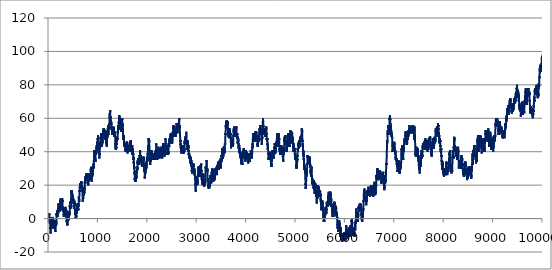
| Category | Series 0 |
|---|---|
| 0.0 | 1 |
| 1.0 | 2 |
| 2.0 | 3 |
| 3.0 | 2 |
| 4.0 | 3 |
| 5.0 | 2 |
| 6.0 | 1 |
| 7.0 | 0 |
| 8.0 | -1 |
| 9.0 | 0 |
| 10.0 | 1 |
| 11.0 | 0 |
| 12.0 | -1 |
| 13.0 | -2 |
| 14.0 | -1 |
| 15.0 | -2 |
| 16.0 | -3 |
| 17.0 | -2 |
| 18.0 | -3 |
| 19.0 | -2 |
| 20.0 | -1 |
| 21.0 | -2 |
| 22.0 | -1 |
| 23.0 | -2 |
| 24.0 | -3 |
| 25.0 | -4 |
| 26.0 | -5 |
| 27.0 | -6 |
| 28.0 | -5 |
| 29.0 | -6 |
| 30.0 | -7 |
| 31.0 | -8 |
| 32.0 | -9 |
| 33.0 | -8 |
| 34.0 | -7 |
| 35.0 | -6 |
| 36.0 | -5 |
| 37.0 | -6 |
| 38.0 | -5 |
| 39.0 | -4 |
| 40.0 | -5 |
| 41.0 | -4 |
| 42.0 | -3 |
| 43.0 | -2 |
| 44.0 | -1 |
| 45.0 | -2 |
| 46.0 | -1 |
| 47.0 | -2 |
| 48.0 | -3 |
| 49.0 | -2 |
| 50.0 | -1 |
| 51.0 | 0 |
| 52.0 | -1 |
| 53.0 | -2 |
| 54.0 | -3 |
| 55.0 | -2 |
| 56.0 | -1 |
| 57.0 | -2 |
| 58.0 | -1 |
| 59.0 | -2 |
| 60.0 | -1 |
| 61.0 | 0 |
| 62.0 | 1 |
| 63.0 | 0 |
| 64.0 | -1 |
| 65.0 | 0 |
| 66.0 | -1 |
| 67.0 | -2 |
| 68.0 | -1 |
| 69.0 | 0 |
| 70.0 | -1 |
| 71.0 | 0 |
| 72.0 | 1 |
| 73.0 | 0 |
| 74.0 | -1 |
| 75.0 | -2 |
| 76.0 | -3 |
| 77.0 | -4 |
| 78.0 | -5 |
| 79.0 | -6 |
| 80.0 | -5 |
| 81.0 | -4 |
| 82.0 | -3 |
| 83.0 | -2 |
| 84.0 | -1 |
| 85.0 | 0 |
| 86.0 | -1 |
| 87.0 | -2 |
| 88.0 | -3 |
| 89.0 | -4 |
| 90.0 | -5 |
| 91.0 | -4 |
| 92.0 | -5 |
| 93.0 | -4 |
| 94.0 | -3 |
| 95.0 | -2 |
| 96.0 | -3 |
| 97.0 | -4 |
| 98.0 | -3 |
| 99.0 | -4 |
| 100.0 | -3 |
| 101.0 | -2 |
| 102.0 | -3 |
| 103.0 | -4 |
| 104.0 | -3 |
| 105.0 | -2 |
| 106.0 | -1 |
| 107.0 | -2 |
| 108.0 | -3 |
| 109.0 | -4 |
| 110.0 | -3 |
| 111.0 | -4 |
| 112.0 | -5 |
| 113.0 | -6 |
| 114.0 | -5 |
| 115.0 | -6 |
| 116.0 | -5 |
| 117.0 | -4 |
| 118.0 | -3 |
| 119.0 | -4 |
| 120.0 | -5 |
| 121.0 | -6 |
| 122.0 | -7 |
| 123.0 | -6 |
| 124.0 | -5 |
| 125.0 | -4 |
| 126.0 | -5 |
| 127.0 | -6 |
| 128.0 | -7 |
| 129.0 | -8 |
| 130.0 | -7 |
| 131.0 | -6 |
| 132.0 | -5 |
| 133.0 | -4 |
| 134.0 | -3 |
| 135.0 | -2 |
| 136.0 | -1 |
| 137.0 | -2 |
| 138.0 | -3 |
| 139.0 | -2 |
| 140.0 | -3 |
| 141.0 | -4 |
| 142.0 | -3 |
| 143.0 | -2 |
| 144.0 | -3 |
| 145.0 | -4 |
| 146.0 | -3 |
| 147.0 | -2 |
| 148.0 | -3 |
| 149.0 | -2 |
| 150.0 | -1 |
| 151.0 | 0 |
| 152.0 | 1 |
| 153.0 | 2 |
| 154.0 | 3 |
| 155.0 | 2 |
| 156.0 | 3 |
| 157.0 | 2 |
| 158.0 | 3 |
| 159.0 | 2 |
| 160.0 | 3 |
| 161.0 | 2 |
| 162.0 | 3 |
| 163.0 | 4 |
| 164.0 | 3 |
| 165.0 | 2 |
| 166.0 | 3 |
| 167.0 | 4 |
| 168.0 | 5 |
| 169.0 | 4 |
| 170.0 | 3 |
| 171.0 | 2 |
| 172.0 | 1 |
| 173.0 | 2 |
| 174.0 | 1 |
| 175.0 | 2 |
| 176.0 | 3 |
| 177.0 | 4 |
| 178.0 | 3 |
| 179.0 | 4 |
| 180.0 | 3 |
| 181.0 | 4 |
| 182.0 | 5 |
| 183.0 | 6 |
| 184.0 | 5 |
| 185.0 | 4 |
| 186.0 | 3 |
| 187.0 | 4 |
| 188.0 | 5 |
| 189.0 | 6 |
| 190.0 | 7 |
| 191.0 | 6 |
| 192.0 | 7 |
| 193.0 | 8 |
| 194.0 | 9 |
| 195.0 | 8 |
| 196.0 | 9 |
| 197.0 | 8 |
| 198.0 | 7 |
| 199.0 | 8 |
| 200.0 | 9 |
| 201.0 | 8 |
| 202.0 | 9 |
| 203.0 | 8 |
| 204.0 | 7 |
| 205.0 | 8 |
| 206.0 | 7 |
| 207.0 | 8 |
| 208.0 | 7 |
| 209.0 | 6 |
| 210.0 | 5 |
| 211.0 | 4 |
| 212.0 | 5 |
| 213.0 | 6 |
| 214.0 | 7 |
| 215.0 | 6 |
| 216.0 | 5 |
| 217.0 | 6 |
| 218.0 | 7 |
| 219.0 | 8 |
| 220.0 | 7 |
| 221.0 | 8 |
| 222.0 | 7 |
| 223.0 | 8 |
| 224.0 | 7 |
| 225.0 | 8 |
| 226.0 | 9 |
| 227.0 | 10 |
| 228.0 | 9 |
| 229.0 | 10 |
| 230.0 | 11 |
| 231.0 | 12 |
| 232.0 | 11 |
| 233.0 | 10 |
| 234.0 | 11 |
| 235.0 | 10 |
| 236.0 | 9 |
| 237.0 | 10 |
| 238.0 | 9 |
| 239.0 | 10 |
| 240.0 | 9 |
| 241.0 | 10 |
| 242.0 | 9 |
| 243.0 | 8 |
| 244.0 | 7 |
| 245.0 | 6 |
| 246.0 | 5 |
| 247.0 | 6 |
| 248.0 | 7 |
| 249.0 | 8 |
| 250.0 | 9 |
| 251.0 | 10 |
| 252.0 | 11 |
| 253.0 | 10 |
| 254.0 | 11 |
| 255.0 | 12 |
| 256.0 | 11 |
| 257.0 | 10 |
| 258.0 | 11 |
| 259.0 | 12 |
| 260.0 | 11 |
| 261.0 | 10 |
| 262.0 | 9 |
| 263.0 | 8 |
| 264.0 | 9 |
| 265.0 | 10 |
| 266.0 | 11 |
| 267.0 | 12 |
| 268.0 | 11 |
| 269.0 | 10 |
| 270.0 | 11 |
| 271.0 | 10 |
| 272.0 | 11 |
| 273.0 | 10 |
| 274.0 | 9 |
| 275.0 | 8 |
| 276.0 | 7 |
| 277.0 | 6 |
| 278.0 | 7 |
| 279.0 | 6 |
| 280.0 | 7 |
| 281.0 | 6 |
| 282.0 | 5 |
| 283.0 | 6 |
| 284.0 | 5 |
| 285.0 | 6 |
| 286.0 | 5 |
| 287.0 | 4 |
| 288.0 | 5 |
| 289.0 | 6 |
| 290.0 | 7 |
| 291.0 | 6 |
| 292.0 | 5 |
| 293.0 | 6 |
| 294.0 | 5 |
| 295.0 | 4 |
| 296.0 | 3 |
| 297.0 | 2 |
| 298.0 | 1 |
| 299.0 | 2 |
| 300.0 | 3 |
| 301.0 | 2 |
| 302.0 | 1 |
| 303.0 | 2 |
| 304.0 | 3 |
| 305.0 | 4 |
| 306.0 | 3 |
| 307.0 | 4 |
| 308.0 | 3 |
| 309.0 | 4 |
| 310.0 | 3 |
| 311.0 | 4 |
| 312.0 | 5 |
| 313.0 | 4 |
| 314.0 | 3 |
| 315.0 | 2 |
| 316.0 | 3 |
| 317.0 | 4 |
| 318.0 | 3 |
| 319.0 | 2 |
| 320.0 | 3 |
| 321.0 | 2 |
| 322.0 | 1 |
| 323.0 | 2 |
| 324.0 | 3 |
| 325.0 | 4 |
| 326.0 | 3 |
| 327.0 | 2 |
| 328.0 | 3 |
| 329.0 | 4 |
| 330.0 | 5 |
| 331.0 | 6 |
| 332.0 | 7 |
| 333.0 | 6 |
| 334.0 | 5 |
| 335.0 | 4 |
| 336.0 | 5 |
| 337.0 | 6 |
| 338.0 | 5 |
| 339.0 | 4 |
| 340.0 | 3 |
| 341.0 | 2 |
| 342.0 | 1 |
| 343.0 | 2 |
| 344.0 | 3 |
| 345.0 | 4 |
| 346.0 | 5 |
| 347.0 | 4 |
| 348.0 | 5 |
| 349.0 | 4 |
| 350.0 | 5 |
| 351.0 | 4 |
| 352.0 | 3 |
| 353.0 | 2 |
| 354.0 | 1 |
| 355.0 | 0 |
| 356.0 | 1 |
| 357.0 | 0 |
| 358.0 | -1 |
| 359.0 | -2 |
| 360.0 | -1 |
| 361.0 | -2 |
| 362.0 | -3 |
| 363.0 | -2 |
| 364.0 | -1 |
| 365.0 | -2 |
| 366.0 | -1 |
| 367.0 | -2 |
| 368.0 | -3 |
| 369.0 | -4 |
| 370.0 | -3 |
| 371.0 | -4 |
| 372.0 | -3 |
| 373.0 | -2 |
| 374.0 | -1 |
| 375.0 | 0 |
| 376.0 | -1 |
| 377.0 | -2 |
| 378.0 | -1 |
| 379.0 | 0 |
| 380.0 | 1 |
| 381.0 | 2 |
| 382.0 | 3 |
| 383.0 | 4 |
| 384.0 | 3 |
| 385.0 | 4 |
| 386.0 | 3 |
| 387.0 | 4 |
| 388.0 | 3 |
| 389.0 | 4 |
| 390.0 | 3 |
| 391.0 | 2 |
| 392.0 | 1 |
| 393.0 | 2 |
| 394.0 | 1 |
| 395.0 | 0 |
| 396.0 | -1 |
| 397.0 | 0 |
| 398.0 | 1 |
| 399.0 | 0 |
| 400.0 | 1 |
| 401.0 | 2 |
| 402.0 | 1 |
| 403.0 | 2 |
| 404.0 | 3 |
| 405.0 | 2 |
| 406.0 | 1 |
| 407.0 | 2 |
| 408.0 | 3 |
| 409.0 | 4 |
| 410.0 | 3 |
| 411.0 | 2 |
| 412.0 | 3 |
| 413.0 | 4 |
| 414.0 | 3 |
| 415.0 | 2 |
| 416.0 | 3 |
| 417.0 | 4 |
| 418.0 | 5 |
| 419.0 | 6 |
| 420.0 | 7 |
| 421.0 | 8 |
| 422.0 | 7 |
| 423.0 | 8 |
| 424.0 | 7 |
| 425.0 | 6 |
| 426.0 | 7 |
| 427.0 | 8 |
| 428.0 | 9 |
| 429.0 | 10 |
| 430.0 | 9 |
| 431.0 | 10 |
| 432.0 | 9 |
| 433.0 | 10 |
| 434.0 | 9 |
| 435.0 | 8 |
| 436.0 | 7 |
| 437.0 | 6 |
| 438.0 | 7 |
| 439.0 | 8 |
| 440.0 | 7 |
| 441.0 | 6 |
| 442.0 | 7 |
| 443.0 | 8 |
| 444.0 | 9 |
| 445.0 | 10 |
| 446.0 | 11 |
| 447.0 | 12 |
| 448.0 | 11 |
| 449.0 | 12 |
| 450.0 | 13 |
| 451.0 | 14 |
| 452.0 | 15 |
| 453.0 | 16 |
| 454.0 | 15 |
| 455.0 | 16 |
| 456.0 | 17 |
| 457.0 | 16 |
| 458.0 | 17 |
| 459.0 | 16 |
| 460.0 | 15 |
| 461.0 | 14 |
| 462.0 | 15 |
| 463.0 | 16 |
| 464.0 | 17 |
| 465.0 | 16 |
| 466.0 | 15 |
| 467.0 | 14 |
| 468.0 | 13 |
| 469.0 | 14 |
| 470.0 | 13 |
| 471.0 | 14 |
| 472.0 | 15 |
| 473.0 | 14 |
| 474.0 | 13 |
| 475.0 | 12 |
| 476.0 | 13 |
| 477.0 | 12 |
| 478.0 | 13 |
| 479.0 | 12 |
| 480.0 | 11 |
| 481.0 | 10 |
| 482.0 | 11 |
| 483.0 | 10 |
| 484.0 | 11 |
| 485.0 | 10 |
| 486.0 | 11 |
| 487.0 | 10 |
| 488.0 | 11 |
| 489.0 | 10 |
| 490.0 | 11 |
| 491.0 | 10 |
| 492.0 | 11 |
| 493.0 | 12 |
| 494.0 | 11 |
| 495.0 | 10 |
| 496.0 | 9 |
| 497.0 | 10 |
| 498.0 | 9 |
| 499.0 | 8 |
| 500.0 | 7 |
| 501.0 | 8 |
| 502.0 | 7 |
| 503.0 | 6 |
| 504.0 | 7 |
| 505.0 | 8 |
| 506.0 | 9 |
| 507.0 | 8 |
| 508.0 | 9 |
| 509.0 | 10 |
| 510.0 | 11 |
| 511.0 | 10 |
| 512.0 | 9 |
| 513.0 | 8 |
| 514.0 | 9 |
| 515.0 | 8 |
| 516.0 | 9 |
| 517.0 | 8 |
| 518.0 | 9 |
| 519.0 | 10 |
| 520.0 | 9 |
| 521.0 | 8 |
| 522.0 | 7 |
| 523.0 | 6 |
| 524.0 | 5 |
| 525.0 | 4 |
| 526.0 | 5 |
| 527.0 | 4 |
| 528.0 | 5 |
| 529.0 | 4 |
| 530.0 | 3 |
| 531.0 | 4 |
| 532.0 | 3 |
| 533.0 | 2 |
| 534.0 | 3 |
| 535.0 | 4 |
| 536.0 | 5 |
| 537.0 | 4 |
| 538.0 | 3 |
| 539.0 | 2 |
| 540.0 | 1 |
| 541.0 | 0 |
| 542.0 | 1 |
| 543.0 | 0 |
| 544.0 | 1 |
| 545.0 | 2 |
| 546.0 | 1 |
| 547.0 | 2 |
| 548.0 | 1 |
| 549.0 | 0 |
| 550.0 | 1 |
| 551.0 | 2 |
| 552.0 | 1 |
| 553.0 | 2 |
| 554.0 | 3 |
| 555.0 | 4 |
| 556.0 | 5 |
| 557.0 | 6 |
| 558.0 | 5 |
| 559.0 | 6 |
| 560.0 | 5 |
| 561.0 | 6 |
| 562.0 | 5 |
| 563.0 | 6 |
| 564.0 | 5 |
| 565.0 | 4 |
| 566.0 | 3 |
| 567.0 | 4 |
| 568.0 | 5 |
| 569.0 | 6 |
| 570.0 | 7 |
| 571.0 | 6 |
| 572.0 | 7 |
| 573.0 | 8 |
| 574.0 | 7 |
| 575.0 | 6 |
| 576.0 | 7 |
| 577.0 | 8 |
| 578.0 | 9 |
| 579.0 | 8 |
| 580.0 | 9 |
| 581.0 | 8 |
| 582.0 | 7 |
| 583.0 | 8 |
| 584.0 | 7 |
| 585.0 | 6 |
| 586.0 | 7 |
| 587.0 | 6 |
| 588.0 | 7 |
| 589.0 | 6 |
| 590.0 | 5 |
| 591.0 | 6 |
| 592.0 | 5 |
| 593.0 | 6 |
| 594.0 | 7 |
| 595.0 | 8 |
| 596.0 | 9 |
| 597.0 | 8 |
| 598.0 | 7 |
| 599.0 | 8 |
| 600.0 | 9 |
| 601.0 | 10 |
| 602.0 | 11 |
| 603.0 | 12 |
| 604.0 | 13 |
| 605.0 | 12 |
| 606.0 | 11 |
| 607.0 | 10 |
| 608.0 | 11 |
| 609.0 | 12 |
| 610.0 | 11 |
| 611.0 | 10 |
| 612.0 | 11 |
| 613.0 | 12 |
| 614.0 | 13 |
| 615.0 | 14 |
| 616.0 | 15 |
| 617.0 | 16 |
| 618.0 | 17 |
| 619.0 | 16 |
| 620.0 | 17 |
| 621.0 | 16 |
| 622.0 | 17 |
| 623.0 | 18 |
| 624.0 | 19 |
| 625.0 | 18 |
| 626.0 | 19 |
| 627.0 | 20 |
| 628.0 | 21 |
| 629.0 | 20 |
| 630.0 | 21 |
| 631.0 | 20 |
| 632.0 | 19 |
| 633.0 | 18 |
| 634.0 | 19 |
| 635.0 | 20 |
| 636.0 | 19 |
| 637.0 | 20 |
| 638.0 | 19 |
| 639.0 | 20 |
| 640.0 | 21 |
| 641.0 | 20 |
| 642.0 | 19 |
| 643.0 | 20 |
| 644.0 | 21 |
| 645.0 | 20 |
| 646.0 | 21 |
| 647.0 | 20 |
| 648.0 | 21 |
| 649.0 | 22 |
| 650.0 | 21 |
| 651.0 | 22 |
| 652.0 | 21 |
| 653.0 | 22 |
| 654.0 | 21 |
| 655.0 | 22 |
| 656.0 | 21 |
| 657.0 | 20 |
| 658.0 | 19 |
| 659.0 | 18 |
| 660.0 | 19 |
| 661.0 | 20 |
| 662.0 | 19 |
| 663.0 | 20 |
| 664.0 | 19 |
| 665.0 | 18 |
| 666.0 | 17 |
| 667.0 | 18 |
| 668.0 | 19 |
| 669.0 | 18 |
| 670.0 | 17 |
| 671.0 | 16 |
| 672.0 | 17 |
| 673.0 | 18 |
| 674.0 | 17 |
| 675.0 | 18 |
| 676.0 | 17 |
| 677.0 | 16 |
| 678.0 | 15 |
| 679.0 | 14 |
| 680.0 | 13 |
| 681.0 | 12 |
| 682.0 | 11 |
| 683.0 | 10 |
| 684.0 | 11 |
| 685.0 | 12 |
| 686.0 | 13 |
| 687.0 | 14 |
| 688.0 | 13 |
| 689.0 | 12 |
| 690.0 | 13 |
| 691.0 | 12 |
| 692.0 | 13 |
| 693.0 | 14 |
| 694.0 | 15 |
| 695.0 | 16 |
| 696.0 | 15 |
| 697.0 | 14 |
| 698.0 | 15 |
| 699.0 | 14 |
| 700.0 | 15 |
| 701.0 | 16 |
| 702.0 | 15 |
| 703.0 | 16 |
| 704.0 | 15 |
| 705.0 | 16 |
| 706.0 | 15 |
| 707.0 | 14 |
| 708.0 | 15 |
| 709.0 | 16 |
| 710.0 | 17 |
| 711.0 | 18 |
| 712.0 | 17 |
| 713.0 | 18 |
| 714.0 | 17 |
| 715.0 | 16 |
| 716.0 | 15 |
| 717.0 | 16 |
| 718.0 | 17 |
| 719.0 | 18 |
| 720.0 | 19 |
| 721.0 | 18 |
| 722.0 | 19 |
| 723.0 | 20 |
| 724.0 | 21 |
| 725.0 | 22 |
| 726.0 | 21 |
| 727.0 | 22 |
| 728.0 | 23 |
| 729.0 | 24 |
| 730.0 | 23 |
| 731.0 | 24 |
| 732.0 | 25 |
| 733.0 | 24 |
| 734.0 | 23 |
| 735.0 | 24 |
| 736.0 | 25 |
| 737.0 | 24 |
| 738.0 | 23 |
| 739.0 | 24 |
| 740.0 | 25 |
| 741.0 | 24 |
| 742.0 | 25 |
| 743.0 | 24 |
| 744.0 | 23 |
| 745.0 | 24 |
| 746.0 | 25 |
| 747.0 | 24 |
| 748.0 | 25 |
| 749.0 | 24 |
| 750.0 | 25 |
| 751.0 | 26 |
| 752.0 | 25 |
| 753.0 | 26 |
| 754.0 | 27 |
| 755.0 | 26 |
| 756.0 | 25 |
| 757.0 | 26 |
| 758.0 | 25 |
| 759.0 | 24 |
| 760.0 | 25 |
| 761.0 | 24 |
| 762.0 | 25 |
| 763.0 | 26 |
| 764.0 | 27 |
| 765.0 | 26 |
| 766.0 | 25 |
| 767.0 | 26 |
| 768.0 | 25 |
| 769.0 | 26 |
| 770.0 | 25 |
| 771.0 | 26 |
| 772.0 | 25 |
| 773.0 | 24 |
| 774.0 | 25 |
| 775.0 | 24 |
| 776.0 | 23 |
| 777.0 | 24 |
| 778.0 | 23 |
| 779.0 | 24 |
| 780.0 | 23 |
| 781.0 | 22 |
| 782.0 | 21 |
| 783.0 | 22 |
| 784.0 | 23 |
| 785.0 | 22 |
| 786.0 | 21 |
| 787.0 | 22 |
| 788.0 | 21 |
| 789.0 | 22 |
| 790.0 | 21 |
| 791.0 | 20 |
| 792.0 | 21 |
| 793.0 | 20 |
| 794.0 | 21 |
| 795.0 | 22 |
| 796.0 | 23 |
| 797.0 | 22 |
| 798.0 | 23 |
| 799.0 | 24 |
| 800.0 | 23 |
| 801.0 | 22 |
| 802.0 | 23 |
| 803.0 | 24 |
| 804.0 | 25 |
| 805.0 | 26 |
| 806.0 | 27 |
| 807.0 | 26 |
| 808.0 | 25 |
| 809.0 | 26 |
| 810.0 | 25 |
| 811.0 | 24 |
| 812.0 | 23 |
| 813.0 | 24 |
| 814.0 | 25 |
| 815.0 | 24 |
| 816.0 | 25 |
| 817.0 | 24 |
| 818.0 | 23 |
| 819.0 | 24 |
| 820.0 | 25 |
| 821.0 | 24 |
| 822.0 | 25 |
| 823.0 | 24 |
| 824.0 | 23 |
| 825.0 | 24 |
| 826.0 | 25 |
| 827.0 | 24 |
| 828.0 | 25 |
| 829.0 | 24 |
| 830.0 | 25 |
| 831.0 | 26 |
| 832.0 | 27 |
| 833.0 | 26 |
| 834.0 | 25 |
| 835.0 | 24 |
| 836.0 | 25 |
| 837.0 | 24 |
| 838.0 | 25 |
| 839.0 | 26 |
| 840.0 | 25 |
| 841.0 | 26 |
| 842.0 | 27 |
| 843.0 | 28 |
| 844.0 | 29 |
| 845.0 | 30 |
| 846.0 | 29 |
| 847.0 | 28 |
| 848.0 | 29 |
| 849.0 | 28 |
| 850.0 | 29 |
| 851.0 | 28 |
| 852.0 | 29 |
| 853.0 | 28 |
| 854.0 | 29 |
| 855.0 | 30 |
| 856.0 | 31 |
| 857.0 | 30 |
| 858.0 | 29 |
| 859.0 | 28 |
| 860.0 | 27 |
| 861.0 | 26 |
| 862.0 | 25 |
| 863.0 | 24 |
| 864.0 | 23 |
| 865.0 | 22 |
| 866.0 | 23 |
| 867.0 | 24 |
| 868.0 | 25 |
| 869.0 | 26 |
| 870.0 | 27 |
| 871.0 | 28 |
| 872.0 | 27 |
| 873.0 | 28 |
| 874.0 | 27 |
| 875.0 | 26 |
| 876.0 | 25 |
| 877.0 | 26 |
| 878.0 | 27 |
| 879.0 | 26 |
| 880.0 | 27 |
| 881.0 | 26 |
| 882.0 | 27 |
| 883.0 | 28 |
| 884.0 | 29 |
| 885.0 | 30 |
| 886.0 | 29 |
| 887.0 | 30 |
| 888.0 | 29 |
| 889.0 | 28 |
| 890.0 | 29 |
| 891.0 | 30 |
| 892.0 | 29 |
| 893.0 | 30 |
| 894.0 | 31 |
| 895.0 | 30 |
| 896.0 | 31 |
| 897.0 | 32 |
| 898.0 | 31 |
| 899.0 | 32 |
| 900.0 | 31 |
| 901.0 | 30 |
| 902.0 | 31 |
| 903.0 | 32 |
| 904.0 | 33 |
| 905.0 | 32 |
| 906.0 | 33 |
| 907.0 | 34 |
| 908.0 | 35 |
| 909.0 | 36 |
| 910.0 | 37 |
| 911.0 | 38 |
| 912.0 | 37 |
| 913.0 | 38 |
| 914.0 | 39 |
| 915.0 | 40 |
| 916.0 | 41 |
| 917.0 | 40 |
| 918.0 | 39 |
| 919.0 | 40 |
| 920.0 | 39 |
| 921.0 | 40 |
| 922.0 | 39 |
| 923.0 | 38 |
| 924.0 | 37 |
| 925.0 | 36 |
| 926.0 | 37 |
| 927.0 | 36 |
| 928.0 | 37 |
| 929.0 | 38 |
| 930.0 | 37 |
| 931.0 | 36 |
| 932.0 | 35 |
| 933.0 | 36 |
| 934.0 | 35 |
| 935.0 | 34 |
| 936.0 | 35 |
| 937.0 | 36 |
| 938.0 | 35 |
| 939.0 | 34 |
| 940.0 | 35 |
| 941.0 | 36 |
| 942.0 | 37 |
| 943.0 | 38 |
| 944.0 | 39 |
| 945.0 | 40 |
| 946.0 | 41 |
| 947.0 | 40 |
| 948.0 | 41 |
| 949.0 | 40 |
| 950.0 | 39 |
| 951.0 | 38 |
| 952.0 | 39 |
| 953.0 | 38 |
| 954.0 | 39 |
| 955.0 | 40 |
| 956.0 | 39 |
| 957.0 | 40 |
| 958.0 | 41 |
| 959.0 | 40 |
| 960.0 | 41 |
| 961.0 | 42 |
| 962.0 | 43 |
| 963.0 | 42 |
| 964.0 | 41 |
| 965.0 | 42 |
| 966.0 | 43 |
| 967.0 | 44 |
| 968.0 | 43 |
| 969.0 | 42 |
| 970.0 | 43 |
| 971.0 | 44 |
| 972.0 | 45 |
| 973.0 | 46 |
| 974.0 | 45 |
| 975.0 | 46 |
| 976.0 | 45 |
| 977.0 | 44 |
| 978.0 | 45 |
| 979.0 | 46 |
| 980.0 | 45 |
| 981.0 | 44 |
| 982.0 | 45 |
| 983.0 | 44 |
| 984.0 | 45 |
| 985.0 | 46 |
| 986.0 | 47 |
| 987.0 | 48 |
| 988.0 | 47 |
| 989.0 | 48 |
| 990.0 | 49 |
| 991.0 | 50 |
| 992.0 | 49 |
| 993.0 | 50 |
| 994.0 | 49 |
| 995.0 | 48 |
| 996.0 | 49 |
| 997.0 | 48 |
| 998.0 | 47 |
| 999.0 | 46 |
| 1000.0 | 45 |
| 1001.0 | 44 |
| 1002.0 | 43 |
| 1003.0 | 44 |
| 1004.0 | 43 |
| 1005.0 | 44 |
| 1006.0 | 43 |
| 1007.0 | 42 |
| 1008.0 | 43 |
| 1009.0 | 42 |
| 1010.0 | 41 |
| 1011.0 | 40 |
| 1012.0 | 39 |
| 1013.0 | 38 |
| 1014.0 | 39 |
| 1015.0 | 38 |
| 1016.0 | 39 |
| 1017.0 | 38 |
| 1018.0 | 37 |
| 1019.0 | 36 |
| 1020.0 | 37 |
| 1021.0 | 38 |
| 1022.0 | 39 |
| 1023.0 | 38 |
| 1024.0 | 39 |
| 1025.0 | 40 |
| 1026.0 | 41 |
| 1027.0 | 42 |
| 1028.0 | 43 |
| 1029.0 | 42 |
| 1030.0 | 43 |
| 1031.0 | 44 |
| 1032.0 | 45 |
| 1033.0 | 44 |
| 1034.0 | 45 |
| 1035.0 | 46 |
| 1036.0 | 45 |
| 1037.0 | 44 |
| 1038.0 | 45 |
| 1039.0 | 46 |
| 1040.0 | 45 |
| 1041.0 | 44 |
| 1042.0 | 43 |
| 1043.0 | 44 |
| 1044.0 | 45 |
| 1045.0 | 46 |
| 1046.0 | 47 |
| 1047.0 | 48 |
| 1048.0 | 47 |
| 1049.0 | 48 |
| 1050.0 | 49 |
| 1051.0 | 50 |
| 1052.0 | 51 |
| 1053.0 | 50 |
| 1054.0 | 49 |
| 1055.0 | 50 |
| 1056.0 | 49 |
| 1057.0 | 48 |
| 1058.0 | 47 |
| 1059.0 | 46 |
| 1060.0 | 45 |
| 1061.0 | 46 |
| 1062.0 | 45 |
| 1063.0 | 44 |
| 1064.0 | 43 |
| 1065.0 | 44 |
| 1066.0 | 45 |
| 1067.0 | 46 |
| 1068.0 | 47 |
| 1069.0 | 48 |
| 1070.0 | 47 |
| 1071.0 | 46 |
| 1072.0 | 45 |
| 1073.0 | 44 |
| 1074.0 | 43 |
| 1075.0 | 44 |
| 1076.0 | 45 |
| 1077.0 | 46 |
| 1078.0 | 47 |
| 1079.0 | 46 |
| 1080.0 | 47 |
| 1081.0 | 46 |
| 1082.0 | 45 |
| 1083.0 | 46 |
| 1084.0 | 47 |
| 1085.0 | 48 |
| 1086.0 | 49 |
| 1087.0 | 50 |
| 1088.0 | 49 |
| 1089.0 | 50 |
| 1090.0 | 51 |
| 1091.0 | 50 |
| 1092.0 | 49 |
| 1093.0 | 50 |
| 1094.0 | 51 |
| 1095.0 | 52 |
| 1096.0 | 51 |
| 1097.0 | 52 |
| 1098.0 | 53 |
| 1099.0 | 52 |
| 1100.0 | 51 |
| 1101.0 | 52 |
| 1102.0 | 53 |
| 1103.0 | 52 |
| 1104.0 | 53 |
| 1105.0 | 54 |
| 1106.0 | 53 |
| 1107.0 | 52 |
| 1108.0 | 51 |
| 1109.0 | 50 |
| 1110.0 | 51 |
| 1111.0 | 50 |
| 1112.0 | 51 |
| 1113.0 | 52 |
| 1114.0 | 53 |
| 1115.0 | 54 |
| 1116.0 | 53 |
| 1117.0 | 52 |
| 1118.0 | 51 |
| 1119.0 | 50 |
| 1120.0 | 49 |
| 1121.0 | 48 |
| 1122.0 | 49 |
| 1123.0 | 48 |
| 1124.0 | 49 |
| 1125.0 | 50 |
| 1126.0 | 49 |
| 1127.0 | 48 |
| 1128.0 | 47 |
| 1129.0 | 48 |
| 1130.0 | 49 |
| 1131.0 | 50 |
| 1132.0 | 51 |
| 1133.0 | 52 |
| 1134.0 | 53 |
| 1135.0 | 52 |
| 1136.0 | 51 |
| 1137.0 | 52 |
| 1138.0 | 51 |
| 1139.0 | 52 |
| 1140.0 | 51 |
| 1141.0 | 52 |
| 1142.0 | 53 |
| 1143.0 | 52 |
| 1144.0 | 51 |
| 1145.0 | 52 |
| 1146.0 | 51 |
| 1147.0 | 50 |
| 1148.0 | 49 |
| 1149.0 | 50 |
| 1150.0 | 51 |
| 1151.0 | 50 |
| 1152.0 | 49 |
| 1153.0 | 50 |
| 1154.0 | 49 |
| 1155.0 | 50 |
| 1156.0 | 49 |
| 1157.0 | 48 |
| 1158.0 | 47 |
| 1159.0 | 46 |
| 1160.0 | 47 |
| 1161.0 | 46 |
| 1162.0 | 45 |
| 1163.0 | 46 |
| 1164.0 | 45 |
| 1165.0 | 46 |
| 1166.0 | 45 |
| 1167.0 | 44 |
| 1168.0 | 43 |
| 1169.0 | 44 |
| 1170.0 | 45 |
| 1171.0 | 44 |
| 1172.0 | 45 |
| 1173.0 | 46 |
| 1174.0 | 47 |
| 1175.0 | 48 |
| 1176.0 | 49 |
| 1177.0 | 50 |
| 1178.0 | 49 |
| 1179.0 | 48 |
| 1180.0 | 49 |
| 1181.0 | 50 |
| 1182.0 | 51 |
| 1183.0 | 52 |
| 1184.0 | 51 |
| 1185.0 | 50 |
| 1186.0 | 49 |
| 1187.0 | 50 |
| 1188.0 | 51 |
| 1189.0 | 52 |
| 1190.0 | 53 |
| 1191.0 | 54 |
| 1192.0 | 53 |
| 1193.0 | 52 |
| 1194.0 | 53 |
| 1195.0 | 54 |
| 1196.0 | 55 |
| 1197.0 | 56 |
| 1198.0 | 55 |
| 1199.0 | 54 |
| 1200.0 | 53 |
| 1201.0 | 54 |
| 1202.0 | 53 |
| 1203.0 | 52 |
| 1204.0 | 51 |
| 1205.0 | 50 |
| 1206.0 | 51 |
| 1207.0 | 52 |
| 1208.0 | 53 |
| 1209.0 | 54 |
| 1210.0 | 55 |
| 1211.0 | 54 |
| 1212.0 | 55 |
| 1213.0 | 54 |
| 1214.0 | 55 |
| 1215.0 | 56 |
| 1216.0 | 55 |
| 1217.0 | 56 |
| 1218.0 | 57 |
| 1219.0 | 56 |
| 1220.0 | 55 |
| 1221.0 | 56 |
| 1222.0 | 57 |
| 1223.0 | 58 |
| 1224.0 | 59 |
| 1225.0 | 60 |
| 1226.0 | 61 |
| 1227.0 | 62 |
| 1228.0 | 63 |
| 1229.0 | 62 |
| 1230.0 | 61 |
| 1231.0 | 60 |
| 1232.0 | 61 |
| 1233.0 | 62 |
| 1234.0 | 63 |
| 1235.0 | 64 |
| 1236.0 | 63 |
| 1237.0 | 64 |
| 1238.0 | 65 |
| 1239.0 | 64 |
| 1240.0 | 63 |
| 1241.0 | 62 |
| 1242.0 | 61 |
| 1243.0 | 60 |
| 1244.0 | 61 |
| 1245.0 | 60 |
| 1246.0 | 61 |
| 1247.0 | 60 |
| 1248.0 | 59 |
| 1249.0 | 58 |
| 1250.0 | 57 |
| 1251.0 | 56 |
| 1252.0 | 57 |
| 1253.0 | 58 |
| 1254.0 | 57 |
| 1255.0 | 58 |
| 1256.0 | 59 |
| 1257.0 | 58 |
| 1258.0 | 57 |
| 1259.0 | 56 |
| 1260.0 | 57 |
| 1261.0 | 58 |
| 1262.0 | 57 |
| 1263.0 | 56 |
| 1264.0 | 55 |
| 1265.0 | 54 |
| 1266.0 | 55 |
| 1267.0 | 54 |
| 1268.0 | 55 |
| 1269.0 | 54 |
| 1270.0 | 53 |
| 1271.0 | 54 |
| 1272.0 | 53 |
| 1273.0 | 54 |
| 1274.0 | 53 |
| 1275.0 | 54 |
| 1276.0 | 53 |
| 1277.0 | 52 |
| 1278.0 | 53 |
| 1279.0 | 52 |
| 1280.0 | 51 |
| 1281.0 | 50 |
| 1282.0 | 51 |
| 1283.0 | 50 |
| 1284.0 | 51 |
| 1285.0 | 50 |
| 1286.0 | 51 |
| 1287.0 | 52 |
| 1288.0 | 53 |
| 1289.0 | 52 |
| 1290.0 | 53 |
| 1291.0 | 52 |
| 1292.0 | 51 |
| 1293.0 | 52 |
| 1294.0 | 53 |
| 1295.0 | 52 |
| 1296.0 | 51 |
| 1297.0 | 52 |
| 1298.0 | 53 |
| 1299.0 | 52 |
| 1300.0 | 53 |
| 1301.0 | 52 |
| 1302.0 | 53 |
| 1303.0 | 52 |
| 1304.0 | 51 |
| 1305.0 | 52 |
| 1306.0 | 53 |
| 1307.0 | 54 |
| 1308.0 | 53 |
| 1309.0 | 54 |
| 1310.0 | 55 |
| 1311.0 | 54 |
| 1312.0 | 53 |
| 1313.0 | 52 |
| 1314.0 | 51 |
| 1315.0 | 52 |
| 1316.0 | 51 |
| 1317.0 | 50 |
| 1318.0 | 49 |
| 1319.0 | 50 |
| 1320.0 | 49 |
| 1321.0 | 50 |
| 1322.0 | 49 |
| 1323.0 | 50 |
| 1324.0 | 49 |
| 1325.0 | 50 |
| 1326.0 | 51 |
| 1327.0 | 50 |
| 1328.0 | 49 |
| 1329.0 | 50 |
| 1330.0 | 51 |
| 1331.0 | 52 |
| 1332.0 | 51 |
| 1333.0 | 50 |
| 1334.0 | 51 |
| 1335.0 | 52 |
| 1336.0 | 51 |
| 1337.0 | 50 |
| 1338.0 | 49 |
| 1339.0 | 48 |
| 1340.0 | 47 |
| 1341.0 | 46 |
| 1342.0 | 45 |
| 1343.0 | 44 |
| 1344.0 | 45 |
| 1345.0 | 44 |
| 1346.0 | 43 |
| 1347.0 | 42 |
| 1348.0 | 43 |
| 1349.0 | 44 |
| 1350.0 | 43 |
| 1351.0 | 42 |
| 1352.0 | 41 |
| 1353.0 | 42 |
| 1354.0 | 43 |
| 1355.0 | 44 |
| 1356.0 | 45 |
| 1357.0 | 44 |
| 1358.0 | 43 |
| 1359.0 | 42 |
| 1360.0 | 43 |
| 1361.0 | 42 |
| 1362.0 | 43 |
| 1363.0 | 44 |
| 1364.0 | 45 |
| 1365.0 | 44 |
| 1366.0 | 45 |
| 1367.0 | 44 |
| 1368.0 | 45 |
| 1369.0 | 44 |
| 1370.0 | 45 |
| 1371.0 | 46 |
| 1372.0 | 47 |
| 1373.0 | 46 |
| 1374.0 | 47 |
| 1375.0 | 46 |
| 1376.0 | 47 |
| 1377.0 | 48 |
| 1378.0 | 49 |
| 1379.0 | 48 |
| 1380.0 | 47 |
| 1381.0 | 48 |
| 1382.0 | 49 |
| 1383.0 | 48 |
| 1384.0 | 47 |
| 1385.0 | 48 |
| 1386.0 | 47 |
| 1387.0 | 48 |
| 1388.0 | 49 |
| 1389.0 | 50 |
| 1390.0 | 51 |
| 1391.0 | 52 |
| 1392.0 | 51 |
| 1393.0 | 52 |
| 1394.0 | 53 |
| 1395.0 | 52 |
| 1396.0 | 53 |
| 1397.0 | 54 |
| 1398.0 | 55 |
| 1399.0 | 56 |
| 1400.0 | 55 |
| 1401.0 | 54 |
| 1402.0 | 53 |
| 1403.0 | 54 |
| 1404.0 | 53 |
| 1405.0 | 54 |
| 1406.0 | 55 |
| 1407.0 | 54 |
| 1408.0 | 55 |
| 1409.0 | 54 |
| 1410.0 | 55 |
| 1411.0 | 56 |
| 1412.0 | 57 |
| 1413.0 | 58 |
| 1414.0 | 57 |
| 1415.0 | 58 |
| 1416.0 | 59 |
| 1417.0 | 60 |
| 1418.0 | 59 |
| 1419.0 | 60 |
| 1420.0 | 59 |
| 1421.0 | 60 |
| 1422.0 | 61 |
| 1423.0 | 62 |
| 1424.0 | 61 |
| 1425.0 | 60 |
| 1426.0 | 61 |
| 1427.0 | 60 |
| 1428.0 | 59 |
| 1429.0 | 58 |
| 1430.0 | 57 |
| 1431.0 | 58 |
| 1432.0 | 57 |
| 1433.0 | 56 |
| 1434.0 | 55 |
| 1435.0 | 54 |
| 1436.0 | 55 |
| 1437.0 | 56 |
| 1438.0 | 55 |
| 1439.0 | 54 |
| 1440.0 | 55 |
| 1441.0 | 54 |
| 1442.0 | 55 |
| 1443.0 | 56 |
| 1444.0 | 57 |
| 1445.0 | 58 |
| 1446.0 | 57 |
| 1447.0 | 58 |
| 1448.0 | 59 |
| 1449.0 | 60 |
| 1450.0 | 59 |
| 1451.0 | 60 |
| 1452.0 | 59 |
| 1453.0 | 58 |
| 1454.0 | 57 |
| 1455.0 | 56 |
| 1456.0 | 55 |
| 1457.0 | 56 |
| 1458.0 | 55 |
| 1459.0 | 54 |
| 1460.0 | 55 |
| 1461.0 | 54 |
| 1462.0 | 53 |
| 1463.0 | 52 |
| 1464.0 | 53 |
| 1465.0 | 54 |
| 1466.0 | 55 |
| 1467.0 | 54 |
| 1468.0 | 55 |
| 1469.0 | 54 |
| 1470.0 | 55 |
| 1471.0 | 54 |
| 1472.0 | 55 |
| 1473.0 | 54 |
| 1474.0 | 53 |
| 1475.0 | 54 |
| 1476.0 | 55 |
| 1477.0 | 56 |
| 1478.0 | 57 |
| 1479.0 | 58 |
| 1480.0 | 59 |
| 1481.0 | 60 |
| 1482.0 | 59 |
| 1483.0 | 58 |
| 1484.0 | 57 |
| 1485.0 | 56 |
| 1486.0 | 57 |
| 1487.0 | 56 |
| 1488.0 | 55 |
| 1489.0 | 56 |
| 1490.0 | 55 |
| 1491.0 | 56 |
| 1492.0 | 55 |
| 1493.0 | 54 |
| 1494.0 | 53 |
| 1495.0 | 54 |
| 1496.0 | 53 |
| 1497.0 | 52 |
| 1498.0 | 51 |
| 1499.0 | 50 |
| 1500.0 | 49 |
| 1501.0 | 48 |
| 1502.0 | 47 |
| 1503.0 | 48 |
| 1504.0 | 49 |
| 1505.0 | 50 |
| 1506.0 | 49 |
| 1507.0 | 50 |
| 1508.0 | 49 |
| 1509.0 | 50 |
| 1510.0 | 49 |
| 1511.0 | 50 |
| 1512.0 | 49 |
| 1513.0 | 50 |
| 1514.0 | 49 |
| 1515.0 | 50 |
| 1516.0 | 49 |
| 1517.0 | 48 |
| 1518.0 | 47 |
| 1519.0 | 46 |
| 1520.0 | 45 |
| 1521.0 | 46 |
| 1522.0 | 45 |
| 1523.0 | 44 |
| 1524.0 | 45 |
| 1525.0 | 46 |
| 1526.0 | 45 |
| 1527.0 | 44 |
| 1528.0 | 45 |
| 1529.0 | 44 |
| 1530.0 | 43 |
| 1531.0 | 44 |
| 1532.0 | 43 |
| 1533.0 | 44 |
| 1534.0 | 43 |
| 1535.0 | 44 |
| 1536.0 | 45 |
| 1537.0 | 44 |
| 1538.0 | 43 |
| 1539.0 | 44 |
| 1540.0 | 43 |
| 1541.0 | 44 |
| 1542.0 | 45 |
| 1543.0 | 44 |
| 1544.0 | 43 |
| 1545.0 | 42 |
| 1546.0 | 41 |
| 1547.0 | 42 |
| 1548.0 | 41 |
| 1549.0 | 40 |
| 1550.0 | 41 |
| 1551.0 | 42 |
| 1552.0 | 41 |
| 1553.0 | 42 |
| 1554.0 | 41 |
| 1555.0 | 42 |
| 1556.0 | 41 |
| 1557.0 | 42 |
| 1558.0 | 41 |
| 1559.0 | 40 |
| 1560.0 | 41 |
| 1561.0 | 40 |
| 1562.0 | 41 |
| 1563.0 | 40 |
| 1564.0 | 41 |
| 1565.0 | 42 |
| 1566.0 | 41 |
| 1567.0 | 40 |
| 1568.0 | 41 |
| 1569.0 | 40 |
| 1570.0 | 41 |
| 1571.0 | 42 |
| 1572.0 | 41 |
| 1573.0 | 42 |
| 1574.0 | 43 |
| 1575.0 | 44 |
| 1576.0 | 45 |
| 1577.0 | 44 |
| 1578.0 | 45 |
| 1579.0 | 46 |
| 1580.0 | 45 |
| 1581.0 | 46 |
| 1582.0 | 45 |
| 1583.0 | 44 |
| 1584.0 | 45 |
| 1585.0 | 44 |
| 1586.0 | 43 |
| 1587.0 | 42 |
| 1588.0 | 41 |
| 1589.0 | 40 |
| 1590.0 | 39 |
| 1591.0 | 40 |
| 1592.0 | 41 |
| 1593.0 | 42 |
| 1594.0 | 43 |
| 1595.0 | 42 |
| 1596.0 | 41 |
| 1597.0 | 42 |
| 1598.0 | 41 |
| 1599.0 | 42 |
| 1600.0 | 43 |
| 1601.0 | 44 |
| 1602.0 | 43 |
| 1603.0 | 42 |
| 1604.0 | 41 |
| 1605.0 | 42 |
| 1606.0 | 43 |
| 1607.0 | 42 |
| 1608.0 | 43 |
| 1609.0 | 42 |
| 1610.0 | 43 |
| 1611.0 | 44 |
| 1612.0 | 43 |
| 1613.0 | 42 |
| 1614.0 | 41 |
| 1615.0 | 42 |
| 1616.0 | 41 |
| 1617.0 | 40 |
| 1618.0 | 41 |
| 1619.0 | 40 |
| 1620.0 | 41 |
| 1621.0 | 42 |
| 1622.0 | 43 |
| 1623.0 | 42 |
| 1624.0 | 43 |
| 1625.0 | 44 |
| 1626.0 | 43 |
| 1627.0 | 44 |
| 1628.0 | 43 |
| 1629.0 | 42 |
| 1630.0 | 41 |
| 1631.0 | 42 |
| 1632.0 | 41 |
| 1633.0 | 40 |
| 1634.0 | 41 |
| 1635.0 | 42 |
| 1636.0 | 43 |
| 1637.0 | 42 |
| 1638.0 | 43 |
| 1639.0 | 44 |
| 1640.0 | 45 |
| 1641.0 | 46 |
| 1642.0 | 45 |
| 1643.0 | 46 |
| 1644.0 | 45 |
| 1645.0 | 46 |
| 1646.0 | 45 |
| 1647.0 | 44 |
| 1648.0 | 45 |
| 1649.0 | 44 |
| 1650.0 | 45 |
| 1651.0 | 46 |
| 1652.0 | 45 |
| 1653.0 | 46 |
| 1654.0 | 47 |
| 1655.0 | 46 |
| 1656.0 | 45 |
| 1657.0 | 46 |
| 1658.0 | 45 |
| 1659.0 | 44 |
| 1660.0 | 45 |
| 1661.0 | 44 |
| 1662.0 | 43 |
| 1663.0 | 44 |
| 1664.0 | 43 |
| 1665.0 | 44 |
| 1666.0 | 43 |
| 1667.0 | 42 |
| 1668.0 | 41 |
| 1669.0 | 42 |
| 1670.0 | 43 |
| 1671.0 | 44 |
| 1672.0 | 43 |
| 1673.0 | 42 |
| 1674.0 | 43 |
| 1675.0 | 42 |
| 1676.0 | 41 |
| 1677.0 | 40 |
| 1678.0 | 39 |
| 1679.0 | 38 |
| 1680.0 | 39 |
| 1681.0 | 40 |
| 1682.0 | 41 |
| 1683.0 | 42 |
| 1684.0 | 43 |
| 1685.0 | 44 |
| 1686.0 | 43 |
| 1687.0 | 42 |
| 1688.0 | 41 |
| 1689.0 | 40 |
| 1690.0 | 39 |
| 1691.0 | 40 |
| 1692.0 | 41 |
| 1693.0 | 40 |
| 1694.0 | 41 |
| 1695.0 | 40 |
| 1696.0 | 41 |
| 1697.0 | 40 |
| 1698.0 | 41 |
| 1699.0 | 42 |
| 1700.0 | 41 |
| 1701.0 | 40 |
| 1702.0 | 39 |
| 1703.0 | 38 |
| 1704.0 | 39 |
| 1705.0 | 38 |
| 1706.0 | 37 |
| 1707.0 | 36 |
| 1708.0 | 37 |
| 1709.0 | 36 |
| 1710.0 | 35 |
| 1711.0 | 36 |
| 1712.0 | 35 |
| 1713.0 | 36 |
| 1714.0 | 35 |
| 1715.0 | 34 |
| 1716.0 | 33 |
| 1717.0 | 34 |
| 1718.0 | 33 |
| 1719.0 | 32 |
| 1720.0 | 33 |
| 1721.0 | 32 |
| 1722.0 | 31 |
| 1723.0 | 30 |
| 1724.0 | 31 |
| 1725.0 | 30 |
| 1726.0 | 31 |
| 1727.0 | 30 |
| 1728.0 | 29 |
| 1729.0 | 28 |
| 1730.0 | 27 |
| 1731.0 | 28 |
| 1732.0 | 27 |
| 1733.0 | 26 |
| 1734.0 | 25 |
| 1735.0 | 24 |
| 1736.0 | 23 |
| 1737.0 | 24 |
| 1738.0 | 23 |
| 1739.0 | 22 |
| 1740.0 | 23 |
| 1741.0 | 24 |
| 1742.0 | 25 |
| 1743.0 | 24 |
| 1744.0 | 23 |
| 1745.0 | 24 |
| 1746.0 | 25 |
| 1747.0 | 24 |
| 1748.0 | 25 |
| 1749.0 | 26 |
| 1750.0 | 27 |
| 1751.0 | 26 |
| 1752.0 | 25 |
| 1753.0 | 26 |
| 1754.0 | 25 |
| 1755.0 | 26 |
| 1756.0 | 25 |
| 1757.0 | 24 |
| 1758.0 | 23 |
| 1759.0 | 22 |
| 1760.0 | 23 |
| 1761.0 | 22 |
| 1762.0 | 23 |
| 1763.0 | 24 |
| 1764.0 | 25 |
| 1765.0 | 26 |
| 1766.0 | 25 |
| 1767.0 | 26 |
| 1768.0 | 25 |
| 1769.0 | 24 |
| 1770.0 | 25 |
| 1771.0 | 26 |
| 1772.0 | 27 |
| 1773.0 | 28 |
| 1774.0 | 29 |
| 1775.0 | 28 |
| 1776.0 | 27 |
| 1777.0 | 28 |
| 1778.0 | 29 |
| 1779.0 | 28 |
| 1780.0 | 27 |
| 1781.0 | 28 |
| 1782.0 | 27 |
| 1783.0 | 28 |
| 1784.0 | 29 |
| 1785.0 | 30 |
| 1786.0 | 29 |
| 1787.0 | 30 |
| 1788.0 | 31 |
| 1789.0 | 30 |
| 1790.0 | 31 |
| 1791.0 | 32 |
| 1792.0 | 33 |
| 1793.0 | 34 |
| 1794.0 | 33 |
| 1795.0 | 34 |
| 1796.0 | 35 |
| 1797.0 | 34 |
| 1798.0 | 33 |
| 1799.0 | 34 |
| 1800.0 | 33 |
| 1801.0 | 34 |
| 1802.0 | 35 |
| 1803.0 | 36 |
| 1804.0 | 35 |
| 1805.0 | 36 |
| 1806.0 | 35 |
| 1807.0 | 36 |
| 1808.0 | 35 |
| 1809.0 | 34 |
| 1810.0 | 35 |
| 1811.0 | 34 |
| 1812.0 | 33 |
| 1813.0 | 32 |
| 1814.0 | 33 |
| 1815.0 | 34 |
| 1816.0 | 35 |
| 1817.0 | 36 |
| 1818.0 | 35 |
| 1819.0 | 36 |
| 1820.0 | 35 |
| 1821.0 | 36 |
| 1822.0 | 35 |
| 1823.0 | 34 |
| 1824.0 | 33 |
| 1825.0 | 32 |
| 1826.0 | 33 |
| 1827.0 | 34 |
| 1828.0 | 35 |
| 1829.0 | 36 |
| 1830.0 | 37 |
| 1831.0 | 38 |
| 1832.0 | 37 |
| 1833.0 | 36 |
| 1834.0 | 35 |
| 1835.0 | 36 |
| 1836.0 | 35 |
| 1837.0 | 36 |
| 1838.0 | 35 |
| 1839.0 | 36 |
| 1840.0 | 37 |
| 1841.0 | 38 |
| 1842.0 | 39 |
| 1843.0 | 40 |
| 1844.0 | 41 |
| 1845.0 | 40 |
| 1846.0 | 39 |
| 1847.0 | 38 |
| 1848.0 | 37 |
| 1849.0 | 36 |
| 1850.0 | 37 |
| 1851.0 | 36 |
| 1852.0 | 37 |
| 1853.0 | 38 |
| 1854.0 | 37 |
| 1855.0 | 36 |
| 1856.0 | 37 |
| 1857.0 | 38 |
| 1858.0 | 37 |
| 1859.0 | 38 |
| 1860.0 | 37 |
| 1861.0 | 38 |
| 1862.0 | 37 |
| 1863.0 | 38 |
| 1864.0 | 37 |
| 1865.0 | 36 |
| 1866.0 | 37 |
| 1867.0 | 36 |
| 1868.0 | 35 |
| 1869.0 | 34 |
| 1870.0 | 35 |
| 1871.0 | 34 |
| 1872.0 | 33 |
| 1873.0 | 34 |
| 1874.0 | 35 |
| 1875.0 | 34 |
| 1876.0 | 35 |
| 1877.0 | 34 |
| 1878.0 | 33 |
| 1879.0 | 32 |
| 1880.0 | 31 |
| 1881.0 | 32 |
| 1882.0 | 33 |
| 1883.0 | 34 |
| 1884.0 | 35 |
| 1885.0 | 36 |
| 1886.0 | 35 |
| 1887.0 | 34 |
| 1888.0 | 35 |
| 1889.0 | 36 |
| 1890.0 | 35 |
| 1891.0 | 34 |
| 1892.0 | 33 |
| 1893.0 | 32 |
| 1894.0 | 33 |
| 1895.0 | 34 |
| 1896.0 | 35 |
| 1897.0 | 34 |
| 1898.0 | 33 |
| 1899.0 | 32 |
| 1900.0 | 33 |
| 1901.0 | 34 |
| 1902.0 | 35 |
| 1903.0 | 36 |
| 1904.0 | 35 |
| 1905.0 | 34 |
| 1906.0 | 35 |
| 1907.0 | 34 |
| 1908.0 | 35 |
| 1909.0 | 36 |
| 1910.0 | 35 |
| 1911.0 | 36 |
| 1912.0 | 37 |
| 1913.0 | 36 |
| 1914.0 | 37 |
| 1915.0 | 36 |
| 1916.0 | 35 |
| 1917.0 | 36 |
| 1918.0 | 35 |
| 1919.0 | 34 |
| 1920.0 | 33 |
| 1921.0 | 32 |
| 1922.0 | 33 |
| 1923.0 | 32 |
| 1924.0 | 31 |
| 1925.0 | 30 |
| 1926.0 | 31 |
| 1927.0 | 30 |
| 1928.0 | 29 |
| 1929.0 | 30 |
| 1930.0 | 31 |
| 1931.0 | 30 |
| 1932.0 | 29 |
| 1933.0 | 28 |
| 1934.0 | 29 |
| 1935.0 | 28 |
| 1936.0 | 27 |
| 1937.0 | 26 |
| 1938.0 | 25 |
| 1939.0 | 24 |
| 1940.0 | 25 |
| 1941.0 | 26 |
| 1942.0 | 25 |
| 1943.0 | 26 |
| 1944.0 | 27 |
| 1945.0 | 28 |
| 1946.0 | 27 |
| 1947.0 | 28 |
| 1948.0 | 27 |
| 1949.0 | 28 |
| 1950.0 | 29 |
| 1951.0 | 30 |
| 1952.0 | 29 |
| 1953.0 | 30 |
| 1954.0 | 29 |
| 1955.0 | 28 |
| 1956.0 | 29 |
| 1957.0 | 30 |
| 1958.0 | 31 |
| 1959.0 | 30 |
| 1960.0 | 31 |
| 1961.0 | 32 |
| 1962.0 | 31 |
| 1963.0 | 30 |
| 1964.0 | 31 |
| 1965.0 | 32 |
| 1966.0 | 33 |
| 1967.0 | 32 |
| 1968.0 | 33 |
| 1969.0 | 34 |
| 1970.0 | 33 |
| 1971.0 | 32 |
| 1972.0 | 33 |
| 1973.0 | 32 |
| 1974.0 | 31 |
| 1975.0 | 30 |
| 1976.0 | 31 |
| 1977.0 | 32 |
| 1978.0 | 33 |
| 1979.0 | 34 |
| 1980.0 | 35 |
| 1981.0 | 36 |
| 1982.0 | 37 |
| 1983.0 | 36 |
| 1984.0 | 37 |
| 1985.0 | 36 |
| 1986.0 | 37 |
| 1987.0 | 36 |
| 1988.0 | 37 |
| 1989.0 | 36 |
| 1990.0 | 35 |
| 1991.0 | 34 |
| 1992.0 | 35 |
| 1993.0 | 36 |
| 1994.0 | 35 |
| 1995.0 | 36 |
| 1996.0 | 37 |
| 1997.0 | 38 |
| 1998.0 | 39 |
| 1999.0 | 38 |
| 2000.0 | 39 |
| 2001.0 | 40 |
| 2002.0 | 41 |
| 2003.0 | 42 |
| 2004.0 | 43 |
| 2005.0 | 42 |
| 2006.0 | 41 |
| 2007.0 | 42 |
| 2008.0 | 43 |
| 2009.0 | 44 |
| 2010.0 | 43 |
| 2011.0 | 42 |
| 2012.0 | 43 |
| 2013.0 | 44 |
| 2014.0 | 45 |
| 2015.0 | 46 |
| 2016.0 | 47 |
| 2017.0 | 48 |
| 2018.0 | 47 |
| 2019.0 | 48 |
| 2020.0 | 47 |
| 2021.0 | 46 |
| 2022.0 | 45 |
| 2023.0 | 44 |
| 2024.0 | 45 |
| 2025.0 | 44 |
| 2026.0 | 45 |
| 2027.0 | 46 |
| 2028.0 | 47 |
| 2029.0 | 46 |
| 2030.0 | 45 |
| 2031.0 | 44 |
| 2032.0 | 43 |
| 2033.0 | 42 |
| 2034.0 | 41 |
| 2035.0 | 40 |
| 2036.0 | 39 |
| 2037.0 | 38 |
| 2038.0 | 39 |
| 2039.0 | 38 |
| 2040.0 | 37 |
| 2041.0 | 38 |
| 2042.0 | 37 |
| 2043.0 | 36 |
| 2044.0 | 35 |
| 2045.0 | 34 |
| 2046.0 | 35 |
| 2047.0 | 34 |
| 2048.0 | 33 |
| 2049.0 | 32 |
| 2050.0 | 33 |
| 2051.0 | 34 |
| 2052.0 | 35 |
| 2053.0 | 36 |
| 2054.0 | 37 |
| 2055.0 | 36 |
| 2056.0 | 35 |
| 2057.0 | 34 |
| 2058.0 | 35 |
| 2059.0 | 36 |
| 2060.0 | 37 |
| 2061.0 | 36 |
| 2062.0 | 37 |
| 2063.0 | 38 |
| 2064.0 | 39 |
| 2065.0 | 38 |
| 2066.0 | 39 |
| 2067.0 | 40 |
| 2068.0 | 39 |
| 2069.0 | 40 |
| 2070.0 | 41 |
| 2071.0 | 40 |
| 2072.0 | 41 |
| 2073.0 | 40 |
| 2074.0 | 39 |
| 2075.0 | 38 |
| 2076.0 | 39 |
| 2077.0 | 40 |
| 2078.0 | 39 |
| 2079.0 | 38 |
| 2080.0 | 37 |
| 2081.0 | 36 |
| 2082.0 | 37 |
| 2083.0 | 36 |
| 2084.0 | 35 |
| 2085.0 | 36 |
| 2086.0 | 37 |
| 2087.0 | 36 |
| 2088.0 | 37 |
| 2089.0 | 38 |
| 2090.0 | 39 |
| 2091.0 | 38 |
| 2092.0 | 37 |
| 2093.0 | 36 |
| 2094.0 | 35 |
| 2095.0 | 36 |
| 2096.0 | 35 |
| 2097.0 | 36 |
| 2098.0 | 37 |
| 2099.0 | 36 |
| 2100.0 | 35 |
| 2101.0 | 36 |
| 2102.0 | 37 |
| 2103.0 | 38 |
| 2104.0 | 39 |
| 2105.0 | 38 |
| 2106.0 | 39 |
| 2107.0 | 38 |
| 2108.0 | 39 |
| 2109.0 | 38 |
| 2110.0 | 37 |
| 2111.0 | 38 |
| 2112.0 | 37 |
| 2113.0 | 38 |
| 2114.0 | 39 |
| 2115.0 | 38 |
| 2116.0 | 37 |
| 2117.0 | 38 |
| 2118.0 | 37 |
| 2119.0 | 36 |
| 2120.0 | 35 |
| 2121.0 | 36 |
| 2122.0 | 35 |
| 2123.0 | 36 |
| 2124.0 | 37 |
| 2125.0 | 36 |
| 2126.0 | 35 |
| 2127.0 | 36 |
| 2128.0 | 37 |
| 2129.0 | 38 |
| 2130.0 | 37 |
| 2131.0 | 36 |
| 2132.0 | 37 |
| 2133.0 | 36 |
| 2134.0 | 35 |
| 2135.0 | 36 |
| 2136.0 | 35 |
| 2137.0 | 36 |
| 2138.0 | 37 |
| 2139.0 | 36 |
| 2140.0 | 37 |
| 2141.0 | 36 |
| 2142.0 | 37 |
| 2143.0 | 38 |
| 2144.0 | 37 |
| 2145.0 | 38 |
| 2146.0 | 39 |
| 2147.0 | 38 |
| 2148.0 | 39 |
| 2149.0 | 40 |
| 2150.0 | 39 |
| 2151.0 | 38 |
| 2152.0 | 37 |
| 2153.0 | 38 |
| 2154.0 | 37 |
| 2155.0 | 38 |
| 2156.0 | 39 |
| 2157.0 | 40 |
| 2158.0 | 39 |
| 2159.0 | 40 |
| 2160.0 | 39 |
| 2161.0 | 40 |
| 2162.0 | 41 |
| 2163.0 | 40 |
| 2164.0 | 39 |
| 2165.0 | 40 |
| 2166.0 | 41 |
| 2167.0 | 40 |
| 2168.0 | 41 |
| 2169.0 | 42 |
| 2170.0 | 43 |
| 2171.0 | 44 |
| 2172.0 | 45 |
| 2173.0 | 44 |
| 2174.0 | 43 |
| 2175.0 | 42 |
| 2176.0 | 41 |
| 2177.0 | 40 |
| 2178.0 | 39 |
| 2179.0 | 40 |
| 2180.0 | 41 |
| 2181.0 | 40 |
| 2182.0 | 41 |
| 2183.0 | 40 |
| 2184.0 | 39 |
| 2185.0 | 40 |
| 2186.0 | 39 |
| 2187.0 | 38 |
| 2188.0 | 37 |
| 2189.0 | 36 |
| 2190.0 | 35 |
| 2191.0 | 36 |
| 2192.0 | 37 |
| 2193.0 | 38 |
| 2194.0 | 39 |
| 2195.0 | 38 |
| 2196.0 | 37 |
| 2197.0 | 38 |
| 2198.0 | 37 |
| 2199.0 | 38 |
| 2200.0 | 37 |
| 2201.0 | 36 |
| 2202.0 | 37 |
| 2203.0 | 36 |
| 2204.0 | 37 |
| 2205.0 | 38 |
| 2206.0 | 37 |
| 2207.0 | 38 |
| 2208.0 | 39 |
| 2209.0 | 38 |
| 2210.0 | 39 |
| 2211.0 | 40 |
| 2212.0 | 41 |
| 2213.0 | 42 |
| 2214.0 | 43 |
| 2215.0 | 42 |
| 2216.0 | 41 |
| 2217.0 | 40 |
| 2218.0 | 39 |
| 2219.0 | 38 |
| 2220.0 | 39 |
| 2221.0 | 38 |
| 2222.0 | 39 |
| 2223.0 | 40 |
| 2224.0 | 39 |
| 2225.0 | 40 |
| 2226.0 | 41 |
| 2227.0 | 40 |
| 2228.0 | 39 |
| 2229.0 | 38 |
| 2230.0 | 37 |
| 2231.0 | 38 |
| 2232.0 | 39 |
| 2233.0 | 38 |
| 2234.0 | 37 |
| 2235.0 | 38 |
| 2236.0 | 39 |
| 2237.0 | 40 |
| 2238.0 | 39 |
| 2239.0 | 38 |
| 2240.0 | 39 |
| 2241.0 | 38 |
| 2242.0 | 37 |
| 2243.0 | 36 |
| 2244.0 | 37 |
| 2245.0 | 38 |
| 2246.0 | 39 |
| 2247.0 | 40 |
| 2248.0 | 39 |
| 2249.0 | 38 |
| 2250.0 | 39 |
| 2251.0 | 40 |
| 2252.0 | 41 |
| 2253.0 | 40 |
| 2254.0 | 41 |
| 2255.0 | 42 |
| 2256.0 | 41 |
| 2257.0 | 42 |
| 2258.0 | 41 |
| 2259.0 | 40 |
| 2260.0 | 39 |
| 2261.0 | 40 |
| 2262.0 | 41 |
| 2263.0 | 42 |
| 2264.0 | 41 |
| 2265.0 | 42 |
| 2266.0 | 43 |
| 2267.0 | 42 |
| 2268.0 | 41 |
| 2269.0 | 40 |
| 2270.0 | 39 |
| 2271.0 | 40 |
| 2272.0 | 39 |
| 2273.0 | 40 |
| 2274.0 | 41 |
| 2275.0 | 40 |
| 2276.0 | 39 |
| 2277.0 | 38 |
| 2278.0 | 39 |
| 2279.0 | 38 |
| 2280.0 | 39 |
| 2281.0 | 38 |
| 2282.0 | 39 |
| 2283.0 | 38 |
| 2284.0 | 39 |
| 2285.0 | 38 |
| 2286.0 | 39 |
| 2287.0 | 38 |
| 2288.0 | 37 |
| 2289.0 | 38 |
| 2290.0 | 39 |
| 2291.0 | 38 |
| 2292.0 | 37 |
| 2293.0 | 36 |
| 2294.0 | 37 |
| 2295.0 | 38 |
| 2296.0 | 39 |
| 2297.0 | 38 |
| 2298.0 | 39 |
| 2299.0 | 40 |
| 2300.0 | 41 |
| 2301.0 | 42 |
| 2302.0 | 41 |
| 2303.0 | 42 |
| 2304.0 | 43 |
| 2305.0 | 44 |
| 2306.0 | 45 |
| 2307.0 | 44 |
| 2308.0 | 45 |
| 2309.0 | 44 |
| 2310.0 | 45 |
| 2311.0 | 44 |
| 2312.0 | 43 |
| 2313.0 | 44 |
| 2314.0 | 43 |
| 2315.0 | 44 |
| 2316.0 | 43 |
| 2317.0 | 44 |
| 2318.0 | 45 |
| 2319.0 | 44 |
| 2320.0 | 43 |
| 2321.0 | 44 |
| 2322.0 | 45 |
| 2323.0 | 44 |
| 2324.0 | 43 |
| 2325.0 | 44 |
| 2326.0 | 43 |
| 2327.0 | 42 |
| 2328.0 | 41 |
| 2329.0 | 40 |
| 2330.0 | 39 |
| 2331.0 | 40 |
| 2332.0 | 41 |
| 2333.0 | 40 |
| 2334.0 | 39 |
| 2335.0 | 38 |
| 2336.0 | 37 |
| 2337.0 | 38 |
| 2338.0 | 39 |
| 2339.0 | 38 |
| 2340.0 | 39 |
| 2341.0 | 40 |
| 2342.0 | 39 |
| 2343.0 | 38 |
| 2344.0 | 39 |
| 2345.0 | 38 |
| 2346.0 | 39 |
| 2347.0 | 40 |
| 2348.0 | 41 |
| 2349.0 | 42 |
| 2350.0 | 41 |
| 2351.0 | 42 |
| 2352.0 | 41 |
| 2353.0 | 42 |
| 2354.0 | 43 |
| 2355.0 | 44 |
| 2356.0 | 45 |
| 2357.0 | 46 |
| 2358.0 | 47 |
| 2359.0 | 48 |
| 2360.0 | 47 |
| 2361.0 | 46 |
| 2362.0 | 45 |
| 2363.0 | 44 |
| 2364.0 | 43 |
| 2365.0 | 42 |
| 2366.0 | 41 |
| 2367.0 | 42 |
| 2368.0 | 41 |
| 2369.0 | 42 |
| 2370.0 | 41 |
| 2371.0 | 42 |
| 2372.0 | 43 |
| 2373.0 | 42 |
| 2374.0 | 41 |
| 2375.0 | 40 |
| 2376.0 | 41 |
| 2377.0 | 40 |
| 2378.0 | 39 |
| 2379.0 | 38 |
| 2380.0 | 39 |
| 2381.0 | 40 |
| 2382.0 | 41 |
| 2383.0 | 40 |
| 2384.0 | 41 |
| 2385.0 | 40 |
| 2386.0 | 39 |
| 2387.0 | 40 |
| 2388.0 | 39 |
| 2389.0 | 40 |
| 2390.0 | 41 |
| 2391.0 | 42 |
| 2392.0 | 43 |
| 2393.0 | 42 |
| 2394.0 | 41 |
| 2395.0 | 42 |
| 2396.0 | 43 |
| 2397.0 | 42 |
| 2398.0 | 43 |
| 2399.0 | 44 |
| 2400.0 | 43 |
| 2401.0 | 44 |
| 2402.0 | 43 |
| 2403.0 | 42 |
| 2404.0 | 43 |
| 2405.0 | 42 |
| 2406.0 | 43 |
| 2407.0 | 42 |
| 2408.0 | 41 |
| 2409.0 | 40 |
| 2410.0 | 39 |
| 2411.0 | 38 |
| 2412.0 | 39 |
| 2413.0 | 40 |
| 2414.0 | 39 |
| 2415.0 | 40 |
| 2416.0 | 39 |
| 2417.0 | 40 |
| 2418.0 | 39 |
| 2419.0 | 40 |
| 2420.0 | 41 |
| 2421.0 | 42 |
| 2422.0 | 43 |
| 2423.0 | 44 |
| 2424.0 | 45 |
| 2425.0 | 44 |
| 2426.0 | 45 |
| 2427.0 | 46 |
| 2428.0 | 45 |
| 2429.0 | 44 |
| 2430.0 | 43 |
| 2431.0 | 44 |
| 2432.0 | 43 |
| 2433.0 | 44 |
| 2434.0 | 45 |
| 2435.0 | 46 |
| 2436.0 | 47 |
| 2437.0 | 46 |
| 2438.0 | 47 |
| 2439.0 | 48 |
| 2440.0 | 47 |
| 2441.0 | 46 |
| 2442.0 | 47 |
| 2443.0 | 46 |
| 2444.0 | 45 |
| 2445.0 | 46 |
| 2446.0 | 47 |
| 2447.0 | 48 |
| 2448.0 | 49 |
| 2449.0 | 48 |
| 2450.0 | 47 |
| 2451.0 | 46 |
| 2452.0 | 47 |
| 2453.0 | 48 |
| 2454.0 | 47 |
| 2455.0 | 48 |
| 2456.0 | 47 |
| 2457.0 | 48 |
| 2458.0 | 49 |
| 2459.0 | 48 |
| 2460.0 | 49 |
| 2461.0 | 50 |
| 2462.0 | 51 |
| 2463.0 | 50 |
| 2464.0 | 49 |
| 2465.0 | 50 |
| 2466.0 | 49 |
| 2467.0 | 48 |
| 2468.0 | 47 |
| 2469.0 | 46 |
| 2470.0 | 47 |
| 2471.0 | 46 |
| 2472.0 | 47 |
| 2473.0 | 46 |
| 2474.0 | 47 |
| 2475.0 | 46 |
| 2476.0 | 45 |
| 2477.0 | 46 |
| 2478.0 | 45 |
| 2479.0 | 46 |
| 2480.0 | 45 |
| 2481.0 | 46 |
| 2482.0 | 45 |
| 2483.0 | 46 |
| 2484.0 | 47 |
| 2485.0 | 48 |
| 2486.0 | 49 |
| 2487.0 | 50 |
| 2488.0 | 49 |
| 2489.0 | 50 |
| 2490.0 | 51 |
| 2491.0 | 50 |
| 2492.0 | 49 |
| 2493.0 | 48 |
| 2494.0 | 47 |
| 2495.0 | 46 |
| 2496.0 | 45 |
| 2497.0 | 46 |
| 2498.0 | 47 |
| 2499.0 | 48 |
| 2500.0 | 49 |
| 2501.0 | 50 |
| 2502.0 | 51 |
| 2503.0 | 52 |
| 2504.0 | 51 |
| 2505.0 | 50 |
| 2506.0 | 49 |
| 2507.0 | 50 |
| 2508.0 | 49 |
| 2509.0 | 50 |
| 2510.0 | 49 |
| 2511.0 | 50 |
| 2512.0 | 51 |
| 2513.0 | 52 |
| 2514.0 | 53 |
| 2515.0 | 54 |
| 2516.0 | 55 |
| 2517.0 | 54 |
| 2518.0 | 53 |
| 2519.0 | 54 |
| 2520.0 | 55 |
| 2521.0 | 56 |
| 2522.0 | 55 |
| 2523.0 | 54 |
| 2524.0 | 55 |
| 2525.0 | 54 |
| 2526.0 | 53 |
| 2527.0 | 52 |
| 2528.0 | 51 |
| 2529.0 | 50 |
| 2530.0 | 51 |
| 2531.0 | 50 |
| 2532.0 | 51 |
| 2533.0 | 52 |
| 2534.0 | 51 |
| 2535.0 | 52 |
| 2536.0 | 51 |
| 2537.0 | 50 |
| 2538.0 | 51 |
| 2539.0 | 50 |
| 2540.0 | 49 |
| 2541.0 | 50 |
| 2542.0 | 51 |
| 2543.0 | 50 |
| 2544.0 | 51 |
| 2545.0 | 52 |
| 2546.0 | 51 |
| 2547.0 | 52 |
| 2548.0 | 51 |
| 2549.0 | 52 |
| 2550.0 | 53 |
| 2551.0 | 52 |
| 2552.0 | 51 |
| 2553.0 | 50 |
| 2554.0 | 51 |
| 2555.0 | 50 |
| 2556.0 | 49 |
| 2557.0 | 50 |
| 2558.0 | 51 |
| 2559.0 | 50 |
| 2560.0 | 51 |
| 2561.0 | 50 |
| 2562.0 | 49 |
| 2563.0 | 50 |
| 2564.0 | 49 |
| 2565.0 | 50 |
| 2566.0 | 51 |
| 2567.0 | 50 |
| 2568.0 | 51 |
| 2569.0 | 50 |
| 2570.0 | 51 |
| 2571.0 | 52 |
| 2572.0 | 51 |
| 2573.0 | 52 |
| 2574.0 | 51 |
| 2575.0 | 52 |
| 2576.0 | 53 |
| 2577.0 | 54 |
| 2578.0 | 53 |
| 2579.0 | 54 |
| 2580.0 | 55 |
| 2581.0 | 54 |
| 2582.0 | 55 |
| 2583.0 | 56 |
| 2584.0 | 57 |
| 2585.0 | 56 |
| 2586.0 | 57 |
| 2587.0 | 56 |
| 2588.0 | 55 |
| 2589.0 | 56 |
| 2590.0 | 55 |
| 2591.0 | 56 |
| 2592.0 | 57 |
| 2593.0 | 56 |
| 2594.0 | 55 |
| 2595.0 | 56 |
| 2596.0 | 57 |
| 2597.0 | 56 |
| 2598.0 | 55 |
| 2599.0 | 54 |
| 2600.0 | 53 |
| 2601.0 | 52 |
| 2602.0 | 51 |
| 2603.0 | 52 |
| 2604.0 | 53 |
| 2605.0 | 52 |
| 2606.0 | 53 |
| 2607.0 | 54 |
| 2608.0 | 55 |
| 2609.0 | 54 |
| 2610.0 | 55 |
| 2611.0 | 54 |
| 2612.0 | 55 |
| 2613.0 | 54 |
| 2614.0 | 55 |
| 2615.0 | 56 |
| 2616.0 | 55 |
| 2617.0 | 54 |
| 2618.0 | 55 |
| 2619.0 | 56 |
| 2620.0 | 57 |
| 2621.0 | 56 |
| 2622.0 | 57 |
| 2623.0 | 56 |
| 2624.0 | 55 |
| 2625.0 | 56 |
| 2626.0 | 57 |
| 2627.0 | 56 |
| 2628.0 | 57 |
| 2629.0 | 58 |
| 2630.0 | 59 |
| 2631.0 | 58 |
| 2632.0 | 57 |
| 2633.0 | 58 |
| 2634.0 | 59 |
| 2635.0 | 60 |
| 2636.0 | 59 |
| 2637.0 | 58 |
| 2638.0 | 57 |
| 2639.0 | 56 |
| 2640.0 | 55 |
| 2641.0 | 54 |
| 2642.0 | 55 |
| 2643.0 | 56 |
| 2644.0 | 55 |
| 2645.0 | 54 |
| 2646.0 | 55 |
| 2647.0 | 54 |
| 2648.0 | 53 |
| 2649.0 | 52 |
| 2650.0 | 51 |
| 2651.0 | 50 |
| 2652.0 | 49 |
| 2653.0 | 50 |
| 2654.0 | 49 |
| 2655.0 | 48 |
| 2656.0 | 47 |
| 2657.0 | 46 |
| 2658.0 | 47 |
| 2659.0 | 46 |
| 2660.0 | 47 |
| 2661.0 | 46 |
| 2662.0 | 45 |
| 2663.0 | 44 |
| 2664.0 | 45 |
| 2665.0 | 44 |
| 2666.0 | 43 |
| 2667.0 | 42 |
| 2668.0 | 43 |
| 2669.0 | 44 |
| 2670.0 | 43 |
| 2671.0 | 44 |
| 2672.0 | 43 |
| 2673.0 | 42 |
| 2674.0 | 43 |
| 2675.0 | 42 |
| 2676.0 | 41 |
| 2677.0 | 40 |
| 2678.0 | 39 |
| 2679.0 | 40 |
| 2680.0 | 41 |
| 2681.0 | 40 |
| 2682.0 | 41 |
| 2683.0 | 42 |
| 2684.0 | 43 |
| 2685.0 | 42 |
| 2686.0 | 43 |
| 2687.0 | 42 |
| 2688.0 | 41 |
| 2689.0 | 42 |
| 2690.0 | 43 |
| 2691.0 | 42 |
| 2692.0 | 43 |
| 2693.0 | 42 |
| 2694.0 | 41 |
| 2695.0 | 42 |
| 2696.0 | 43 |
| 2697.0 | 42 |
| 2698.0 | 43 |
| 2699.0 | 42 |
| 2700.0 | 43 |
| 2701.0 | 42 |
| 2702.0 | 43 |
| 2703.0 | 44 |
| 2704.0 | 43 |
| 2705.0 | 42 |
| 2706.0 | 41 |
| 2707.0 | 42 |
| 2708.0 | 41 |
| 2709.0 | 40 |
| 2710.0 | 41 |
| 2711.0 | 42 |
| 2712.0 | 41 |
| 2713.0 | 40 |
| 2714.0 | 41 |
| 2715.0 | 40 |
| 2716.0 | 39 |
| 2717.0 | 40 |
| 2718.0 | 39 |
| 2719.0 | 40 |
| 2720.0 | 39 |
| 2721.0 | 40 |
| 2722.0 | 39 |
| 2723.0 | 40 |
| 2724.0 | 41 |
| 2725.0 | 42 |
| 2726.0 | 41 |
| 2727.0 | 40 |
| 2728.0 | 41 |
| 2729.0 | 40 |
| 2730.0 | 41 |
| 2731.0 | 40 |
| 2732.0 | 41 |
| 2733.0 | 40 |
| 2734.0 | 41 |
| 2735.0 | 40 |
| 2736.0 | 41 |
| 2737.0 | 40 |
| 2738.0 | 41 |
| 2739.0 | 42 |
| 2740.0 | 41 |
| 2741.0 | 42 |
| 2742.0 | 43 |
| 2743.0 | 44 |
| 2744.0 | 45 |
| 2745.0 | 46 |
| 2746.0 | 45 |
| 2747.0 | 46 |
| 2748.0 | 45 |
| 2749.0 | 46 |
| 2750.0 | 47 |
| 2751.0 | 46 |
| 2752.0 | 47 |
| 2753.0 | 48 |
| 2754.0 | 49 |
| 2755.0 | 48 |
| 2756.0 | 47 |
| 2757.0 | 48 |
| 2758.0 | 49 |
| 2759.0 | 48 |
| 2760.0 | 47 |
| 2761.0 | 48 |
| 2762.0 | 47 |
| 2763.0 | 46 |
| 2764.0 | 47 |
| 2765.0 | 48 |
| 2766.0 | 47 |
| 2767.0 | 46 |
| 2768.0 | 47 |
| 2769.0 | 46 |
| 2770.0 | 47 |
| 2771.0 | 48 |
| 2772.0 | 47 |
| 2773.0 | 48 |
| 2774.0 | 47 |
| 2775.0 | 48 |
| 2776.0 | 49 |
| 2777.0 | 50 |
| 2778.0 | 51 |
| 2779.0 | 52 |
| 2780.0 | 51 |
| 2781.0 | 50 |
| 2782.0 | 49 |
| 2783.0 | 48 |
| 2784.0 | 47 |
| 2785.0 | 46 |
| 2786.0 | 45 |
| 2787.0 | 46 |
| 2788.0 | 45 |
| 2789.0 | 44 |
| 2790.0 | 45 |
| 2791.0 | 44 |
| 2792.0 | 43 |
| 2793.0 | 44 |
| 2794.0 | 43 |
| 2795.0 | 42 |
| 2796.0 | 41 |
| 2797.0 | 42 |
| 2798.0 | 43 |
| 2799.0 | 42 |
| 2800.0 | 43 |
| 2801.0 | 44 |
| 2802.0 | 45 |
| 2803.0 | 46 |
| 2804.0 | 47 |
| 2805.0 | 46 |
| 2806.0 | 45 |
| 2807.0 | 46 |
| 2808.0 | 45 |
| 2809.0 | 44 |
| 2810.0 | 45 |
| 2811.0 | 44 |
| 2812.0 | 45 |
| 2813.0 | 44 |
| 2814.0 | 45 |
| 2815.0 | 44 |
| 2816.0 | 43 |
| 2817.0 | 44 |
| 2818.0 | 43 |
| 2819.0 | 44 |
| 2820.0 | 43 |
| 2821.0 | 42 |
| 2822.0 | 43 |
| 2823.0 | 42 |
| 2824.0 | 41 |
| 2825.0 | 40 |
| 2826.0 | 41 |
| 2827.0 | 40 |
| 2828.0 | 39 |
| 2829.0 | 38 |
| 2830.0 | 39 |
| 2831.0 | 38 |
| 2832.0 | 39 |
| 2833.0 | 38 |
| 2834.0 | 37 |
| 2835.0 | 38 |
| 2836.0 | 37 |
| 2837.0 | 38 |
| 2838.0 | 39 |
| 2839.0 | 38 |
| 2840.0 | 37 |
| 2841.0 | 38 |
| 2842.0 | 37 |
| 2843.0 | 36 |
| 2844.0 | 37 |
| 2845.0 | 38 |
| 2846.0 | 37 |
| 2847.0 | 36 |
| 2848.0 | 37 |
| 2849.0 | 36 |
| 2850.0 | 37 |
| 2851.0 | 36 |
| 2852.0 | 37 |
| 2853.0 | 38 |
| 2854.0 | 37 |
| 2855.0 | 36 |
| 2856.0 | 37 |
| 2857.0 | 36 |
| 2858.0 | 35 |
| 2859.0 | 34 |
| 2860.0 | 33 |
| 2861.0 | 34 |
| 2862.0 | 35 |
| 2863.0 | 36 |
| 2864.0 | 35 |
| 2865.0 | 34 |
| 2866.0 | 35 |
| 2867.0 | 36 |
| 2868.0 | 35 |
| 2869.0 | 36 |
| 2870.0 | 37 |
| 2871.0 | 36 |
| 2872.0 | 35 |
| 2873.0 | 36 |
| 2874.0 | 35 |
| 2875.0 | 34 |
| 2876.0 | 35 |
| 2877.0 | 34 |
| 2878.0 | 35 |
| 2879.0 | 34 |
| 2880.0 | 33 |
| 2881.0 | 32 |
| 2882.0 | 33 |
| 2883.0 | 34 |
| 2884.0 | 33 |
| 2885.0 | 32 |
| 2886.0 | 31 |
| 2887.0 | 32 |
| 2888.0 | 31 |
| 2889.0 | 30 |
| 2890.0 | 29 |
| 2891.0 | 28 |
| 2892.0 | 29 |
| 2893.0 | 28 |
| 2894.0 | 29 |
| 2895.0 | 28 |
| 2896.0 | 27 |
| 2897.0 | 28 |
| 2898.0 | 29 |
| 2899.0 | 30 |
| 2900.0 | 29 |
| 2901.0 | 30 |
| 2902.0 | 29 |
| 2903.0 | 30 |
| 2904.0 | 31 |
| 2905.0 | 30 |
| 2906.0 | 31 |
| 2907.0 | 30 |
| 2908.0 | 31 |
| 2909.0 | 30 |
| 2910.0 | 31 |
| 2911.0 | 32 |
| 2912.0 | 31 |
| 2913.0 | 32 |
| 2914.0 | 31 |
| 2915.0 | 30 |
| 2916.0 | 31 |
| 2917.0 | 32 |
| 2918.0 | 33 |
| 2919.0 | 32 |
| 2920.0 | 31 |
| 2921.0 | 32 |
| 2922.0 | 33 |
| 2923.0 | 32 |
| 2924.0 | 31 |
| 2925.0 | 32 |
| 2926.0 | 31 |
| 2927.0 | 32 |
| 2928.0 | 31 |
| 2929.0 | 32 |
| 2930.0 | 31 |
| 2931.0 | 30 |
| 2932.0 | 29 |
| 2933.0 | 28 |
| 2934.0 | 29 |
| 2935.0 | 30 |
| 2936.0 | 29 |
| 2937.0 | 28 |
| 2938.0 | 27 |
| 2939.0 | 26 |
| 2940.0 | 27 |
| 2941.0 | 26 |
| 2942.0 | 27 |
| 2943.0 | 28 |
| 2944.0 | 29 |
| 2945.0 | 30 |
| 2946.0 | 29 |
| 2947.0 | 28 |
| 2948.0 | 29 |
| 2949.0 | 28 |
| 2950.0 | 29 |
| 2951.0 | 28 |
| 2952.0 | 27 |
| 2953.0 | 26 |
| 2954.0 | 27 |
| 2955.0 | 26 |
| 2956.0 | 25 |
| 2957.0 | 24 |
| 2958.0 | 23 |
| 2959.0 | 24 |
| 2960.0 | 23 |
| 2961.0 | 22 |
| 2962.0 | 21 |
| 2963.0 | 20 |
| 2964.0 | 21 |
| 2965.0 | 20 |
| 2966.0 | 19 |
| 2967.0 | 18 |
| 2968.0 | 17 |
| 2969.0 | 16 |
| 2970.0 | 17 |
| 2971.0 | 18 |
| 2972.0 | 19 |
| 2973.0 | 20 |
| 2974.0 | 21 |
| 2975.0 | 22 |
| 2976.0 | 21 |
| 2977.0 | 22 |
| 2978.0 | 21 |
| 2979.0 | 22 |
| 2980.0 | 21 |
| 2981.0 | 22 |
| 2982.0 | 23 |
| 2983.0 | 22 |
| 2984.0 | 21 |
| 2985.0 | 22 |
| 2986.0 | 23 |
| 2987.0 | 24 |
| 2988.0 | 23 |
| 2989.0 | 24 |
| 2990.0 | 25 |
| 2991.0 | 24 |
| 2992.0 | 25 |
| 2993.0 | 24 |
| 2994.0 | 25 |
| 2995.0 | 24 |
| 2996.0 | 23 |
| 2997.0 | 24 |
| 2998.0 | 23 |
| 2999.0 | 22 |
| 3000.0 | 23 |
| 3001.0 | 22 |
| 3002.0 | 21 |
| 3003.0 | 20 |
| 3004.0 | 21 |
| 3005.0 | 22 |
| 3006.0 | 21 |
| 3007.0 | 22 |
| 3008.0 | 23 |
| 3009.0 | 22 |
| 3010.0 | 23 |
| 3011.0 | 24 |
| 3012.0 | 25 |
| 3013.0 | 26 |
| 3014.0 | 27 |
| 3015.0 | 26 |
| 3016.0 | 27 |
| 3017.0 | 28 |
| 3018.0 | 27 |
| 3019.0 | 28 |
| 3020.0 | 29 |
| 3021.0 | 30 |
| 3022.0 | 29 |
| 3023.0 | 28 |
| 3024.0 | 29 |
| 3025.0 | 30 |
| 3026.0 | 31 |
| 3027.0 | 30 |
| 3028.0 | 31 |
| 3029.0 | 30 |
| 3030.0 | 29 |
| 3031.0 | 30 |
| 3032.0 | 29 |
| 3033.0 | 28 |
| 3034.0 | 27 |
| 3035.0 | 26 |
| 3036.0 | 27 |
| 3037.0 | 26 |
| 3038.0 | 25 |
| 3039.0 | 26 |
| 3040.0 | 27 |
| 3041.0 | 26 |
| 3042.0 | 27 |
| 3043.0 | 26 |
| 3044.0 | 27 |
| 3045.0 | 28 |
| 3046.0 | 27 |
| 3047.0 | 26 |
| 3048.0 | 27 |
| 3049.0 | 26 |
| 3050.0 | 27 |
| 3051.0 | 26 |
| 3052.0 | 25 |
| 3053.0 | 26 |
| 3054.0 | 27 |
| 3055.0 | 28 |
| 3056.0 | 29 |
| 3057.0 | 28 |
| 3058.0 | 27 |
| 3059.0 | 28 |
| 3060.0 | 29 |
| 3061.0 | 30 |
| 3062.0 | 29 |
| 3063.0 | 30 |
| 3064.0 | 29 |
| 3065.0 | 30 |
| 3066.0 | 31 |
| 3067.0 | 32 |
| 3068.0 | 31 |
| 3069.0 | 32 |
| 3070.0 | 31 |
| 3071.0 | 30 |
| 3072.0 | 29 |
| 3073.0 | 30 |
| 3074.0 | 31 |
| 3075.0 | 30 |
| 3076.0 | 31 |
| 3077.0 | 32 |
| 3078.0 | 31 |
| 3079.0 | 32 |
| 3080.0 | 33 |
| 3081.0 | 32 |
| 3082.0 | 31 |
| 3083.0 | 30 |
| 3084.0 | 29 |
| 3085.0 | 28 |
| 3086.0 | 29 |
| 3087.0 | 28 |
| 3088.0 | 27 |
| 3089.0 | 26 |
| 3090.0 | 25 |
| 3091.0 | 24 |
| 3092.0 | 23 |
| 3093.0 | 24 |
| 3094.0 | 25 |
| 3095.0 | 24 |
| 3096.0 | 23 |
| 3097.0 | 24 |
| 3098.0 | 23 |
| 3099.0 | 22 |
| 3100.0 | 21 |
| 3101.0 | 22 |
| 3102.0 | 23 |
| 3103.0 | 24 |
| 3104.0 | 23 |
| 3105.0 | 22 |
| 3106.0 | 21 |
| 3107.0 | 20 |
| 3108.0 | 21 |
| 3109.0 | 22 |
| 3110.0 | 23 |
| 3111.0 | 24 |
| 3112.0 | 25 |
| 3113.0 | 24 |
| 3114.0 | 25 |
| 3115.0 | 26 |
| 3116.0 | 25 |
| 3117.0 | 24 |
| 3118.0 | 25 |
| 3119.0 | 26 |
| 3120.0 | 25 |
| 3121.0 | 26 |
| 3122.0 | 25 |
| 3123.0 | 26 |
| 3124.0 | 27 |
| 3125.0 | 26 |
| 3126.0 | 25 |
| 3127.0 | 24 |
| 3128.0 | 23 |
| 3129.0 | 22 |
| 3130.0 | 23 |
| 3131.0 | 22 |
| 3132.0 | 21 |
| 3133.0 | 22 |
| 3134.0 | 21 |
| 3135.0 | 20 |
| 3136.0 | 21 |
| 3137.0 | 22 |
| 3138.0 | 21 |
| 3139.0 | 22 |
| 3140.0 | 21 |
| 3141.0 | 20 |
| 3142.0 | 19 |
| 3143.0 | 20 |
| 3144.0 | 21 |
| 3145.0 | 22 |
| 3146.0 | 23 |
| 3147.0 | 22 |
| 3148.0 | 21 |
| 3149.0 | 20 |
| 3150.0 | 21 |
| 3151.0 | 22 |
| 3152.0 | 21 |
| 3153.0 | 20 |
| 3154.0 | 21 |
| 3155.0 | 22 |
| 3156.0 | 23 |
| 3157.0 | 24 |
| 3158.0 | 23 |
| 3159.0 | 22 |
| 3160.0 | 23 |
| 3161.0 | 22 |
| 3162.0 | 21 |
| 3163.0 | 22 |
| 3164.0 | 23 |
| 3165.0 | 24 |
| 3166.0 | 25 |
| 3167.0 | 26 |
| 3168.0 | 27 |
| 3169.0 | 28 |
| 3170.0 | 29 |
| 3171.0 | 30 |
| 3172.0 | 31 |
| 3173.0 | 30 |
| 3174.0 | 31 |
| 3175.0 | 30 |
| 3176.0 | 29 |
| 3177.0 | 30 |
| 3178.0 | 29 |
| 3179.0 | 30 |
| 3180.0 | 29 |
| 3181.0 | 28 |
| 3182.0 | 29 |
| 3183.0 | 28 |
| 3184.0 | 29 |
| 3185.0 | 30 |
| 3186.0 | 31 |
| 3187.0 | 32 |
| 3188.0 | 33 |
| 3189.0 | 34 |
| 3190.0 | 35 |
| 3191.0 | 34 |
| 3192.0 | 33 |
| 3193.0 | 32 |
| 3194.0 | 31 |
| 3195.0 | 30 |
| 3196.0 | 29 |
| 3197.0 | 30 |
| 3198.0 | 29 |
| 3199.0 | 28 |
| 3200.0 | 29 |
| 3201.0 | 30 |
| 3202.0 | 29 |
| 3203.0 | 30 |
| 3204.0 | 29 |
| 3205.0 | 28 |
| 3206.0 | 29 |
| 3207.0 | 28 |
| 3208.0 | 27 |
| 3209.0 | 26 |
| 3210.0 | 25 |
| 3211.0 | 24 |
| 3212.0 | 23 |
| 3213.0 | 22 |
| 3214.0 | 23 |
| 3215.0 | 24 |
| 3216.0 | 23 |
| 3217.0 | 24 |
| 3218.0 | 23 |
| 3219.0 | 24 |
| 3220.0 | 23 |
| 3221.0 | 24 |
| 3222.0 | 23 |
| 3223.0 | 22 |
| 3224.0 | 21 |
| 3225.0 | 20 |
| 3226.0 | 19 |
| 3227.0 | 20 |
| 3228.0 | 19 |
| 3229.0 | 18 |
| 3230.0 | 19 |
| 3231.0 | 20 |
| 3232.0 | 21 |
| 3233.0 | 20 |
| 3234.0 | 21 |
| 3235.0 | 20 |
| 3236.0 | 19 |
| 3237.0 | 20 |
| 3238.0 | 21 |
| 3239.0 | 20 |
| 3240.0 | 19 |
| 3241.0 | 18 |
| 3242.0 | 19 |
| 3243.0 | 20 |
| 3244.0 | 19 |
| 3245.0 | 18 |
| 3246.0 | 19 |
| 3247.0 | 20 |
| 3248.0 | 21 |
| 3249.0 | 20 |
| 3250.0 | 19 |
| 3251.0 | 20 |
| 3252.0 | 19 |
| 3253.0 | 20 |
| 3254.0 | 21 |
| 3255.0 | 22 |
| 3256.0 | 21 |
| 3257.0 | 22 |
| 3258.0 | 21 |
| 3259.0 | 20 |
| 3260.0 | 21 |
| 3261.0 | 22 |
| 3262.0 | 21 |
| 3263.0 | 22 |
| 3264.0 | 23 |
| 3265.0 | 24 |
| 3266.0 | 25 |
| 3267.0 | 26 |
| 3268.0 | 25 |
| 3269.0 | 24 |
| 3270.0 | 25 |
| 3271.0 | 24 |
| 3272.0 | 25 |
| 3273.0 | 26 |
| 3274.0 | 25 |
| 3275.0 | 26 |
| 3276.0 | 25 |
| 3277.0 | 24 |
| 3278.0 | 25 |
| 3279.0 | 24 |
| 3280.0 | 23 |
| 3281.0 | 24 |
| 3282.0 | 23 |
| 3283.0 | 22 |
| 3284.0 | 21 |
| 3285.0 | 22 |
| 3286.0 | 23 |
| 3287.0 | 24 |
| 3288.0 | 25 |
| 3289.0 | 26 |
| 3290.0 | 25 |
| 3291.0 | 26 |
| 3292.0 | 27 |
| 3293.0 | 28 |
| 3294.0 | 27 |
| 3295.0 | 26 |
| 3296.0 | 27 |
| 3297.0 | 28 |
| 3298.0 | 29 |
| 3299.0 | 30 |
| 3300.0 | 29 |
| 3301.0 | 28 |
| 3302.0 | 29 |
| 3303.0 | 28 |
| 3304.0 | 27 |
| 3305.0 | 28 |
| 3306.0 | 29 |
| 3307.0 | 28 |
| 3308.0 | 27 |
| 3309.0 | 26 |
| 3310.0 | 25 |
| 3311.0 | 26 |
| 3312.0 | 25 |
| 3313.0 | 26 |
| 3314.0 | 27 |
| 3315.0 | 26 |
| 3316.0 | 27 |
| 3317.0 | 26 |
| 3318.0 | 27 |
| 3319.0 | 26 |
| 3320.0 | 25 |
| 3321.0 | 24 |
| 3322.0 | 23 |
| 3323.0 | 24 |
| 3324.0 | 25 |
| 3325.0 | 24 |
| 3326.0 | 23 |
| 3327.0 | 22 |
| 3328.0 | 23 |
| 3329.0 | 24 |
| 3330.0 | 23 |
| 3331.0 | 24 |
| 3332.0 | 25 |
| 3333.0 | 24 |
| 3334.0 | 23 |
| 3335.0 | 24 |
| 3336.0 | 25 |
| 3337.0 | 24 |
| 3338.0 | 25 |
| 3339.0 | 26 |
| 3340.0 | 25 |
| 3341.0 | 24 |
| 3342.0 | 25 |
| 3343.0 | 26 |
| 3344.0 | 27 |
| 3345.0 | 28 |
| 3346.0 | 29 |
| 3347.0 | 30 |
| 3348.0 | 29 |
| 3349.0 | 28 |
| 3350.0 | 29 |
| 3351.0 | 28 |
| 3352.0 | 29 |
| 3353.0 | 28 |
| 3354.0 | 27 |
| 3355.0 | 26 |
| 3356.0 | 25 |
| 3357.0 | 24 |
| 3358.0 | 25 |
| 3359.0 | 24 |
| 3360.0 | 23 |
| 3361.0 | 24 |
| 3362.0 | 25 |
| 3363.0 | 26 |
| 3364.0 | 27 |
| 3365.0 | 28 |
| 3366.0 | 29 |
| 3367.0 | 28 |
| 3368.0 | 29 |
| 3369.0 | 28 |
| 3370.0 | 27 |
| 3371.0 | 26 |
| 3372.0 | 27 |
| 3373.0 | 28 |
| 3374.0 | 29 |
| 3375.0 | 28 |
| 3376.0 | 27 |
| 3377.0 | 28 |
| 3378.0 | 29 |
| 3379.0 | 30 |
| 3380.0 | 29 |
| 3381.0 | 28 |
| 3382.0 | 27 |
| 3383.0 | 28 |
| 3384.0 | 29 |
| 3385.0 | 30 |
| 3386.0 | 29 |
| 3387.0 | 28 |
| 3388.0 | 29 |
| 3389.0 | 30 |
| 3390.0 | 31 |
| 3391.0 | 30 |
| 3392.0 | 29 |
| 3393.0 | 30 |
| 3394.0 | 29 |
| 3395.0 | 30 |
| 3396.0 | 29 |
| 3397.0 | 28 |
| 3398.0 | 27 |
| 3399.0 | 26 |
| 3400.0 | 27 |
| 3401.0 | 28 |
| 3402.0 | 29 |
| 3403.0 | 30 |
| 3404.0 | 31 |
| 3405.0 | 30 |
| 3406.0 | 31 |
| 3407.0 | 32 |
| 3408.0 | 31 |
| 3409.0 | 32 |
| 3410.0 | 31 |
| 3411.0 | 30 |
| 3412.0 | 31 |
| 3413.0 | 30 |
| 3414.0 | 31 |
| 3415.0 | 30 |
| 3416.0 | 31 |
| 3417.0 | 32 |
| 3418.0 | 33 |
| 3419.0 | 34 |
| 3420.0 | 33 |
| 3421.0 | 32 |
| 3422.0 | 31 |
| 3423.0 | 30 |
| 3424.0 | 31 |
| 3425.0 | 30 |
| 3426.0 | 29 |
| 3427.0 | 30 |
| 3428.0 | 31 |
| 3429.0 | 30 |
| 3430.0 | 29 |
| 3431.0 | 30 |
| 3432.0 | 31 |
| 3433.0 | 30 |
| 3434.0 | 31 |
| 3435.0 | 30 |
| 3436.0 | 31 |
| 3437.0 | 32 |
| 3438.0 | 33 |
| 3439.0 | 34 |
| 3440.0 | 33 |
| 3441.0 | 32 |
| 3442.0 | 33 |
| 3443.0 | 34 |
| 3444.0 | 33 |
| 3445.0 | 32 |
| 3446.0 | 33 |
| 3447.0 | 32 |
| 3448.0 | 33 |
| 3449.0 | 34 |
| 3450.0 | 33 |
| 3451.0 | 32 |
| 3452.0 | 33 |
| 3453.0 | 32 |
| 3454.0 | 33 |
| 3455.0 | 34 |
| 3456.0 | 35 |
| 3457.0 | 34 |
| 3458.0 | 33 |
| 3459.0 | 34 |
| 3460.0 | 33 |
| 3461.0 | 32 |
| 3462.0 | 31 |
| 3463.0 | 32 |
| 3464.0 | 33 |
| 3465.0 | 32 |
| 3466.0 | 33 |
| 3467.0 | 32 |
| 3468.0 | 33 |
| 3469.0 | 32 |
| 3470.0 | 33 |
| 3471.0 | 34 |
| 3472.0 | 35 |
| 3473.0 | 36 |
| 3474.0 | 35 |
| 3475.0 | 34 |
| 3476.0 | 33 |
| 3477.0 | 32 |
| 3478.0 | 33 |
| 3479.0 | 32 |
| 3480.0 | 31 |
| 3481.0 | 30 |
| 3482.0 | 31 |
| 3483.0 | 32 |
| 3484.0 | 33 |
| 3485.0 | 34 |
| 3486.0 | 35 |
| 3487.0 | 34 |
| 3488.0 | 35 |
| 3489.0 | 34 |
| 3490.0 | 35 |
| 3491.0 | 36 |
| 3492.0 | 37 |
| 3493.0 | 38 |
| 3494.0 | 37 |
| 3495.0 | 38 |
| 3496.0 | 37 |
| 3497.0 | 36 |
| 3498.0 | 35 |
| 3499.0 | 36 |
| 3500.0 | 37 |
| 3501.0 | 38 |
| 3502.0 | 39 |
| 3503.0 | 40 |
| 3504.0 | 41 |
| 3505.0 | 42 |
| 3506.0 | 41 |
| 3507.0 | 40 |
| 3508.0 | 41 |
| 3509.0 | 40 |
| 3510.0 | 41 |
| 3511.0 | 40 |
| 3512.0 | 41 |
| 3513.0 | 42 |
| 3514.0 | 41 |
| 3515.0 | 40 |
| 3516.0 | 39 |
| 3517.0 | 38 |
| 3518.0 | 37 |
| 3519.0 | 36 |
| 3520.0 | 37 |
| 3521.0 | 36 |
| 3522.0 | 37 |
| 3523.0 | 38 |
| 3524.0 | 37 |
| 3525.0 | 38 |
| 3526.0 | 37 |
| 3527.0 | 38 |
| 3528.0 | 39 |
| 3529.0 | 38 |
| 3530.0 | 39 |
| 3531.0 | 40 |
| 3532.0 | 41 |
| 3533.0 | 40 |
| 3534.0 | 41 |
| 3535.0 | 42 |
| 3536.0 | 43 |
| 3537.0 | 42 |
| 3538.0 | 41 |
| 3539.0 | 42 |
| 3540.0 | 43 |
| 3541.0 | 42 |
| 3542.0 | 41 |
| 3543.0 | 42 |
| 3544.0 | 43 |
| 3545.0 | 42 |
| 3546.0 | 43 |
| 3547.0 | 42 |
| 3548.0 | 41 |
| 3549.0 | 42 |
| 3550.0 | 41 |
| 3551.0 | 40 |
| 3552.0 | 39 |
| 3553.0 | 40 |
| 3554.0 | 41 |
| 3555.0 | 40 |
| 3556.0 | 41 |
| 3557.0 | 42 |
| 3558.0 | 43 |
| 3559.0 | 44 |
| 3560.0 | 45 |
| 3561.0 | 44 |
| 3562.0 | 45 |
| 3563.0 | 44 |
| 3564.0 | 45 |
| 3565.0 | 44 |
| 3566.0 | 45 |
| 3567.0 | 46 |
| 3568.0 | 47 |
| 3569.0 | 48 |
| 3570.0 | 49 |
| 3571.0 | 50 |
| 3572.0 | 51 |
| 3573.0 | 50 |
| 3574.0 | 51 |
| 3575.0 | 52 |
| 3576.0 | 53 |
| 3577.0 | 54 |
| 3578.0 | 55 |
| 3579.0 | 56 |
| 3580.0 | 55 |
| 3581.0 | 54 |
| 3582.0 | 55 |
| 3583.0 | 54 |
| 3584.0 | 55 |
| 3585.0 | 56 |
| 3586.0 | 57 |
| 3587.0 | 56 |
| 3588.0 | 57 |
| 3589.0 | 56 |
| 3590.0 | 57 |
| 3591.0 | 58 |
| 3592.0 | 57 |
| 3593.0 | 58 |
| 3594.0 | 57 |
| 3595.0 | 58 |
| 3596.0 | 59 |
| 3597.0 | 58 |
| 3598.0 | 57 |
| 3599.0 | 58 |
| 3600.0 | 57 |
| 3601.0 | 58 |
| 3602.0 | 57 |
| 3603.0 | 56 |
| 3604.0 | 55 |
| 3605.0 | 56 |
| 3606.0 | 55 |
| 3607.0 | 54 |
| 3608.0 | 55 |
| 3609.0 | 56 |
| 3610.0 | 57 |
| 3611.0 | 56 |
| 3612.0 | 57 |
| 3613.0 | 56 |
| 3614.0 | 57 |
| 3615.0 | 58 |
| 3616.0 | 57 |
| 3617.0 | 58 |
| 3618.0 | 57 |
| 3619.0 | 56 |
| 3620.0 | 55 |
| 3621.0 | 54 |
| 3622.0 | 53 |
| 3623.0 | 54 |
| 3624.0 | 53 |
| 3625.0 | 52 |
| 3626.0 | 51 |
| 3627.0 | 52 |
| 3628.0 | 51 |
| 3629.0 | 52 |
| 3630.0 | 51 |
| 3631.0 | 50 |
| 3632.0 | 49 |
| 3633.0 | 50 |
| 3634.0 | 49 |
| 3635.0 | 50 |
| 3636.0 | 51 |
| 3637.0 | 50 |
| 3638.0 | 51 |
| 3639.0 | 50 |
| 3640.0 | 49 |
| 3641.0 | 48 |
| 3642.0 | 49 |
| 3643.0 | 50 |
| 3644.0 | 51 |
| 3645.0 | 50 |
| 3646.0 | 51 |
| 3647.0 | 52 |
| 3648.0 | 51 |
| 3649.0 | 52 |
| 3650.0 | 51 |
| 3651.0 | 50 |
| 3652.0 | 49 |
| 3653.0 | 50 |
| 3654.0 | 51 |
| 3655.0 | 52 |
| 3656.0 | 53 |
| 3657.0 | 54 |
| 3658.0 | 53 |
| 3659.0 | 52 |
| 3660.0 | 53 |
| 3661.0 | 52 |
| 3662.0 | 51 |
| 3663.0 | 52 |
| 3664.0 | 51 |
| 3665.0 | 50 |
| 3666.0 | 49 |
| 3667.0 | 50 |
| 3668.0 | 51 |
| 3669.0 | 50 |
| 3670.0 | 51 |
| 3671.0 | 50 |
| 3672.0 | 51 |
| 3673.0 | 50 |
| 3674.0 | 51 |
| 3675.0 | 50 |
| 3676.0 | 49 |
| 3677.0 | 48 |
| 3678.0 | 49 |
| 3679.0 | 48 |
| 3680.0 | 47 |
| 3681.0 | 46 |
| 3682.0 | 45 |
| 3683.0 | 44 |
| 3684.0 | 43 |
| 3685.0 | 42 |
| 3686.0 | 43 |
| 3687.0 | 44 |
| 3688.0 | 43 |
| 3689.0 | 44 |
| 3690.0 | 45 |
| 3691.0 | 46 |
| 3692.0 | 47 |
| 3693.0 | 46 |
| 3694.0 | 45 |
| 3695.0 | 46 |
| 3696.0 | 45 |
| 3697.0 | 44 |
| 3698.0 | 43 |
| 3699.0 | 44 |
| 3700.0 | 43 |
| 3701.0 | 44 |
| 3702.0 | 45 |
| 3703.0 | 46 |
| 3704.0 | 45 |
| 3705.0 | 44 |
| 3706.0 | 45 |
| 3707.0 | 46 |
| 3708.0 | 47 |
| 3709.0 | 48 |
| 3710.0 | 47 |
| 3711.0 | 46 |
| 3712.0 | 45 |
| 3713.0 | 46 |
| 3714.0 | 45 |
| 3715.0 | 44 |
| 3716.0 | 43 |
| 3717.0 | 44 |
| 3718.0 | 43 |
| 3719.0 | 44 |
| 3720.0 | 45 |
| 3721.0 | 46 |
| 3722.0 | 47 |
| 3723.0 | 46 |
| 3724.0 | 45 |
| 3725.0 | 46 |
| 3726.0 | 45 |
| 3727.0 | 44 |
| 3728.0 | 45 |
| 3729.0 | 46 |
| 3730.0 | 47 |
| 3731.0 | 48 |
| 3732.0 | 49 |
| 3733.0 | 50 |
| 3734.0 | 49 |
| 3735.0 | 50 |
| 3736.0 | 51 |
| 3737.0 | 52 |
| 3738.0 | 53 |
| 3739.0 | 52 |
| 3740.0 | 53 |
| 3741.0 | 54 |
| 3742.0 | 53 |
| 3743.0 | 52 |
| 3744.0 | 53 |
| 3745.0 | 54 |
| 3746.0 | 55 |
| 3747.0 | 54 |
| 3748.0 | 55 |
| 3749.0 | 54 |
| 3750.0 | 53 |
| 3751.0 | 52 |
| 3752.0 | 51 |
| 3753.0 | 52 |
| 3754.0 | 53 |
| 3755.0 | 54 |
| 3756.0 | 53 |
| 3757.0 | 52 |
| 3758.0 | 51 |
| 3759.0 | 52 |
| 3760.0 | 51 |
| 3761.0 | 52 |
| 3762.0 | 53 |
| 3763.0 | 52 |
| 3764.0 | 51 |
| 3765.0 | 50 |
| 3766.0 | 49 |
| 3767.0 | 50 |
| 3768.0 | 49 |
| 3769.0 | 50 |
| 3770.0 | 51 |
| 3771.0 | 50 |
| 3772.0 | 51 |
| 3773.0 | 50 |
| 3774.0 | 51 |
| 3775.0 | 52 |
| 3776.0 | 53 |
| 3777.0 | 52 |
| 3778.0 | 53 |
| 3779.0 | 52 |
| 3780.0 | 53 |
| 3781.0 | 54 |
| 3782.0 | 55 |
| 3783.0 | 54 |
| 3784.0 | 53 |
| 3785.0 | 54 |
| 3786.0 | 53 |
| 3787.0 | 52 |
| 3788.0 | 53 |
| 3789.0 | 54 |
| 3790.0 | 55 |
| 3791.0 | 54 |
| 3792.0 | 55 |
| 3793.0 | 54 |
| 3794.0 | 53 |
| 3795.0 | 52 |
| 3796.0 | 51 |
| 3797.0 | 50 |
| 3798.0 | 49 |
| 3799.0 | 50 |
| 3800.0 | 49 |
| 3801.0 | 50 |
| 3802.0 | 49 |
| 3803.0 | 48 |
| 3804.0 | 49 |
| 3805.0 | 48 |
| 3806.0 | 49 |
| 3807.0 | 50 |
| 3808.0 | 51 |
| 3809.0 | 50 |
| 3810.0 | 51 |
| 3811.0 | 50 |
| 3812.0 | 49 |
| 3813.0 | 48 |
| 3814.0 | 49 |
| 3815.0 | 48 |
| 3816.0 | 49 |
| 3817.0 | 48 |
| 3818.0 | 47 |
| 3819.0 | 46 |
| 3820.0 | 45 |
| 3821.0 | 46 |
| 3822.0 | 45 |
| 3823.0 | 46 |
| 3824.0 | 47 |
| 3825.0 | 48 |
| 3826.0 | 49 |
| 3827.0 | 48 |
| 3828.0 | 47 |
| 3829.0 | 48 |
| 3830.0 | 47 |
| 3831.0 | 46 |
| 3832.0 | 47 |
| 3833.0 | 46 |
| 3834.0 | 45 |
| 3835.0 | 44 |
| 3836.0 | 43 |
| 3837.0 | 42 |
| 3838.0 | 43 |
| 3839.0 | 44 |
| 3840.0 | 45 |
| 3841.0 | 44 |
| 3842.0 | 43 |
| 3843.0 | 42 |
| 3844.0 | 41 |
| 3845.0 | 40 |
| 3846.0 | 41 |
| 3847.0 | 42 |
| 3848.0 | 43 |
| 3849.0 | 42 |
| 3850.0 | 43 |
| 3851.0 | 44 |
| 3852.0 | 43 |
| 3853.0 | 42 |
| 3854.0 | 41 |
| 3855.0 | 42 |
| 3856.0 | 41 |
| 3857.0 | 40 |
| 3858.0 | 39 |
| 3859.0 | 40 |
| 3860.0 | 41 |
| 3861.0 | 40 |
| 3862.0 | 41 |
| 3863.0 | 40 |
| 3864.0 | 39 |
| 3865.0 | 40 |
| 3866.0 | 39 |
| 3867.0 | 38 |
| 3868.0 | 39 |
| 3869.0 | 40 |
| 3870.0 | 39 |
| 3871.0 | 38 |
| 3872.0 | 37 |
| 3873.0 | 38 |
| 3874.0 | 39 |
| 3875.0 | 40 |
| 3876.0 | 39 |
| 3877.0 | 38 |
| 3878.0 | 39 |
| 3879.0 | 38 |
| 3880.0 | 37 |
| 3881.0 | 36 |
| 3882.0 | 37 |
| 3883.0 | 36 |
| 3884.0 | 37 |
| 3885.0 | 36 |
| 3886.0 | 35 |
| 3887.0 | 36 |
| 3888.0 | 35 |
| 3889.0 | 34 |
| 3890.0 | 35 |
| 3891.0 | 34 |
| 3892.0 | 35 |
| 3893.0 | 36 |
| 3894.0 | 35 |
| 3895.0 | 34 |
| 3896.0 | 33 |
| 3897.0 | 34 |
| 3898.0 | 33 |
| 3899.0 | 34 |
| 3900.0 | 35 |
| 3901.0 | 34 |
| 3902.0 | 33 |
| 3903.0 | 32 |
| 3904.0 | 33 |
| 3905.0 | 34 |
| 3906.0 | 33 |
| 3907.0 | 34 |
| 3908.0 | 33 |
| 3909.0 | 34 |
| 3910.0 | 33 |
| 3911.0 | 32 |
| 3912.0 | 33 |
| 3913.0 | 32 |
| 3914.0 | 33 |
| 3915.0 | 34 |
| 3916.0 | 35 |
| 3917.0 | 36 |
| 3918.0 | 37 |
| 3919.0 | 38 |
| 3920.0 | 39 |
| 3921.0 | 40 |
| 3922.0 | 39 |
| 3923.0 | 38 |
| 3924.0 | 37 |
| 3925.0 | 36 |
| 3926.0 | 37 |
| 3927.0 | 38 |
| 3928.0 | 37 |
| 3929.0 | 38 |
| 3930.0 | 39 |
| 3931.0 | 40 |
| 3932.0 | 39 |
| 3933.0 | 40 |
| 3934.0 | 41 |
| 3935.0 | 40 |
| 3936.0 | 41 |
| 3937.0 | 40 |
| 3938.0 | 41 |
| 3939.0 | 40 |
| 3940.0 | 41 |
| 3941.0 | 40 |
| 3942.0 | 41 |
| 3943.0 | 42 |
| 3944.0 | 41 |
| 3945.0 | 42 |
| 3946.0 | 41 |
| 3947.0 | 40 |
| 3948.0 | 41 |
| 3949.0 | 40 |
| 3950.0 | 39 |
| 3951.0 | 40 |
| 3952.0 | 41 |
| 3953.0 | 40 |
| 3954.0 | 39 |
| 3955.0 | 38 |
| 3956.0 | 39 |
| 3957.0 | 40 |
| 3958.0 | 39 |
| 3959.0 | 40 |
| 3960.0 | 39 |
| 3961.0 | 38 |
| 3962.0 | 39 |
| 3963.0 | 38 |
| 3964.0 | 39 |
| 3965.0 | 38 |
| 3966.0 | 37 |
| 3967.0 | 36 |
| 3968.0 | 35 |
| 3969.0 | 36 |
| 3970.0 | 37 |
| 3971.0 | 36 |
| 3972.0 | 37 |
| 3973.0 | 36 |
| 3974.0 | 35 |
| 3975.0 | 34 |
| 3976.0 | 35 |
| 3977.0 | 36 |
| 3978.0 | 37 |
| 3979.0 | 38 |
| 3980.0 | 39 |
| 3981.0 | 40 |
| 3982.0 | 39 |
| 3983.0 | 40 |
| 3984.0 | 41 |
| 3985.0 | 40 |
| 3986.0 | 39 |
| 3987.0 | 38 |
| 3988.0 | 39 |
| 3989.0 | 38 |
| 3990.0 | 37 |
| 3991.0 | 36 |
| 3992.0 | 37 |
| 3993.0 | 38 |
| 3994.0 | 37 |
| 3995.0 | 38 |
| 3996.0 | 39 |
| 3997.0 | 38 |
| 3998.0 | 37 |
| 3999.0 | 38 |
| 4000.0 | 39 |
| 4001.0 | 40 |
| 4002.0 | 39 |
| 4003.0 | 38 |
| 4004.0 | 37 |
| 4005.0 | 38 |
| 4006.0 | 37 |
| 4007.0 | 38 |
| 4008.0 | 37 |
| 4009.0 | 36 |
| 4010.0 | 37 |
| 4011.0 | 38 |
| 4012.0 | 39 |
| 4013.0 | 38 |
| 4014.0 | 37 |
| 4015.0 | 36 |
| 4016.0 | 37 |
| 4017.0 | 36 |
| 4018.0 | 37 |
| 4019.0 | 36 |
| 4020.0 | 35 |
| 4021.0 | 36 |
| 4022.0 | 37 |
| 4023.0 | 38 |
| 4024.0 | 37 |
| 4025.0 | 36 |
| 4026.0 | 35 |
| 4027.0 | 34 |
| 4028.0 | 35 |
| 4029.0 | 34 |
| 4030.0 | 35 |
| 4031.0 | 34 |
| 4032.0 | 33 |
| 4033.0 | 34 |
| 4034.0 | 35 |
| 4035.0 | 36 |
| 4036.0 | 35 |
| 4037.0 | 36 |
| 4038.0 | 37 |
| 4039.0 | 36 |
| 4040.0 | 35 |
| 4041.0 | 34 |
| 4042.0 | 35 |
| 4043.0 | 36 |
| 4044.0 | 37 |
| 4045.0 | 36 |
| 4046.0 | 37 |
| 4047.0 | 38 |
| 4048.0 | 39 |
| 4049.0 | 38 |
| 4050.0 | 37 |
| 4051.0 | 36 |
| 4052.0 | 35 |
| 4053.0 | 36 |
| 4054.0 | 37 |
| 4055.0 | 38 |
| 4056.0 | 37 |
| 4057.0 | 38 |
| 4058.0 | 37 |
| 4059.0 | 36 |
| 4060.0 | 37 |
| 4061.0 | 38 |
| 4062.0 | 37 |
| 4063.0 | 36 |
| 4064.0 | 37 |
| 4065.0 | 36 |
| 4066.0 | 37 |
| 4067.0 | 36 |
| 4068.0 | 35 |
| 4069.0 | 34 |
| 4070.0 | 35 |
| 4071.0 | 36 |
| 4072.0 | 37 |
| 4073.0 | 38 |
| 4074.0 | 37 |
| 4075.0 | 38 |
| 4076.0 | 39 |
| 4077.0 | 38 |
| 4078.0 | 39 |
| 4079.0 | 38 |
| 4080.0 | 37 |
| 4081.0 | 38 |
| 4082.0 | 37 |
| 4083.0 | 38 |
| 4084.0 | 39 |
| 4085.0 | 40 |
| 4086.0 | 41 |
| 4087.0 | 40 |
| 4088.0 | 39 |
| 4089.0 | 40 |
| 4090.0 | 39 |
| 4091.0 | 40 |
| 4092.0 | 39 |
| 4093.0 | 40 |
| 4094.0 | 39 |
| 4095.0 | 40 |
| 4096.0 | 39 |
| 4097.0 | 40 |
| 4098.0 | 39 |
| 4099.0 | 40 |
| 4100.0 | 41 |
| 4101.0 | 40 |
| 4102.0 | 39 |
| 4103.0 | 38 |
| 4104.0 | 37 |
| 4105.0 | 38 |
| 4106.0 | 37 |
| 4107.0 | 36 |
| 4108.0 | 37 |
| 4109.0 | 38 |
| 4110.0 | 39 |
| 4111.0 | 38 |
| 4112.0 | 39 |
| 4113.0 | 40 |
| 4114.0 | 41 |
| 4115.0 | 42 |
| 4116.0 | 43 |
| 4117.0 | 42 |
| 4118.0 | 43 |
| 4119.0 | 44 |
| 4120.0 | 45 |
| 4121.0 | 44 |
| 4122.0 | 43 |
| 4123.0 | 44 |
| 4124.0 | 45 |
| 4125.0 | 46 |
| 4126.0 | 47 |
| 4127.0 | 48 |
| 4128.0 | 49 |
| 4129.0 | 48 |
| 4130.0 | 49 |
| 4131.0 | 50 |
| 4132.0 | 51 |
| 4133.0 | 50 |
| 4134.0 | 51 |
| 4135.0 | 50 |
| 4136.0 | 49 |
| 4137.0 | 50 |
| 4138.0 | 49 |
| 4139.0 | 50 |
| 4140.0 | 49 |
| 4141.0 | 50 |
| 4142.0 | 51 |
| 4143.0 | 50 |
| 4144.0 | 49 |
| 4145.0 | 48 |
| 4146.0 | 47 |
| 4147.0 | 48 |
| 4148.0 | 49 |
| 4149.0 | 48 |
| 4150.0 | 47 |
| 4151.0 | 46 |
| 4152.0 | 47 |
| 4153.0 | 48 |
| 4154.0 | 47 |
| 4155.0 | 48 |
| 4156.0 | 47 |
| 4157.0 | 46 |
| 4158.0 | 47 |
| 4159.0 | 46 |
| 4160.0 | 47 |
| 4161.0 | 48 |
| 4162.0 | 47 |
| 4163.0 | 46 |
| 4164.0 | 47 |
| 4165.0 | 48 |
| 4166.0 | 47 |
| 4167.0 | 48 |
| 4168.0 | 49 |
| 4169.0 | 50 |
| 4170.0 | 49 |
| 4171.0 | 48 |
| 4172.0 | 49 |
| 4173.0 | 50 |
| 4174.0 | 51 |
| 4175.0 | 52 |
| 4176.0 | 51 |
| 4177.0 | 50 |
| 4178.0 | 51 |
| 4179.0 | 52 |
| 4180.0 | 51 |
| 4181.0 | 50 |
| 4182.0 | 49 |
| 4183.0 | 50 |
| 4184.0 | 49 |
| 4185.0 | 48 |
| 4186.0 | 49 |
| 4187.0 | 48 |
| 4188.0 | 47 |
| 4189.0 | 48 |
| 4190.0 | 49 |
| 4191.0 | 48 |
| 4192.0 | 49 |
| 4193.0 | 50 |
| 4194.0 | 51 |
| 4195.0 | 52 |
| 4196.0 | 51 |
| 4197.0 | 52 |
| 4198.0 | 51 |
| 4199.0 | 50 |
| 4200.0 | 49 |
| 4201.0 | 50 |
| 4202.0 | 49 |
| 4203.0 | 48 |
| 4204.0 | 47 |
| 4205.0 | 48 |
| 4206.0 | 47 |
| 4207.0 | 48 |
| 4208.0 | 47 |
| 4209.0 | 48 |
| 4210.0 | 49 |
| 4211.0 | 50 |
| 4212.0 | 49 |
| 4213.0 | 48 |
| 4214.0 | 47 |
| 4215.0 | 48 |
| 4216.0 | 47 |
| 4217.0 | 46 |
| 4218.0 | 47 |
| 4219.0 | 46 |
| 4220.0 | 45 |
| 4221.0 | 44 |
| 4222.0 | 45 |
| 4223.0 | 44 |
| 4224.0 | 43 |
| 4225.0 | 44 |
| 4226.0 | 43 |
| 4227.0 | 44 |
| 4228.0 | 45 |
| 4229.0 | 44 |
| 4230.0 | 45 |
| 4231.0 | 44 |
| 4232.0 | 45 |
| 4233.0 | 46 |
| 4234.0 | 47 |
| 4235.0 | 48 |
| 4236.0 | 49 |
| 4237.0 | 50 |
| 4238.0 | 49 |
| 4239.0 | 48 |
| 4240.0 | 47 |
| 4241.0 | 48 |
| 4242.0 | 47 |
| 4243.0 | 48 |
| 4244.0 | 49 |
| 4245.0 | 50 |
| 4246.0 | 49 |
| 4247.0 | 48 |
| 4248.0 | 47 |
| 4249.0 | 48 |
| 4250.0 | 47 |
| 4251.0 | 48 |
| 4252.0 | 47 |
| 4253.0 | 46 |
| 4254.0 | 47 |
| 4255.0 | 48 |
| 4256.0 | 49 |
| 4257.0 | 50 |
| 4258.0 | 51 |
| 4259.0 | 52 |
| 4260.0 | 53 |
| 4261.0 | 54 |
| 4262.0 | 53 |
| 4263.0 | 52 |
| 4264.0 | 51 |
| 4265.0 | 50 |
| 4266.0 | 51 |
| 4267.0 | 52 |
| 4268.0 | 53 |
| 4269.0 | 54 |
| 4270.0 | 53 |
| 4271.0 | 52 |
| 4272.0 | 53 |
| 4273.0 | 54 |
| 4274.0 | 55 |
| 4275.0 | 56 |
| 4276.0 | 55 |
| 4277.0 | 54 |
| 4278.0 | 55 |
| 4279.0 | 56 |
| 4280.0 | 55 |
| 4281.0 | 54 |
| 4282.0 | 53 |
| 4283.0 | 54 |
| 4284.0 | 53 |
| 4285.0 | 52 |
| 4286.0 | 51 |
| 4287.0 | 52 |
| 4288.0 | 51 |
| 4289.0 | 50 |
| 4290.0 | 51 |
| 4291.0 | 52 |
| 4292.0 | 53 |
| 4293.0 | 54 |
| 4294.0 | 53 |
| 4295.0 | 54 |
| 4296.0 | 53 |
| 4297.0 | 52 |
| 4298.0 | 51 |
| 4299.0 | 50 |
| 4300.0 | 49 |
| 4301.0 | 48 |
| 4302.0 | 47 |
| 4303.0 | 48 |
| 4304.0 | 47 |
| 4305.0 | 46 |
| 4306.0 | 45 |
| 4307.0 | 44 |
| 4308.0 | 45 |
| 4309.0 | 46 |
| 4310.0 | 47 |
| 4311.0 | 46 |
| 4312.0 | 45 |
| 4313.0 | 46 |
| 4314.0 | 47 |
| 4315.0 | 48 |
| 4316.0 | 49 |
| 4317.0 | 48 |
| 4318.0 | 49 |
| 4319.0 | 50 |
| 4320.0 | 51 |
| 4321.0 | 50 |
| 4322.0 | 51 |
| 4323.0 | 52 |
| 4324.0 | 53 |
| 4325.0 | 54 |
| 4326.0 | 55 |
| 4327.0 | 56 |
| 4328.0 | 57 |
| 4329.0 | 58 |
| 4330.0 | 59 |
| 4331.0 | 60 |
| 4332.0 | 59 |
| 4333.0 | 58 |
| 4334.0 | 59 |
| 4335.0 | 58 |
| 4336.0 | 57 |
| 4337.0 | 56 |
| 4338.0 | 55 |
| 4339.0 | 56 |
| 4340.0 | 55 |
| 4341.0 | 54 |
| 4342.0 | 53 |
| 4343.0 | 54 |
| 4344.0 | 53 |
| 4345.0 | 52 |
| 4346.0 | 53 |
| 4347.0 | 52 |
| 4348.0 | 51 |
| 4349.0 | 52 |
| 4350.0 | 51 |
| 4351.0 | 52 |
| 4352.0 | 53 |
| 4353.0 | 52 |
| 4354.0 | 51 |
| 4355.0 | 52 |
| 4356.0 | 53 |
| 4357.0 | 52 |
| 4358.0 | 51 |
| 4359.0 | 52 |
| 4360.0 | 53 |
| 4361.0 | 54 |
| 4362.0 | 53 |
| 4363.0 | 52 |
| 4364.0 | 53 |
| 4365.0 | 52 |
| 4366.0 | 51 |
| 4367.0 | 52 |
| 4368.0 | 51 |
| 4369.0 | 52 |
| 4370.0 | 53 |
| 4371.0 | 52 |
| 4372.0 | 53 |
| 4373.0 | 52 |
| 4374.0 | 51 |
| 4375.0 | 50 |
| 4376.0 | 49 |
| 4377.0 | 50 |
| 4378.0 | 51 |
| 4379.0 | 50 |
| 4380.0 | 49 |
| 4381.0 | 50 |
| 4382.0 | 49 |
| 4383.0 | 50 |
| 4384.0 | 51 |
| 4385.0 | 52 |
| 4386.0 | 51 |
| 4387.0 | 52 |
| 4388.0 | 51 |
| 4389.0 | 52 |
| 4390.0 | 53 |
| 4391.0 | 52 |
| 4392.0 | 53 |
| 4393.0 | 54 |
| 4394.0 | 55 |
| 4395.0 | 54 |
| 4396.0 | 55 |
| 4397.0 | 54 |
| 4398.0 | 53 |
| 4399.0 | 54 |
| 4400.0 | 53 |
| 4401.0 | 52 |
| 4402.0 | 51 |
| 4403.0 | 50 |
| 4404.0 | 51 |
| 4405.0 | 50 |
| 4406.0 | 49 |
| 4407.0 | 48 |
| 4408.0 | 47 |
| 4409.0 | 48 |
| 4410.0 | 47 |
| 4411.0 | 46 |
| 4412.0 | 47 |
| 4413.0 | 46 |
| 4414.0 | 47 |
| 4415.0 | 48 |
| 4416.0 | 47 |
| 4417.0 | 48 |
| 4418.0 | 47 |
| 4419.0 | 48 |
| 4420.0 | 47 |
| 4421.0 | 46 |
| 4422.0 | 45 |
| 4423.0 | 44 |
| 4424.0 | 45 |
| 4425.0 | 44 |
| 4426.0 | 43 |
| 4427.0 | 42 |
| 4428.0 | 41 |
| 4429.0 | 42 |
| 4430.0 | 43 |
| 4431.0 | 44 |
| 4432.0 | 43 |
| 4433.0 | 42 |
| 4434.0 | 43 |
| 4435.0 | 42 |
| 4436.0 | 41 |
| 4437.0 | 40 |
| 4438.0 | 39 |
| 4439.0 | 38 |
| 4440.0 | 39 |
| 4441.0 | 38 |
| 4442.0 | 39 |
| 4443.0 | 38 |
| 4444.0 | 37 |
| 4445.0 | 36 |
| 4446.0 | 35 |
| 4447.0 | 36 |
| 4448.0 | 35 |
| 4449.0 | 36 |
| 4450.0 | 37 |
| 4451.0 | 36 |
| 4452.0 | 35 |
| 4453.0 | 36 |
| 4454.0 | 37 |
| 4455.0 | 38 |
| 4456.0 | 37 |
| 4457.0 | 38 |
| 4458.0 | 37 |
| 4459.0 | 38 |
| 4460.0 | 37 |
| 4461.0 | 36 |
| 4462.0 | 37 |
| 4463.0 | 38 |
| 4464.0 | 37 |
| 4465.0 | 36 |
| 4466.0 | 37 |
| 4467.0 | 38 |
| 4468.0 | 39 |
| 4469.0 | 38 |
| 4470.0 | 39 |
| 4471.0 | 38 |
| 4472.0 | 39 |
| 4473.0 | 40 |
| 4474.0 | 39 |
| 4475.0 | 38 |
| 4476.0 | 39 |
| 4477.0 | 38 |
| 4478.0 | 37 |
| 4479.0 | 38 |
| 4480.0 | 37 |
| 4481.0 | 38 |
| 4482.0 | 39 |
| 4483.0 | 38 |
| 4484.0 | 39 |
| 4485.0 | 38 |
| 4486.0 | 37 |
| 4487.0 | 36 |
| 4488.0 | 35 |
| 4489.0 | 36 |
| 4490.0 | 35 |
| 4491.0 | 34 |
| 4492.0 | 33 |
| 4493.0 | 34 |
| 4494.0 | 33 |
| 4495.0 | 32 |
| 4496.0 | 33 |
| 4497.0 | 32 |
| 4498.0 | 31 |
| 4499.0 | 32 |
| 4500.0 | 31 |
| 4501.0 | 32 |
| 4502.0 | 31 |
| 4503.0 | 32 |
| 4504.0 | 33 |
| 4505.0 | 32 |
| 4506.0 | 33 |
| 4507.0 | 34 |
| 4508.0 | 35 |
| 4509.0 | 36 |
| 4510.0 | 37 |
| 4511.0 | 36 |
| 4512.0 | 35 |
| 4513.0 | 34 |
| 4514.0 | 35 |
| 4515.0 | 36 |
| 4516.0 | 37 |
| 4517.0 | 38 |
| 4518.0 | 39 |
| 4519.0 | 40 |
| 4520.0 | 41 |
| 4521.0 | 40 |
| 4522.0 | 41 |
| 4523.0 | 40 |
| 4524.0 | 39 |
| 4525.0 | 38 |
| 4526.0 | 39 |
| 4527.0 | 40 |
| 4528.0 | 39 |
| 4529.0 | 38 |
| 4530.0 | 37 |
| 4531.0 | 36 |
| 4532.0 | 37 |
| 4533.0 | 38 |
| 4534.0 | 39 |
| 4535.0 | 40 |
| 4536.0 | 39 |
| 4537.0 | 38 |
| 4538.0 | 37 |
| 4539.0 | 38 |
| 4540.0 | 39 |
| 4541.0 | 40 |
| 4542.0 | 41 |
| 4543.0 | 40 |
| 4544.0 | 39 |
| 4545.0 | 38 |
| 4546.0 | 37 |
| 4547.0 | 36 |
| 4548.0 | 37 |
| 4549.0 | 36 |
| 4550.0 | 37 |
| 4551.0 | 38 |
| 4552.0 | 39 |
| 4553.0 | 38 |
| 4554.0 | 39 |
| 4555.0 | 40 |
| 4556.0 | 39 |
| 4557.0 | 38 |
| 4558.0 | 39 |
| 4559.0 | 40 |
| 4560.0 | 41 |
| 4561.0 | 42 |
| 4562.0 | 43 |
| 4563.0 | 42 |
| 4564.0 | 43 |
| 4565.0 | 42 |
| 4566.0 | 43 |
| 4567.0 | 42 |
| 4568.0 | 43 |
| 4569.0 | 44 |
| 4570.0 | 45 |
| 4571.0 | 44 |
| 4572.0 | 45 |
| 4573.0 | 44 |
| 4574.0 | 43 |
| 4575.0 | 44 |
| 4576.0 | 45 |
| 4577.0 | 44 |
| 4578.0 | 43 |
| 4579.0 | 44 |
| 4580.0 | 43 |
| 4581.0 | 42 |
| 4582.0 | 41 |
| 4583.0 | 40 |
| 4584.0 | 39 |
| 4585.0 | 40 |
| 4586.0 | 41 |
| 4587.0 | 42 |
| 4588.0 | 41 |
| 4589.0 | 42 |
| 4590.0 | 41 |
| 4591.0 | 40 |
| 4592.0 | 41 |
| 4593.0 | 42 |
| 4594.0 | 41 |
| 4595.0 | 42 |
| 4596.0 | 43 |
| 4597.0 | 42 |
| 4598.0 | 43 |
| 4599.0 | 44 |
| 4600.0 | 45 |
| 4601.0 | 46 |
| 4602.0 | 45 |
| 4603.0 | 44 |
| 4604.0 | 45 |
| 4605.0 | 46 |
| 4606.0 | 45 |
| 4607.0 | 44 |
| 4608.0 | 45 |
| 4609.0 | 44 |
| 4610.0 | 45 |
| 4611.0 | 46 |
| 4612.0 | 47 |
| 4613.0 | 48 |
| 4614.0 | 47 |
| 4615.0 | 48 |
| 4616.0 | 49 |
| 4617.0 | 48 |
| 4618.0 | 49 |
| 4619.0 | 50 |
| 4620.0 | 51 |
| 4621.0 | 50 |
| 4622.0 | 49 |
| 4623.0 | 50 |
| 4624.0 | 49 |
| 4625.0 | 50 |
| 4626.0 | 49 |
| 4627.0 | 48 |
| 4628.0 | 47 |
| 4629.0 | 46 |
| 4630.0 | 45 |
| 4631.0 | 46 |
| 4632.0 | 45 |
| 4633.0 | 44 |
| 4634.0 | 43 |
| 4635.0 | 44 |
| 4636.0 | 45 |
| 4637.0 | 46 |
| 4638.0 | 47 |
| 4639.0 | 48 |
| 4640.0 | 47 |
| 4641.0 | 46 |
| 4642.0 | 45 |
| 4643.0 | 46 |
| 4644.0 | 47 |
| 4645.0 | 48 |
| 4646.0 | 49 |
| 4647.0 | 50 |
| 4648.0 | 49 |
| 4649.0 | 50 |
| 4650.0 | 51 |
| 4651.0 | 50 |
| 4652.0 | 49 |
| 4653.0 | 48 |
| 4654.0 | 47 |
| 4655.0 | 48 |
| 4656.0 | 47 |
| 4657.0 | 48 |
| 4658.0 | 47 |
| 4659.0 | 48 |
| 4660.0 | 47 |
| 4661.0 | 46 |
| 4662.0 | 45 |
| 4663.0 | 44 |
| 4664.0 | 43 |
| 4665.0 | 42 |
| 4666.0 | 41 |
| 4667.0 | 42 |
| 4668.0 | 41 |
| 4669.0 | 40 |
| 4670.0 | 41 |
| 4671.0 | 42 |
| 4672.0 | 41 |
| 4673.0 | 40 |
| 4674.0 | 39 |
| 4675.0 | 38 |
| 4676.0 | 39 |
| 4677.0 | 40 |
| 4678.0 | 41 |
| 4679.0 | 40 |
| 4680.0 | 39 |
| 4681.0 | 40 |
| 4682.0 | 41 |
| 4683.0 | 40 |
| 4684.0 | 39 |
| 4685.0 | 40 |
| 4686.0 | 41 |
| 4687.0 | 40 |
| 4688.0 | 39 |
| 4689.0 | 38 |
| 4690.0 | 39 |
| 4691.0 | 40 |
| 4692.0 | 41 |
| 4693.0 | 40 |
| 4694.0 | 41 |
| 4695.0 | 40 |
| 4696.0 | 41 |
| 4697.0 | 42 |
| 4698.0 | 43 |
| 4699.0 | 44 |
| 4700.0 | 43 |
| 4701.0 | 44 |
| 4702.0 | 43 |
| 4703.0 | 42 |
| 4704.0 | 41 |
| 4705.0 | 40 |
| 4706.0 | 41 |
| 4707.0 | 40 |
| 4708.0 | 41 |
| 4709.0 | 40 |
| 4710.0 | 41 |
| 4711.0 | 42 |
| 4712.0 | 41 |
| 4713.0 | 40 |
| 4714.0 | 39 |
| 4715.0 | 40 |
| 4716.0 | 41 |
| 4717.0 | 42 |
| 4718.0 | 41 |
| 4719.0 | 42 |
| 4720.0 | 41 |
| 4721.0 | 40 |
| 4722.0 | 41 |
| 4723.0 | 42 |
| 4724.0 | 43 |
| 4725.0 | 42 |
| 4726.0 | 41 |
| 4727.0 | 40 |
| 4728.0 | 41 |
| 4729.0 | 40 |
| 4730.0 | 39 |
| 4731.0 | 38 |
| 4732.0 | 39 |
| 4733.0 | 38 |
| 4734.0 | 37 |
| 4735.0 | 38 |
| 4736.0 | 37 |
| 4737.0 | 38 |
| 4738.0 | 37 |
| 4739.0 | 36 |
| 4740.0 | 35 |
| 4741.0 | 34 |
| 4742.0 | 35 |
| 4743.0 | 36 |
| 4744.0 | 37 |
| 4745.0 | 38 |
| 4746.0 | 39 |
| 4747.0 | 38 |
| 4748.0 | 39 |
| 4749.0 | 40 |
| 4750.0 | 41 |
| 4751.0 | 42 |
| 4752.0 | 41 |
| 4753.0 | 40 |
| 4754.0 | 39 |
| 4755.0 | 38 |
| 4756.0 | 39 |
| 4757.0 | 40 |
| 4758.0 | 41 |
| 4759.0 | 42 |
| 4760.0 | 43 |
| 4761.0 | 44 |
| 4762.0 | 45 |
| 4763.0 | 46 |
| 4764.0 | 47 |
| 4765.0 | 46 |
| 4766.0 | 47 |
| 4767.0 | 48 |
| 4768.0 | 47 |
| 4769.0 | 46 |
| 4770.0 | 47 |
| 4771.0 | 48 |
| 4772.0 | 49 |
| 4773.0 | 48 |
| 4774.0 | 49 |
| 4775.0 | 48 |
| 4776.0 | 47 |
| 4777.0 | 48 |
| 4778.0 | 47 |
| 4779.0 | 48 |
| 4780.0 | 49 |
| 4781.0 | 50 |
| 4782.0 | 49 |
| 4783.0 | 48 |
| 4784.0 | 47 |
| 4785.0 | 48 |
| 4786.0 | 49 |
| 4787.0 | 50 |
| 4788.0 | 49 |
| 4789.0 | 48 |
| 4790.0 | 47 |
| 4791.0 | 46 |
| 4792.0 | 45 |
| 4793.0 | 46 |
| 4794.0 | 45 |
| 4795.0 | 46 |
| 4796.0 | 45 |
| 4797.0 | 46 |
| 4798.0 | 45 |
| 4799.0 | 46 |
| 4800.0 | 45 |
| 4801.0 | 44 |
| 4802.0 | 45 |
| 4803.0 | 44 |
| 4804.0 | 43 |
| 4805.0 | 42 |
| 4806.0 | 41 |
| 4807.0 | 40 |
| 4808.0 | 41 |
| 4809.0 | 42 |
| 4810.0 | 41 |
| 4811.0 | 40 |
| 4812.0 | 41 |
| 4813.0 | 42 |
| 4814.0 | 43 |
| 4815.0 | 42 |
| 4816.0 | 41 |
| 4817.0 | 42 |
| 4818.0 | 41 |
| 4819.0 | 42 |
| 4820.0 | 43 |
| 4821.0 | 44 |
| 4822.0 | 43 |
| 4823.0 | 44 |
| 4824.0 | 45 |
| 4825.0 | 46 |
| 4826.0 | 45 |
| 4827.0 | 46 |
| 4828.0 | 47 |
| 4829.0 | 46 |
| 4830.0 | 45 |
| 4831.0 | 46 |
| 4832.0 | 47 |
| 4833.0 | 48 |
| 4834.0 | 49 |
| 4835.0 | 50 |
| 4836.0 | 49 |
| 4837.0 | 50 |
| 4838.0 | 49 |
| 4839.0 | 48 |
| 4840.0 | 49 |
| 4841.0 | 48 |
| 4842.0 | 49 |
| 4843.0 | 50 |
| 4844.0 | 51 |
| 4845.0 | 50 |
| 4846.0 | 51 |
| 4847.0 | 50 |
| 4848.0 | 51 |
| 4849.0 | 50 |
| 4850.0 | 49 |
| 4851.0 | 48 |
| 4852.0 | 47 |
| 4853.0 | 48 |
| 4854.0 | 47 |
| 4855.0 | 48 |
| 4856.0 | 47 |
| 4857.0 | 46 |
| 4858.0 | 45 |
| 4859.0 | 46 |
| 4860.0 | 45 |
| 4861.0 | 44 |
| 4862.0 | 43 |
| 4863.0 | 44 |
| 4864.0 | 45 |
| 4865.0 | 44 |
| 4866.0 | 43 |
| 4867.0 | 44 |
| 4868.0 | 43 |
| 4869.0 | 44 |
| 4870.0 | 45 |
| 4871.0 | 46 |
| 4872.0 | 47 |
| 4873.0 | 46 |
| 4874.0 | 47 |
| 4875.0 | 48 |
| 4876.0 | 49 |
| 4877.0 | 50 |
| 4878.0 | 49 |
| 4879.0 | 50 |
| 4880.0 | 49 |
| 4881.0 | 48 |
| 4882.0 | 49 |
| 4883.0 | 50 |
| 4884.0 | 51 |
| 4885.0 | 52 |
| 4886.0 | 53 |
| 4887.0 | 52 |
| 4888.0 | 51 |
| 4889.0 | 50 |
| 4890.0 | 49 |
| 4891.0 | 48 |
| 4892.0 | 47 |
| 4893.0 | 48 |
| 4894.0 | 49 |
| 4895.0 | 50 |
| 4896.0 | 49 |
| 4897.0 | 48 |
| 4898.0 | 47 |
| 4899.0 | 46 |
| 4900.0 | 45 |
| 4901.0 | 46 |
| 4902.0 | 47 |
| 4903.0 | 46 |
| 4904.0 | 45 |
| 4905.0 | 46 |
| 4906.0 | 47 |
| 4907.0 | 48 |
| 4908.0 | 49 |
| 4909.0 | 50 |
| 4910.0 | 51 |
| 4911.0 | 50 |
| 4912.0 | 51 |
| 4913.0 | 50 |
| 4914.0 | 51 |
| 4915.0 | 50 |
| 4916.0 | 49 |
| 4917.0 | 50 |
| 4918.0 | 51 |
| 4919.0 | 50 |
| 4920.0 | 51 |
| 4921.0 | 52 |
| 4922.0 | 51 |
| 4923.0 | 50 |
| 4924.0 | 49 |
| 4925.0 | 48 |
| 4926.0 | 47 |
| 4927.0 | 46 |
| 4928.0 | 45 |
| 4929.0 | 46 |
| 4930.0 | 47 |
| 4931.0 | 48 |
| 4932.0 | 49 |
| 4933.0 | 48 |
| 4934.0 | 47 |
| 4935.0 | 48 |
| 4936.0 | 47 |
| 4937.0 | 48 |
| 4938.0 | 47 |
| 4939.0 | 46 |
| 4940.0 | 45 |
| 4941.0 | 44 |
| 4942.0 | 43 |
| 4943.0 | 44 |
| 4944.0 | 43 |
| 4945.0 | 42 |
| 4946.0 | 41 |
| 4947.0 | 40 |
| 4948.0 | 41 |
| 4949.0 | 42 |
| 4950.0 | 43 |
| 4951.0 | 44 |
| 4952.0 | 43 |
| 4953.0 | 44 |
| 4954.0 | 45 |
| 4955.0 | 44 |
| 4956.0 | 43 |
| 4957.0 | 42 |
| 4958.0 | 43 |
| 4959.0 | 44 |
| 4960.0 | 43 |
| 4961.0 | 44 |
| 4962.0 | 43 |
| 4963.0 | 42 |
| 4964.0 | 41 |
| 4965.0 | 42 |
| 4966.0 | 41 |
| 4967.0 | 42 |
| 4968.0 | 41 |
| 4969.0 | 40 |
| 4970.0 | 41 |
| 4971.0 | 42 |
| 4972.0 | 41 |
| 4973.0 | 40 |
| 4974.0 | 41 |
| 4975.0 | 40 |
| 4976.0 | 39 |
| 4977.0 | 38 |
| 4978.0 | 37 |
| 4979.0 | 36 |
| 4980.0 | 35 |
| 4981.0 | 36 |
| 4982.0 | 37 |
| 4983.0 | 36 |
| 4984.0 | 37 |
| 4985.0 | 38 |
| 4986.0 | 39 |
| 4987.0 | 38 |
| 4988.0 | 37 |
| 4989.0 | 36 |
| 4990.0 | 37 |
| 4991.0 | 38 |
| 4992.0 | 37 |
| 4993.0 | 36 |
| 4994.0 | 35 |
| 4995.0 | 36 |
| 4996.0 | 37 |
| 4997.0 | 36 |
| 4998.0 | 37 |
| 4999.0 | 36 |
| 5000.0 | 37 |
| 5001.0 | 36 |
| 5002.0 | 35 |
| 5003.0 | 34 |
| 5004.0 | 33 |
| 5005.0 | 32 |
| 5006.0 | 31 |
| 5007.0 | 32 |
| 5008.0 | 31 |
| 5009.0 | 30 |
| 5010.0 | 31 |
| 5011.0 | 30 |
| 5012.0 | 31 |
| 5013.0 | 32 |
| 5014.0 | 33 |
| 5015.0 | 32 |
| 5016.0 | 31 |
| 5017.0 | 32 |
| 5018.0 | 33 |
| 5019.0 | 32 |
| 5020.0 | 33 |
| 5021.0 | 34 |
| 5022.0 | 35 |
| 5023.0 | 34 |
| 5024.0 | 35 |
| 5025.0 | 36 |
| 5026.0 | 35 |
| 5027.0 | 36 |
| 5028.0 | 37 |
| 5029.0 | 38 |
| 5030.0 | 37 |
| 5031.0 | 38 |
| 5032.0 | 39 |
| 5033.0 | 40 |
| 5034.0 | 41 |
| 5035.0 | 42 |
| 5036.0 | 41 |
| 5037.0 | 42 |
| 5038.0 | 41 |
| 5039.0 | 40 |
| 5040.0 | 41 |
| 5041.0 | 40 |
| 5042.0 | 41 |
| 5043.0 | 42 |
| 5044.0 | 43 |
| 5045.0 | 44 |
| 5046.0 | 45 |
| 5047.0 | 44 |
| 5048.0 | 45 |
| 5049.0 | 44 |
| 5050.0 | 45 |
| 5051.0 | 44 |
| 5052.0 | 43 |
| 5053.0 | 44 |
| 5054.0 | 45 |
| 5055.0 | 46 |
| 5056.0 | 45 |
| 5057.0 | 44 |
| 5058.0 | 45 |
| 5059.0 | 46 |
| 5060.0 | 45 |
| 5061.0 | 44 |
| 5062.0 | 43 |
| 5063.0 | 42 |
| 5064.0 | 43 |
| 5065.0 | 44 |
| 5066.0 | 45 |
| 5067.0 | 46 |
| 5068.0 | 47 |
| 5069.0 | 46 |
| 5070.0 | 45 |
| 5071.0 | 44 |
| 5072.0 | 45 |
| 5073.0 | 44 |
| 5074.0 | 43 |
| 5075.0 | 44 |
| 5076.0 | 45 |
| 5077.0 | 46 |
| 5078.0 | 47 |
| 5079.0 | 46 |
| 5080.0 | 47 |
| 5081.0 | 48 |
| 5082.0 | 47 |
| 5083.0 | 48 |
| 5084.0 | 47 |
| 5085.0 | 46 |
| 5086.0 | 47 |
| 5087.0 | 48 |
| 5088.0 | 49 |
| 5089.0 | 48 |
| 5090.0 | 47 |
| 5091.0 | 48 |
| 5092.0 | 49 |
| 5093.0 | 48 |
| 5094.0 | 47 |
| 5095.0 | 46 |
| 5096.0 | 47 |
| 5097.0 | 46 |
| 5098.0 | 47 |
| 5099.0 | 48 |
| 5100.0 | 47 |
| 5101.0 | 48 |
| 5102.0 | 47 |
| 5103.0 | 48 |
| 5104.0 | 49 |
| 5105.0 | 50 |
| 5106.0 | 49 |
| 5107.0 | 50 |
| 5108.0 | 49 |
| 5109.0 | 50 |
| 5110.0 | 49 |
| 5111.0 | 50 |
| 5112.0 | 49 |
| 5113.0 | 50 |
| 5114.0 | 51 |
| 5115.0 | 52 |
| 5116.0 | 53 |
| 5117.0 | 54 |
| 5118.0 | 53 |
| 5119.0 | 52 |
| 5120.0 | 53 |
| 5121.0 | 52 |
| 5122.0 | 53 |
| 5123.0 | 52 |
| 5124.0 | 53 |
| 5125.0 | 52 |
| 5126.0 | 51 |
| 5127.0 | 50 |
| 5128.0 | 49 |
| 5129.0 | 48 |
| 5130.0 | 47 |
| 5131.0 | 46 |
| 5132.0 | 47 |
| 5133.0 | 46 |
| 5134.0 | 45 |
| 5135.0 | 44 |
| 5136.0 | 45 |
| 5137.0 | 44 |
| 5138.0 | 43 |
| 5139.0 | 44 |
| 5140.0 | 43 |
| 5141.0 | 42 |
| 5142.0 | 41 |
| 5143.0 | 42 |
| 5144.0 | 41 |
| 5145.0 | 40 |
| 5146.0 | 41 |
| 5147.0 | 40 |
| 5148.0 | 39 |
| 5149.0 | 40 |
| 5150.0 | 39 |
| 5151.0 | 38 |
| 5152.0 | 39 |
| 5153.0 | 38 |
| 5154.0 | 37 |
| 5155.0 | 38 |
| 5156.0 | 37 |
| 5157.0 | 36 |
| 5158.0 | 35 |
| 5159.0 | 36 |
| 5160.0 | 35 |
| 5161.0 | 34 |
| 5162.0 | 33 |
| 5163.0 | 32 |
| 5164.0 | 31 |
| 5165.0 | 32 |
| 5166.0 | 33 |
| 5167.0 | 32 |
| 5168.0 | 31 |
| 5169.0 | 30 |
| 5170.0 | 31 |
| 5171.0 | 32 |
| 5172.0 | 31 |
| 5173.0 | 30 |
| 5174.0 | 29 |
| 5175.0 | 30 |
| 5176.0 | 31 |
| 5177.0 | 30 |
| 5178.0 | 29 |
| 5179.0 | 30 |
| 5180.0 | 29 |
| 5181.0 | 28 |
| 5182.0 | 27 |
| 5183.0 | 28 |
| 5184.0 | 29 |
| 5185.0 | 28 |
| 5186.0 | 27 |
| 5187.0 | 26 |
| 5188.0 | 25 |
| 5189.0 | 24 |
| 5190.0 | 23 |
| 5191.0 | 22 |
| 5192.0 | 21 |
| 5193.0 | 20 |
| 5194.0 | 21 |
| 5195.0 | 20 |
| 5196.0 | 19 |
| 5197.0 | 18 |
| 5198.0 | 19 |
| 5199.0 | 18 |
| 5200.0 | 19 |
| 5201.0 | 20 |
| 5202.0 | 19 |
| 5203.0 | 20 |
| 5204.0 | 21 |
| 5205.0 | 22 |
| 5206.0 | 23 |
| 5207.0 | 24 |
| 5208.0 | 25 |
| 5209.0 | 26 |
| 5210.0 | 25 |
| 5211.0 | 26 |
| 5212.0 | 27 |
| 5213.0 | 26 |
| 5214.0 | 27 |
| 5215.0 | 28 |
| 5216.0 | 27 |
| 5217.0 | 28 |
| 5218.0 | 27 |
| 5219.0 | 26 |
| 5220.0 | 27 |
| 5221.0 | 28 |
| 5222.0 | 27 |
| 5223.0 | 28 |
| 5224.0 | 29 |
| 5225.0 | 30 |
| 5226.0 | 31 |
| 5227.0 | 32 |
| 5228.0 | 33 |
| 5229.0 | 32 |
| 5230.0 | 33 |
| 5231.0 | 34 |
| 5232.0 | 35 |
| 5233.0 | 36 |
| 5234.0 | 37 |
| 5235.0 | 38 |
| 5236.0 | 37 |
| 5237.0 | 38 |
| 5238.0 | 37 |
| 5239.0 | 36 |
| 5240.0 | 37 |
| 5241.0 | 38 |
| 5242.0 | 37 |
| 5243.0 | 38 |
| 5244.0 | 37 |
| 5245.0 | 36 |
| 5246.0 | 37 |
| 5247.0 | 36 |
| 5248.0 | 35 |
| 5249.0 | 36 |
| 5250.0 | 37 |
| 5251.0 | 36 |
| 5252.0 | 35 |
| 5253.0 | 34 |
| 5254.0 | 35 |
| 5255.0 | 36 |
| 5256.0 | 35 |
| 5257.0 | 36 |
| 5258.0 | 37 |
| 5259.0 | 36 |
| 5260.0 | 35 |
| 5261.0 | 34 |
| 5262.0 | 33 |
| 5263.0 | 34 |
| 5264.0 | 33 |
| 5265.0 | 34 |
| 5266.0 | 35 |
| 5267.0 | 34 |
| 5268.0 | 35 |
| 5269.0 | 36 |
| 5270.0 | 35 |
| 5271.0 | 34 |
| 5272.0 | 35 |
| 5273.0 | 34 |
| 5274.0 | 35 |
| 5275.0 | 36 |
| 5276.0 | 37 |
| 5277.0 | 36 |
| 5278.0 | 37 |
| 5279.0 | 36 |
| 5280.0 | 35 |
| 5281.0 | 34 |
| 5282.0 | 33 |
| 5283.0 | 32 |
| 5284.0 | 31 |
| 5285.0 | 32 |
| 5286.0 | 33 |
| 5287.0 | 32 |
| 5288.0 | 31 |
| 5289.0 | 32 |
| 5290.0 | 31 |
| 5291.0 | 30 |
| 5292.0 | 29 |
| 5293.0 | 28 |
| 5294.0 | 29 |
| 5295.0 | 28 |
| 5296.0 | 27 |
| 5297.0 | 28 |
| 5298.0 | 29 |
| 5299.0 | 28 |
| 5300.0 | 27 |
| 5301.0 | 26 |
| 5302.0 | 25 |
| 5303.0 | 26 |
| 5304.0 | 27 |
| 5305.0 | 28 |
| 5306.0 | 29 |
| 5307.0 | 28 |
| 5308.0 | 29 |
| 5309.0 | 30 |
| 5310.0 | 29 |
| 5311.0 | 30 |
| 5312.0 | 31 |
| 5313.0 | 30 |
| 5314.0 | 31 |
| 5315.0 | 30 |
| 5316.0 | 29 |
| 5317.0 | 28 |
| 5318.0 | 27 |
| 5319.0 | 26 |
| 5320.0 | 25 |
| 5321.0 | 26 |
| 5322.0 | 25 |
| 5323.0 | 24 |
| 5324.0 | 23 |
| 5325.0 | 22 |
| 5326.0 | 21 |
| 5327.0 | 22 |
| 5328.0 | 23 |
| 5329.0 | 22 |
| 5330.0 | 21 |
| 5331.0 | 22 |
| 5332.0 | 23 |
| 5333.0 | 24 |
| 5334.0 | 23 |
| 5335.0 | 22 |
| 5336.0 | 21 |
| 5337.0 | 20 |
| 5338.0 | 21 |
| 5339.0 | 22 |
| 5340.0 | 23 |
| 5341.0 | 22 |
| 5342.0 | 21 |
| 5343.0 | 22 |
| 5344.0 | 21 |
| 5345.0 | 20 |
| 5346.0 | 21 |
| 5347.0 | 20 |
| 5348.0 | 21 |
| 5349.0 | 22 |
| 5350.0 | 21 |
| 5351.0 | 22 |
| 5352.0 | 23 |
| 5353.0 | 22 |
| 5354.0 | 21 |
| 5355.0 | 20 |
| 5356.0 | 19 |
| 5357.0 | 18 |
| 5358.0 | 19 |
| 5359.0 | 18 |
| 5360.0 | 19 |
| 5361.0 | 20 |
| 5362.0 | 19 |
| 5363.0 | 20 |
| 5364.0 | 21 |
| 5365.0 | 22 |
| 5366.0 | 23 |
| 5367.0 | 22 |
| 5368.0 | 21 |
| 5369.0 | 22 |
| 5370.0 | 21 |
| 5371.0 | 20 |
| 5372.0 | 19 |
| 5373.0 | 18 |
| 5374.0 | 17 |
| 5375.0 | 18 |
| 5376.0 | 17 |
| 5377.0 | 16 |
| 5378.0 | 15 |
| 5379.0 | 16 |
| 5380.0 | 15 |
| 5381.0 | 16 |
| 5382.0 | 17 |
| 5383.0 | 18 |
| 5384.0 | 19 |
| 5385.0 | 18 |
| 5386.0 | 19 |
| 5387.0 | 20 |
| 5388.0 | 21 |
| 5389.0 | 20 |
| 5390.0 | 21 |
| 5391.0 | 20 |
| 5392.0 | 19 |
| 5393.0 | 20 |
| 5394.0 | 19 |
| 5395.0 | 20 |
| 5396.0 | 19 |
| 5397.0 | 20 |
| 5398.0 | 19 |
| 5399.0 | 18 |
| 5400.0 | 17 |
| 5401.0 | 16 |
| 5402.0 | 17 |
| 5403.0 | 16 |
| 5404.0 | 17 |
| 5405.0 | 16 |
| 5406.0 | 15 |
| 5407.0 | 14 |
| 5408.0 | 13 |
| 5409.0 | 14 |
| 5410.0 | 15 |
| 5411.0 | 16 |
| 5412.0 | 15 |
| 5413.0 | 14 |
| 5414.0 | 15 |
| 5415.0 | 14 |
| 5416.0 | 13 |
| 5417.0 | 12 |
| 5418.0 | 11 |
| 5419.0 | 10 |
| 5420.0 | 9 |
| 5421.0 | 10 |
| 5422.0 | 11 |
| 5423.0 | 12 |
| 5424.0 | 11 |
| 5425.0 | 12 |
| 5426.0 | 11 |
| 5427.0 | 12 |
| 5428.0 | 13 |
| 5429.0 | 12 |
| 5430.0 | 13 |
| 5431.0 | 12 |
| 5432.0 | 13 |
| 5433.0 | 14 |
| 5434.0 | 15 |
| 5435.0 | 16 |
| 5436.0 | 17 |
| 5437.0 | 16 |
| 5438.0 | 17 |
| 5439.0 | 18 |
| 5440.0 | 19 |
| 5441.0 | 18 |
| 5442.0 | 19 |
| 5443.0 | 20 |
| 5444.0 | 19 |
| 5445.0 | 18 |
| 5446.0 | 19 |
| 5447.0 | 20 |
| 5448.0 | 19 |
| 5449.0 | 18 |
| 5450.0 | 19 |
| 5451.0 | 18 |
| 5452.0 | 17 |
| 5453.0 | 18 |
| 5454.0 | 17 |
| 5455.0 | 18 |
| 5456.0 | 19 |
| 5457.0 | 18 |
| 5458.0 | 19 |
| 5459.0 | 18 |
| 5460.0 | 17 |
| 5461.0 | 16 |
| 5462.0 | 15 |
| 5463.0 | 14 |
| 5464.0 | 13 |
| 5465.0 | 14 |
| 5466.0 | 15 |
| 5467.0 | 14 |
| 5468.0 | 15 |
| 5469.0 | 16 |
| 5470.0 | 17 |
| 5471.0 | 16 |
| 5472.0 | 15 |
| 5473.0 | 14 |
| 5474.0 | 13 |
| 5475.0 | 14 |
| 5476.0 | 13 |
| 5477.0 | 14 |
| 5478.0 | 15 |
| 5479.0 | 14 |
| 5480.0 | 15 |
| 5481.0 | 16 |
| 5482.0 | 15 |
| 5483.0 | 14 |
| 5484.0 | 15 |
| 5485.0 | 14 |
| 5486.0 | 15 |
| 5487.0 | 16 |
| 5488.0 | 17 |
| 5489.0 | 16 |
| 5490.0 | 15 |
| 5491.0 | 14 |
| 5492.0 | 13 |
| 5493.0 | 14 |
| 5494.0 | 15 |
| 5495.0 | 14 |
| 5496.0 | 13 |
| 5497.0 | 14 |
| 5498.0 | 13 |
| 5499.0 | 12 |
| 5500.0 | 11 |
| 5501.0 | 12 |
| 5502.0 | 11 |
| 5503.0 | 10 |
| 5504.0 | 11 |
| 5505.0 | 10 |
| 5506.0 | 9 |
| 5507.0 | 10 |
| 5508.0 | 9 |
| 5509.0 | 8 |
| 5510.0 | 7 |
| 5511.0 | 6 |
| 5512.0 | 5 |
| 5513.0 | 6 |
| 5514.0 | 7 |
| 5515.0 | 6 |
| 5516.0 | 7 |
| 5517.0 | 8 |
| 5518.0 | 9 |
| 5519.0 | 8 |
| 5520.0 | 9 |
| 5521.0 | 8 |
| 5522.0 | 9 |
| 5523.0 | 10 |
| 5524.0 | 9 |
| 5525.0 | 8 |
| 5526.0 | 9 |
| 5527.0 | 10 |
| 5528.0 | 9 |
| 5529.0 | 10 |
| 5530.0 | 11 |
| 5531.0 | 10 |
| 5532.0 | 9 |
| 5533.0 | 8 |
| 5534.0 | 7 |
| 5535.0 | 6 |
| 5536.0 | 7 |
| 5537.0 | 8 |
| 5538.0 | 9 |
| 5539.0 | 10 |
| 5540.0 | 9 |
| 5541.0 | 8 |
| 5542.0 | 7 |
| 5543.0 | 6 |
| 5544.0 | 5 |
| 5545.0 | 4 |
| 5546.0 | 5 |
| 5547.0 | 6 |
| 5548.0 | 5 |
| 5549.0 | 6 |
| 5550.0 | 5 |
| 5551.0 | 4 |
| 5552.0 | 3 |
| 5553.0 | 2 |
| 5554.0 | 1 |
| 5555.0 | 0 |
| 5556.0 | 1 |
| 5557.0 | 2 |
| 5558.0 | 3 |
| 5559.0 | 2 |
| 5560.0 | 1 |
| 5561.0 | 0 |
| 5562.0 | -1 |
| 5563.0 | -2 |
| 5564.0 | -1 |
| 5565.0 | -2 |
| 5566.0 | -1 |
| 5567.0 | 0 |
| 5568.0 | -1 |
| 5569.0 | -2 |
| 5570.0 | -1 |
| 5571.0 | -2 |
| 5572.0 | -1 |
| 5573.0 | 0 |
| 5574.0 | 1 |
| 5575.0 | 0 |
| 5576.0 | 1 |
| 5577.0 | 2 |
| 5578.0 | 1 |
| 5579.0 | 0 |
| 5580.0 | 1 |
| 5581.0 | 0 |
| 5582.0 | 1 |
| 5583.0 | 2 |
| 5584.0 | 3 |
| 5585.0 | 4 |
| 5586.0 | 3 |
| 5587.0 | 4 |
| 5588.0 | 3 |
| 5589.0 | 2 |
| 5590.0 | 3 |
| 5591.0 | 2 |
| 5592.0 | 3 |
| 5593.0 | 4 |
| 5594.0 | 3 |
| 5595.0 | 4 |
| 5596.0 | 5 |
| 5597.0 | 6 |
| 5598.0 | 5 |
| 5599.0 | 6 |
| 5600.0 | 7 |
| 5601.0 | 6 |
| 5602.0 | 5 |
| 5603.0 | 6 |
| 5604.0 | 7 |
| 5605.0 | 6 |
| 5606.0 | 5 |
| 5607.0 | 4 |
| 5608.0 | 3 |
| 5609.0 | 4 |
| 5610.0 | 5 |
| 5611.0 | 6 |
| 5612.0 | 5 |
| 5613.0 | 6 |
| 5614.0 | 5 |
| 5615.0 | 4 |
| 5616.0 | 3 |
| 5617.0 | 4 |
| 5618.0 | 5 |
| 5619.0 | 6 |
| 5620.0 | 7 |
| 5621.0 | 8 |
| 5622.0 | 9 |
| 5623.0 | 10 |
| 5624.0 | 9 |
| 5625.0 | 8 |
| 5626.0 | 9 |
| 5627.0 | 8 |
| 5628.0 | 9 |
| 5629.0 | 8 |
| 5630.0 | 9 |
| 5631.0 | 10 |
| 5632.0 | 9 |
| 5633.0 | 8 |
| 5634.0 | 7 |
| 5635.0 | 8 |
| 5636.0 | 7 |
| 5637.0 | 8 |
| 5638.0 | 9 |
| 5639.0 | 8 |
| 5640.0 | 9 |
| 5641.0 | 10 |
| 5642.0 | 9 |
| 5643.0 | 10 |
| 5644.0 | 9 |
| 5645.0 | 10 |
| 5646.0 | 11 |
| 5647.0 | 12 |
| 5648.0 | 13 |
| 5649.0 | 12 |
| 5650.0 | 11 |
| 5651.0 | 10 |
| 5652.0 | 11 |
| 5653.0 | 12 |
| 5654.0 | 13 |
| 5655.0 | 14 |
| 5656.0 | 13 |
| 5657.0 | 12 |
| 5658.0 | 13 |
| 5659.0 | 14 |
| 5660.0 | 15 |
| 5661.0 | 16 |
| 5662.0 | 15 |
| 5663.0 | 14 |
| 5664.0 | 13 |
| 5665.0 | 14 |
| 5666.0 | 15 |
| 5667.0 | 14 |
| 5668.0 | 13 |
| 5669.0 | 12 |
| 5670.0 | 11 |
| 5671.0 | 12 |
| 5672.0 | 11 |
| 5673.0 | 12 |
| 5674.0 | 11 |
| 5675.0 | 10 |
| 5676.0 | 9 |
| 5677.0 | 8 |
| 5678.0 | 9 |
| 5679.0 | 10 |
| 5680.0 | 11 |
| 5681.0 | 10 |
| 5682.0 | 11 |
| 5683.0 | 12 |
| 5684.0 | 13 |
| 5685.0 | 12 |
| 5686.0 | 13 |
| 5687.0 | 14 |
| 5688.0 | 15 |
| 5689.0 | 14 |
| 5690.0 | 15 |
| 5691.0 | 16 |
| 5692.0 | 15 |
| 5693.0 | 16 |
| 5694.0 | 15 |
| 5695.0 | 14 |
| 5696.0 | 13 |
| 5697.0 | 12 |
| 5698.0 | 11 |
| 5699.0 | 12 |
| 5700.0 | 13 |
| 5701.0 | 14 |
| 5702.0 | 15 |
| 5703.0 | 14 |
| 5704.0 | 13 |
| 5705.0 | 12 |
| 5706.0 | 11 |
| 5707.0 | 10 |
| 5708.0 | 11 |
| 5709.0 | 12 |
| 5710.0 | 11 |
| 5711.0 | 10 |
| 5712.0 | 11 |
| 5713.0 | 12 |
| 5714.0 | 11 |
| 5715.0 | 10 |
| 5716.0 | 9 |
| 5717.0 | 8 |
| 5718.0 | 9 |
| 5719.0 | 8 |
| 5720.0 | 7 |
| 5721.0 | 8 |
| 5722.0 | 7 |
| 5723.0 | 8 |
| 5724.0 | 7 |
| 5725.0 | 8 |
| 5726.0 | 7 |
| 5727.0 | 6 |
| 5728.0 | 5 |
| 5729.0 | 6 |
| 5730.0 | 5 |
| 5731.0 | 4 |
| 5732.0 | 5 |
| 5733.0 | 4 |
| 5734.0 | 5 |
| 5735.0 | 4 |
| 5736.0 | 3 |
| 5737.0 | 2 |
| 5738.0 | 1 |
| 5739.0 | 2 |
| 5740.0 | 3 |
| 5741.0 | 4 |
| 5742.0 | 3 |
| 5743.0 | 4 |
| 5744.0 | 5 |
| 5745.0 | 4 |
| 5746.0 | 5 |
| 5747.0 | 4 |
| 5748.0 | 5 |
| 5749.0 | 4 |
| 5750.0 | 3 |
| 5751.0 | 4 |
| 5752.0 | 3 |
| 5753.0 | 4 |
| 5754.0 | 3 |
| 5755.0 | 2 |
| 5756.0 | 3 |
| 5757.0 | 2 |
| 5758.0 | 1 |
| 5759.0 | 2 |
| 5760.0 | 3 |
| 5761.0 | 4 |
| 5762.0 | 5 |
| 5763.0 | 4 |
| 5764.0 | 5 |
| 5765.0 | 6 |
| 5766.0 | 7 |
| 5767.0 | 6 |
| 5768.0 | 5 |
| 5769.0 | 6 |
| 5770.0 | 7 |
| 5771.0 | 8 |
| 5772.0 | 9 |
| 5773.0 | 10 |
| 5774.0 | 9 |
| 5775.0 | 8 |
| 5776.0 | 9 |
| 5777.0 | 10 |
| 5778.0 | 9 |
| 5779.0 | 8 |
| 5780.0 | 7 |
| 5781.0 | 8 |
| 5782.0 | 7 |
| 5783.0 | 8 |
| 5784.0 | 9 |
| 5785.0 | 8 |
| 5786.0 | 7 |
| 5787.0 | 6 |
| 5788.0 | 7 |
| 5789.0 | 8 |
| 5790.0 | 9 |
| 5791.0 | 8 |
| 5792.0 | 7 |
| 5793.0 | 6 |
| 5794.0 | 7 |
| 5795.0 | 6 |
| 5796.0 | 7 |
| 5797.0 | 8 |
| 5798.0 | 7 |
| 5799.0 | 6 |
| 5800.0 | 5 |
| 5801.0 | 4 |
| 5802.0 | 5 |
| 5803.0 | 4 |
| 5804.0 | 3 |
| 5805.0 | 2 |
| 5806.0 | 3 |
| 5807.0 | 4 |
| 5808.0 | 5 |
| 5809.0 | 6 |
| 5810.0 | 7 |
| 5811.0 | 6 |
| 5812.0 | 7 |
| 5813.0 | 6 |
| 5814.0 | 5 |
| 5815.0 | 4 |
| 5816.0 | 3 |
| 5817.0 | 2 |
| 5818.0 | 3 |
| 5819.0 | 2 |
| 5820.0 | 3 |
| 5821.0 | 2 |
| 5822.0 | 3 |
| 5823.0 | 4 |
| 5824.0 | 3 |
| 5825.0 | 2 |
| 5826.0 | 1 |
| 5827.0 | 2 |
| 5828.0 | 1 |
| 5829.0 | 2 |
| 5830.0 | 1 |
| 5831.0 | 0 |
| 5832.0 | 1 |
| 5833.0 | 0 |
| 5834.0 | 1 |
| 5835.0 | 0 |
| 5836.0 | -1 |
| 5837.0 | -2 |
| 5838.0 | -3 |
| 5839.0 | -4 |
| 5840.0 | -5 |
| 5841.0 | -6 |
| 5842.0 | -5 |
| 5843.0 | -4 |
| 5844.0 | -3 |
| 5845.0 | -4 |
| 5846.0 | -3 |
| 5847.0 | -4 |
| 5848.0 | -3 |
| 5849.0 | -4 |
| 5850.0 | -5 |
| 5851.0 | -4 |
| 5852.0 | -5 |
| 5853.0 | -6 |
| 5854.0 | -7 |
| 5855.0 | -8 |
| 5856.0 | -7 |
| 5857.0 | -6 |
| 5858.0 | -5 |
| 5859.0 | -4 |
| 5860.0 | -3 |
| 5861.0 | -4 |
| 5862.0 | -3 |
| 5863.0 | -2 |
| 5864.0 | -3 |
| 5865.0 | -2 |
| 5866.0 | -3 |
| 5867.0 | -4 |
| 5868.0 | -3 |
| 5869.0 | -4 |
| 5870.0 | -5 |
| 5871.0 | -4 |
| 5872.0 | -3 |
| 5873.0 | -2 |
| 5874.0 | -1 |
| 5875.0 | -2 |
| 5876.0 | -3 |
| 5877.0 | -2 |
| 5878.0 | -3 |
| 5879.0 | -4 |
| 5880.0 | -5 |
| 5881.0 | -4 |
| 5882.0 | -3 |
| 5883.0 | -4 |
| 5884.0 | -3 |
| 5885.0 | -4 |
| 5886.0 | -5 |
| 5887.0 | -4 |
| 5888.0 | -5 |
| 5889.0 | -6 |
| 5890.0 | -7 |
| 5891.0 | -8 |
| 5892.0 | -7 |
| 5893.0 | -8 |
| 5894.0 | -9 |
| 5895.0 | -10 |
| 5896.0 | -11 |
| 5897.0 | -10 |
| 5898.0 | -11 |
| 5899.0 | -10 |
| 5900.0 | -9 |
| 5901.0 | -8 |
| 5902.0 | -7 |
| 5903.0 | -8 |
| 5904.0 | -7 |
| 5905.0 | -8 |
| 5906.0 | -7 |
| 5907.0 | -6 |
| 5908.0 | -5 |
| 5909.0 | -6 |
| 5910.0 | -7 |
| 5911.0 | -8 |
| 5912.0 | -9 |
| 5913.0 | -10 |
| 5914.0 | -11 |
| 5915.0 | -10 |
| 5916.0 | -11 |
| 5917.0 | -10 |
| 5918.0 | -11 |
| 5919.0 | -10 |
| 5920.0 | -11 |
| 5921.0 | -10 |
| 5922.0 | -11 |
| 5923.0 | -12 |
| 5924.0 | -13 |
| 5925.0 | -12 |
| 5926.0 | -11 |
| 5927.0 | -12 |
| 5928.0 | -11 |
| 5929.0 | -12 |
| 5930.0 | -13 |
| 5931.0 | -12 |
| 5932.0 | -11 |
| 5933.0 | -12 |
| 5934.0 | -13 |
| 5935.0 | -14 |
| 5936.0 | -13 |
| 5937.0 | -12 |
| 5938.0 | -13 |
| 5939.0 | -12 |
| 5940.0 | -13 |
| 5941.0 | -12 |
| 5942.0 | -13 |
| 5943.0 | -12 |
| 5944.0 | -11 |
| 5945.0 | -12 |
| 5946.0 | -13 |
| 5947.0 | -12 |
| 5948.0 | -11 |
| 5949.0 | -10 |
| 5950.0 | -11 |
| 5951.0 | -12 |
| 5952.0 | -13 |
| 5953.0 | -12 |
| 5954.0 | -11 |
| 5955.0 | -10 |
| 5956.0 | -11 |
| 5957.0 | -10 |
| 5958.0 | -9 |
| 5959.0 | -10 |
| 5960.0 | -9 |
| 5961.0 | -10 |
| 5962.0 | -9 |
| 5963.0 | -10 |
| 5964.0 | -9 |
| 5965.0 | -10 |
| 5966.0 | -9 |
| 5967.0 | -10 |
| 5968.0 | -9 |
| 5969.0 | -10 |
| 5970.0 | -11 |
| 5971.0 | -12 |
| 5972.0 | -11 |
| 5973.0 | -10 |
| 5974.0 | -11 |
| 5975.0 | -12 |
| 5976.0 | -11 |
| 5977.0 | -12 |
| 5978.0 | -13 |
| 5979.0 | -12 |
| 5980.0 | -11 |
| 5981.0 | -10 |
| 5982.0 | -9 |
| 5983.0 | -8 |
| 5984.0 | -9 |
| 5985.0 | -8 |
| 5986.0 | -9 |
| 5987.0 | -10 |
| 5988.0 | -11 |
| 5989.0 | -12 |
| 5990.0 | -13 |
| 5991.0 | -12 |
| 5992.0 | -13 |
| 5993.0 | -12 |
| 5994.0 | -13 |
| 5995.0 | -12 |
| 5996.0 | -13 |
| 5997.0 | -12 |
| 5998.0 | -13 |
| 5999.0 | -12 |
| 6000.0 | -13 |
| 6001.0 | -12 |
| 6002.0 | -11 |
| 6003.0 | -10 |
| 6004.0 | -11 |
| 6005.0 | -10 |
| 6006.0 | -9 |
| 6007.0 | -10 |
| 6008.0 | -9 |
| 6009.0 | -8 |
| 6010.0 | -7 |
| 6011.0 | -6 |
| 6012.0 | -7 |
| 6013.0 | -8 |
| 6014.0 | -7 |
| 6015.0 | -6 |
| 6016.0 | -7 |
| 6017.0 | -6 |
| 6018.0 | -5 |
| 6019.0 | -4 |
| 6020.0 | -5 |
| 6021.0 | -6 |
| 6022.0 | -7 |
| 6023.0 | -8 |
| 6024.0 | -9 |
| 6025.0 | -10 |
| 6026.0 | -9 |
| 6027.0 | -8 |
| 6028.0 | -7 |
| 6029.0 | -8 |
| 6030.0 | -9 |
| 6031.0 | -10 |
| 6032.0 | -11 |
| 6033.0 | -10 |
| 6034.0 | -11 |
| 6035.0 | -10 |
| 6036.0 | -9 |
| 6037.0 | -10 |
| 6038.0 | -11 |
| 6039.0 | -10 |
| 6040.0 | -11 |
| 6041.0 | -12 |
| 6042.0 | -11 |
| 6043.0 | -10 |
| 6044.0 | -9 |
| 6045.0 | -8 |
| 6046.0 | -9 |
| 6047.0 | -8 |
| 6048.0 | -7 |
| 6049.0 | -8 |
| 6050.0 | -9 |
| 6051.0 | -10 |
| 6052.0 | -9 |
| 6053.0 | -8 |
| 6054.0 | -7 |
| 6055.0 | -8 |
| 6056.0 | -9 |
| 6057.0 | -8 |
| 6058.0 | -9 |
| 6059.0 | -8 |
| 6060.0 | -7 |
| 6061.0 | -6 |
| 6062.0 | -7 |
| 6063.0 | -8 |
| 6064.0 | -7 |
| 6065.0 | -8 |
| 6066.0 | -9 |
| 6067.0 | -8 |
| 6068.0 | -9 |
| 6069.0 | -10 |
| 6070.0 | -9 |
| 6071.0 | -8 |
| 6072.0 | -7 |
| 6073.0 | -8 |
| 6074.0 | -9 |
| 6075.0 | -10 |
| 6076.0 | -9 |
| 6077.0 | -8 |
| 6078.0 | -7 |
| 6079.0 | -6 |
| 6080.0 | -5 |
| 6081.0 | -6 |
| 6082.0 | -7 |
| 6083.0 | -8 |
| 6084.0 | -7 |
| 6085.0 | -8 |
| 6086.0 | -9 |
| 6087.0 | -8 |
| 6088.0 | -9 |
| 6089.0 | -10 |
| 6090.0 | -11 |
| 6091.0 | -10 |
| 6092.0 | -9 |
| 6093.0 | -8 |
| 6094.0 | -7 |
| 6095.0 | -6 |
| 6096.0 | -5 |
| 6097.0 | -4 |
| 6098.0 | -5 |
| 6099.0 | -6 |
| 6100.0 | -7 |
| 6101.0 | -6 |
| 6102.0 | -7 |
| 6103.0 | -8 |
| 6104.0 | -7 |
| 6105.0 | -6 |
| 6106.0 | -7 |
| 6107.0 | -6 |
| 6108.0 | -5 |
| 6109.0 | -6 |
| 6110.0 | -7 |
| 6111.0 | -8 |
| 6112.0 | -9 |
| 6113.0 | -8 |
| 6114.0 | -7 |
| 6115.0 | -8 |
| 6116.0 | -7 |
| 6117.0 | -8 |
| 6118.0 | -7 |
| 6119.0 | -6 |
| 6120.0 | -7 |
| 6121.0 | -6 |
| 6122.0 | -5 |
| 6123.0 | -4 |
| 6124.0 | -3 |
| 6125.0 | -2 |
| 6126.0 | -1 |
| 6127.0 | -2 |
| 6128.0 | -1 |
| 6129.0 | -2 |
| 6130.0 | -1 |
| 6131.0 | 0 |
| 6132.0 | -1 |
| 6133.0 | -2 |
| 6134.0 | -3 |
| 6135.0 | -2 |
| 6136.0 | -3 |
| 6137.0 | -2 |
| 6138.0 | -3 |
| 6139.0 | -4 |
| 6140.0 | -5 |
| 6141.0 | -6 |
| 6142.0 | -7 |
| 6143.0 | -6 |
| 6144.0 | -7 |
| 6145.0 | -8 |
| 6146.0 | -9 |
| 6147.0 | -10 |
| 6148.0 | -9 |
| 6149.0 | -10 |
| 6150.0 | -9 |
| 6151.0 | -8 |
| 6152.0 | -7 |
| 6153.0 | -8 |
| 6154.0 | -7 |
| 6155.0 | -6 |
| 6156.0 | -5 |
| 6157.0 | -6 |
| 6158.0 | -5 |
| 6159.0 | -6 |
| 6160.0 | -7 |
| 6161.0 | -6 |
| 6162.0 | -5 |
| 6163.0 | -6 |
| 6164.0 | -7 |
| 6165.0 | -8 |
| 6166.0 | -9 |
| 6167.0 | -8 |
| 6168.0 | -7 |
| 6169.0 | -8 |
| 6170.0 | -9 |
| 6171.0 | -8 |
| 6172.0 | -9 |
| 6173.0 | -8 |
| 6174.0 | -7 |
| 6175.0 | -8 |
| 6176.0 | -9 |
| 6177.0 | -8 |
| 6178.0 | -9 |
| 6179.0 | -10 |
| 6180.0 | -9 |
| 6181.0 | -10 |
| 6182.0 | -11 |
| 6183.0 | -10 |
| 6184.0 | -9 |
| 6185.0 | -8 |
| 6186.0 | -7 |
| 6187.0 | -6 |
| 6188.0 | -5 |
| 6189.0 | -6 |
| 6190.0 | -7 |
| 6191.0 | -6 |
| 6192.0 | -5 |
| 6193.0 | -6 |
| 6194.0 | -5 |
| 6195.0 | -4 |
| 6196.0 | -3 |
| 6197.0 | -4 |
| 6198.0 | -5 |
| 6199.0 | -6 |
| 6200.0 | -7 |
| 6201.0 | -6 |
| 6202.0 | -5 |
| 6203.0 | -4 |
| 6204.0 | -3 |
| 6205.0 | -2 |
| 6206.0 | -3 |
| 6207.0 | -2 |
| 6208.0 | -1 |
| 6209.0 | -2 |
| 6210.0 | -3 |
| 6211.0 | -2 |
| 6212.0 | -1 |
| 6213.0 | 0 |
| 6214.0 | 1 |
| 6215.0 | 2 |
| 6216.0 | 3 |
| 6217.0 | 4 |
| 6218.0 | 5 |
| 6219.0 | 6 |
| 6220.0 | 5 |
| 6221.0 | 4 |
| 6222.0 | 3 |
| 6223.0 | 2 |
| 6224.0 | 1 |
| 6225.0 | 2 |
| 6226.0 | 3 |
| 6227.0 | 4 |
| 6228.0 | 3 |
| 6229.0 | 4 |
| 6230.0 | 3 |
| 6231.0 | 2 |
| 6232.0 | 3 |
| 6233.0 | 2 |
| 6234.0 | 3 |
| 6235.0 | 2 |
| 6236.0 | 1 |
| 6237.0 | 2 |
| 6238.0 | 1 |
| 6239.0 | 0 |
| 6240.0 | 1 |
| 6241.0 | 0 |
| 6242.0 | -1 |
| 6243.0 | 0 |
| 6244.0 | 1 |
| 6245.0 | 0 |
| 6246.0 | -1 |
| 6247.0 | -2 |
| 6248.0 | -1 |
| 6249.0 | -2 |
| 6250.0 | -1 |
| 6251.0 | 0 |
| 6252.0 | 1 |
| 6253.0 | 0 |
| 6254.0 | -1 |
| 6255.0 | 0 |
| 6256.0 | 1 |
| 6257.0 | 2 |
| 6258.0 | 3 |
| 6259.0 | 2 |
| 6260.0 | 1 |
| 6261.0 | 2 |
| 6262.0 | 3 |
| 6263.0 | 4 |
| 6264.0 | 5 |
| 6265.0 | 6 |
| 6266.0 | 7 |
| 6267.0 | 6 |
| 6268.0 | 7 |
| 6269.0 | 6 |
| 6270.0 | 7 |
| 6271.0 | 6 |
| 6272.0 | 7 |
| 6273.0 | 8 |
| 6274.0 | 7 |
| 6275.0 | 6 |
| 6276.0 | 7 |
| 6277.0 | 8 |
| 6278.0 | 7 |
| 6279.0 | 8 |
| 6280.0 | 7 |
| 6281.0 | 6 |
| 6282.0 | 5 |
| 6283.0 | 4 |
| 6284.0 | 5 |
| 6285.0 | 6 |
| 6286.0 | 5 |
| 6287.0 | 6 |
| 6288.0 | 7 |
| 6289.0 | 6 |
| 6290.0 | 7 |
| 6291.0 | 8 |
| 6292.0 | 9 |
| 6293.0 | 8 |
| 6294.0 | 9 |
| 6295.0 | 8 |
| 6296.0 | 7 |
| 6297.0 | 8 |
| 6298.0 | 7 |
| 6299.0 | 8 |
| 6300.0 | 7 |
| 6301.0 | 8 |
| 6302.0 | 7 |
| 6303.0 | 8 |
| 6304.0 | 7 |
| 6305.0 | 6 |
| 6306.0 | 7 |
| 6307.0 | 8 |
| 6308.0 | 9 |
| 6309.0 | 8 |
| 6310.0 | 7 |
| 6311.0 | 8 |
| 6312.0 | 7 |
| 6313.0 | 8 |
| 6314.0 | 7 |
| 6315.0 | 6 |
| 6316.0 | 7 |
| 6317.0 | 8 |
| 6318.0 | 7 |
| 6319.0 | 6 |
| 6320.0 | 5 |
| 6321.0 | 4 |
| 6322.0 | 3 |
| 6323.0 | 2 |
| 6324.0 | 3 |
| 6325.0 | 2 |
| 6326.0 | 3 |
| 6327.0 | 2 |
| 6328.0 | 1 |
| 6329.0 | 0 |
| 6330.0 | -1 |
| 6331.0 | 0 |
| 6332.0 | 1 |
| 6333.0 | 0 |
| 6334.0 | -1 |
| 6335.0 | 0 |
| 6336.0 | 1 |
| 6337.0 | 0 |
| 6338.0 | 1 |
| 6339.0 | 0 |
| 6340.0 | -1 |
| 6341.0 | -2 |
| 6342.0 | -1 |
| 6343.0 | 0 |
| 6344.0 | 1 |
| 6345.0 | 2 |
| 6346.0 | 3 |
| 6347.0 | 2 |
| 6348.0 | 3 |
| 6349.0 | 2 |
| 6350.0 | 1 |
| 6351.0 | 2 |
| 6352.0 | 1 |
| 6353.0 | 0 |
| 6354.0 | 1 |
| 6355.0 | 2 |
| 6356.0 | 3 |
| 6357.0 | 2 |
| 6358.0 | 3 |
| 6359.0 | 4 |
| 6360.0 | 5 |
| 6361.0 | 6 |
| 6362.0 | 5 |
| 6363.0 | 6 |
| 6364.0 | 7 |
| 6365.0 | 8 |
| 6366.0 | 9 |
| 6367.0 | 10 |
| 6368.0 | 11 |
| 6369.0 | 10 |
| 6370.0 | 11 |
| 6371.0 | 12 |
| 6372.0 | 13 |
| 6373.0 | 14 |
| 6374.0 | 15 |
| 6375.0 | 16 |
| 6376.0 | 15 |
| 6377.0 | 14 |
| 6378.0 | 15 |
| 6379.0 | 16 |
| 6380.0 | 17 |
| 6381.0 | 16 |
| 6382.0 | 15 |
| 6383.0 | 16 |
| 6384.0 | 17 |
| 6385.0 | 18 |
| 6386.0 | 17 |
| 6387.0 | 16 |
| 6388.0 | 15 |
| 6389.0 | 16 |
| 6390.0 | 15 |
| 6391.0 | 14 |
| 6392.0 | 13 |
| 6393.0 | 12 |
| 6394.0 | 11 |
| 6395.0 | 10 |
| 6396.0 | 11 |
| 6397.0 | 12 |
| 6398.0 | 11 |
| 6399.0 | 12 |
| 6400.0 | 11 |
| 6401.0 | 10 |
| 6402.0 | 11 |
| 6403.0 | 12 |
| 6404.0 | 13 |
| 6405.0 | 12 |
| 6406.0 | 13 |
| 6407.0 | 14 |
| 6408.0 | 13 |
| 6409.0 | 12 |
| 6410.0 | 11 |
| 6411.0 | 10 |
| 6412.0 | 11 |
| 6413.0 | 10 |
| 6414.0 | 11 |
| 6415.0 | 12 |
| 6416.0 | 11 |
| 6417.0 | 10 |
| 6418.0 | 9 |
| 6419.0 | 10 |
| 6420.0 | 11 |
| 6421.0 | 10 |
| 6422.0 | 9 |
| 6423.0 | 8 |
| 6424.0 | 9 |
| 6425.0 | 10 |
| 6426.0 | 11 |
| 6427.0 | 12 |
| 6428.0 | 13 |
| 6429.0 | 12 |
| 6430.0 | 11 |
| 6431.0 | 10 |
| 6432.0 | 11 |
| 6433.0 | 12 |
| 6434.0 | 13 |
| 6435.0 | 12 |
| 6436.0 | 13 |
| 6437.0 | 14 |
| 6438.0 | 15 |
| 6439.0 | 16 |
| 6440.0 | 15 |
| 6441.0 | 16 |
| 6442.0 | 15 |
| 6443.0 | 14 |
| 6444.0 | 15 |
| 6445.0 | 16 |
| 6446.0 | 17 |
| 6447.0 | 16 |
| 6448.0 | 15 |
| 6449.0 | 16 |
| 6450.0 | 17 |
| 6451.0 | 16 |
| 6452.0 | 17 |
| 6453.0 | 16 |
| 6454.0 | 17 |
| 6455.0 | 16 |
| 6456.0 | 15 |
| 6457.0 | 14 |
| 6458.0 | 15 |
| 6459.0 | 14 |
| 6460.0 | 15 |
| 6461.0 | 16 |
| 6462.0 | 17 |
| 6463.0 | 18 |
| 6464.0 | 19 |
| 6465.0 | 18 |
| 6466.0 | 17 |
| 6467.0 | 16 |
| 6468.0 | 15 |
| 6469.0 | 16 |
| 6470.0 | 15 |
| 6471.0 | 14 |
| 6472.0 | 15 |
| 6473.0 | 14 |
| 6474.0 | 15 |
| 6475.0 | 14 |
| 6476.0 | 15 |
| 6477.0 | 16 |
| 6478.0 | 15 |
| 6479.0 | 16 |
| 6480.0 | 15 |
| 6481.0 | 16 |
| 6482.0 | 17 |
| 6483.0 | 16 |
| 6484.0 | 15 |
| 6485.0 | 14 |
| 6486.0 | 15 |
| 6487.0 | 14 |
| 6488.0 | 15 |
| 6489.0 | 14 |
| 6490.0 | 15 |
| 6491.0 | 14 |
| 6492.0 | 15 |
| 6493.0 | 16 |
| 6494.0 | 15 |
| 6495.0 | 14 |
| 6496.0 | 13 |
| 6497.0 | 14 |
| 6498.0 | 15 |
| 6499.0 | 16 |
| 6500.0 | 15 |
| 6501.0 | 16 |
| 6502.0 | 17 |
| 6503.0 | 18 |
| 6504.0 | 19 |
| 6505.0 | 18 |
| 6506.0 | 19 |
| 6507.0 | 18 |
| 6508.0 | 17 |
| 6509.0 | 16 |
| 6510.0 | 15 |
| 6511.0 | 16 |
| 6512.0 | 15 |
| 6513.0 | 14 |
| 6514.0 | 15 |
| 6515.0 | 16 |
| 6516.0 | 15 |
| 6517.0 | 14 |
| 6518.0 | 15 |
| 6519.0 | 16 |
| 6520.0 | 17 |
| 6521.0 | 18 |
| 6522.0 | 19 |
| 6523.0 | 20 |
| 6524.0 | 19 |
| 6525.0 | 20 |
| 6526.0 | 19 |
| 6527.0 | 18 |
| 6528.0 | 17 |
| 6529.0 | 18 |
| 6530.0 | 17 |
| 6531.0 | 16 |
| 6532.0 | 15 |
| 6533.0 | 14 |
| 6534.0 | 15 |
| 6535.0 | 16 |
| 6536.0 | 17 |
| 6537.0 | 18 |
| 6538.0 | 19 |
| 6539.0 | 18 |
| 6540.0 | 17 |
| 6541.0 | 16 |
| 6542.0 | 17 |
| 6543.0 | 18 |
| 6544.0 | 17 |
| 6545.0 | 18 |
| 6546.0 | 17 |
| 6547.0 | 18 |
| 6548.0 | 17 |
| 6549.0 | 18 |
| 6550.0 | 19 |
| 6551.0 | 18 |
| 6552.0 | 17 |
| 6553.0 | 16 |
| 6554.0 | 17 |
| 6555.0 | 16 |
| 6556.0 | 15 |
| 6557.0 | 14 |
| 6558.0 | 13 |
| 6559.0 | 14 |
| 6560.0 | 15 |
| 6561.0 | 14 |
| 6562.0 | 15 |
| 6563.0 | 14 |
| 6564.0 | 13 |
| 6565.0 | 14 |
| 6566.0 | 15 |
| 6567.0 | 16 |
| 6568.0 | 15 |
| 6569.0 | 16 |
| 6570.0 | 15 |
| 6571.0 | 16 |
| 6572.0 | 17 |
| 6573.0 | 18 |
| 6574.0 | 17 |
| 6575.0 | 18 |
| 6576.0 | 19 |
| 6577.0 | 20 |
| 6578.0 | 19 |
| 6579.0 | 18 |
| 6580.0 | 19 |
| 6581.0 | 18 |
| 6582.0 | 17 |
| 6583.0 | 18 |
| 6584.0 | 19 |
| 6585.0 | 20 |
| 6586.0 | 21 |
| 6587.0 | 22 |
| 6588.0 | 21 |
| 6589.0 | 20 |
| 6590.0 | 19 |
| 6591.0 | 20 |
| 6592.0 | 21 |
| 6593.0 | 20 |
| 6594.0 | 21 |
| 6595.0 | 20 |
| 6596.0 | 19 |
| 6597.0 | 18 |
| 6598.0 | 17 |
| 6599.0 | 16 |
| 6600.0 | 17 |
| 6601.0 | 16 |
| 6602.0 | 15 |
| 6603.0 | 14 |
| 6604.0 | 15 |
| 6605.0 | 16 |
| 6606.0 | 17 |
| 6607.0 | 16 |
| 6608.0 | 15 |
| 6609.0 | 16 |
| 6610.0 | 15 |
| 6611.0 | 16 |
| 6612.0 | 15 |
| 6613.0 | 16 |
| 6614.0 | 17 |
| 6615.0 | 18 |
| 6616.0 | 17 |
| 6617.0 | 18 |
| 6618.0 | 19 |
| 6619.0 | 18 |
| 6620.0 | 19 |
| 6621.0 | 20 |
| 6622.0 | 19 |
| 6623.0 | 20 |
| 6624.0 | 21 |
| 6625.0 | 22 |
| 6626.0 | 23 |
| 6627.0 | 24 |
| 6628.0 | 25 |
| 6629.0 | 26 |
| 6630.0 | 25 |
| 6631.0 | 24 |
| 6632.0 | 25 |
| 6633.0 | 26 |
| 6634.0 | 25 |
| 6635.0 | 26 |
| 6636.0 | 25 |
| 6637.0 | 26 |
| 6638.0 | 27 |
| 6639.0 | 28 |
| 6640.0 | 29 |
| 6641.0 | 30 |
| 6642.0 | 29 |
| 6643.0 | 28 |
| 6644.0 | 29 |
| 6645.0 | 28 |
| 6646.0 | 29 |
| 6647.0 | 30 |
| 6648.0 | 29 |
| 6649.0 | 30 |
| 6650.0 | 29 |
| 6651.0 | 30 |
| 6652.0 | 29 |
| 6653.0 | 28 |
| 6654.0 | 29 |
| 6655.0 | 28 |
| 6656.0 | 27 |
| 6657.0 | 26 |
| 6658.0 | 25 |
| 6659.0 | 26 |
| 6660.0 | 25 |
| 6661.0 | 24 |
| 6662.0 | 25 |
| 6663.0 | 24 |
| 6664.0 | 23 |
| 6665.0 | 24 |
| 6666.0 | 25 |
| 6667.0 | 24 |
| 6668.0 | 23 |
| 6669.0 | 24 |
| 6670.0 | 25 |
| 6671.0 | 24 |
| 6672.0 | 25 |
| 6673.0 | 26 |
| 6674.0 | 27 |
| 6675.0 | 26 |
| 6676.0 | 25 |
| 6677.0 | 24 |
| 6678.0 | 25 |
| 6679.0 | 24 |
| 6680.0 | 25 |
| 6681.0 | 26 |
| 6682.0 | 27 |
| 6683.0 | 26 |
| 6684.0 | 25 |
| 6685.0 | 24 |
| 6686.0 | 25 |
| 6687.0 | 26 |
| 6688.0 | 27 |
| 6689.0 | 26 |
| 6690.0 | 27 |
| 6691.0 | 28 |
| 6692.0 | 27 |
| 6693.0 | 26 |
| 6694.0 | 27 |
| 6695.0 | 28 |
| 6696.0 | 29 |
| 6697.0 | 28 |
| 6698.0 | 27 |
| 6699.0 | 26 |
| 6700.0 | 27 |
| 6701.0 | 26 |
| 6702.0 | 27 |
| 6703.0 | 26 |
| 6704.0 | 27 |
| 6705.0 | 28 |
| 6706.0 | 27 |
| 6707.0 | 28 |
| 6708.0 | 27 |
| 6709.0 | 28 |
| 6710.0 | 27 |
| 6711.0 | 26 |
| 6712.0 | 25 |
| 6713.0 | 26 |
| 6714.0 | 27 |
| 6715.0 | 26 |
| 6716.0 | 25 |
| 6717.0 | 24 |
| 6718.0 | 25 |
| 6719.0 | 26 |
| 6720.0 | 27 |
| 6721.0 | 26 |
| 6722.0 | 25 |
| 6723.0 | 24 |
| 6724.0 | 23 |
| 6725.0 | 22 |
| 6726.0 | 21 |
| 6727.0 | 22 |
| 6728.0 | 23 |
| 6729.0 | 22 |
| 6730.0 | 21 |
| 6731.0 | 22 |
| 6732.0 | 23 |
| 6733.0 | 24 |
| 6734.0 | 25 |
| 6735.0 | 26 |
| 6736.0 | 25 |
| 6737.0 | 24 |
| 6738.0 | 25 |
| 6739.0 | 24 |
| 6740.0 | 23 |
| 6741.0 | 24 |
| 6742.0 | 25 |
| 6743.0 | 24 |
| 6744.0 | 25 |
| 6745.0 | 26 |
| 6746.0 | 25 |
| 6747.0 | 24 |
| 6748.0 | 23 |
| 6749.0 | 24 |
| 6750.0 | 23 |
| 6751.0 | 24 |
| 6752.0 | 23 |
| 6753.0 | 24 |
| 6754.0 | 25 |
| 6755.0 | 24 |
| 6756.0 | 25 |
| 6757.0 | 24 |
| 6758.0 | 25 |
| 6759.0 | 26 |
| 6760.0 | 25 |
| 6761.0 | 24 |
| 6762.0 | 25 |
| 6763.0 | 26 |
| 6764.0 | 27 |
| 6765.0 | 28 |
| 6766.0 | 27 |
| 6767.0 | 26 |
| 6768.0 | 25 |
| 6769.0 | 24 |
| 6770.0 | 23 |
| 6771.0 | 24 |
| 6772.0 | 23 |
| 6773.0 | 24 |
| 6774.0 | 23 |
| 6775.0 | 24 |
| 6776.0 | 23 |
| 6777.0 | 22 |
| 6778.0 | 21 |
| 6779.0 | 20 |
| 6780.0 | 19 |
| 6781.0 | 20 |
| 6782.0 | 19 |
| 6783.0 | 18 |
| 6784.0 | 19 |
| 6785.0 | 18 |
| 6786.0 | 17 |
| 6787.0 | 18 |
| 6788.0 | 19 |
| 6789.0 | 20 |
| 6790.0 | 19 |
| 6791.0 | 18 |
| 6792.0 | 19 |
| 6793.0 | 20 |
| 6794.0 | 21 |
| 6795.0 | 22 |
| 6796.0 | 23 |
| 6797.0 | 24 |
| 6798.0 | 25 |
| 6799.0 | 26 |
| 6800.0 | 25 |
| 6801.0 | 24 |
| 6802.0 | 23 |
| 6803.0 | 22 |
| 6804.0 | 23 |
| 6805.0 | 22 |
| 6806.0 | 23 |
| 6807.0 | 22 |
| 6808.0 | 21 |
| 6809.0 | 22 |
| 6810.0 | 23 |
| 6811.0 | 24 |
| 6812.0 | 23 |
| 6813.0 | 22 |
| 6814.0 | 23 |
| 6815.0 | 24 |
| 6816.0 | 25 |
| 6817.0 | 26 |
| 6818.0 | 25 |
| 6819.0 | 26 |
| 6820.0 | 25 |
| 6821.0 | 26 |
| 6822.0 | 27 |
| 6823.0 | 28 |
| 6824.0 | 29 |
| 6825.0 | 30 |
| 6826.0 | 31 |
| 6827.0 | 32 |
| 6828.0 | 33 |
| 6829.0 | 32 |
| 6830.0 | 33 |
| 6831.0 | 32 |
| 6832.0 | 33 |
| 6833.0 | 34 |
| 6834.0 | 35 |
| 6835.0 | 36 |
| 6836.0 | 37 |
| 6837.0 | 38 |
| 6838.0 | 39 |
| 6839.0 | 40 |
| 6840.0 | 41 |
| 6841.0 | 42 |
| 6842.0 | 43 |
| 6843.0 | 44 |
| 6844.0 | 45 |
| 6845.0 | 46 |
| 6846.0 | 47 |
| 6847.0 | 46 |
| 6848.0 | 45 |
| 6849.0 | 46 |
| 6850.0 | 47 |
| 6851.0 | 48 |
| 6852.0 | 49 |
| 6853.0 | 50 |
| 6854.0 | 51 |
| 6855.0 | 52 |
| 6856.0 | 53 |
| 6857.0 | 52 |
| 6858.0 | 51 |
| 6859.0 | 50 |
| 6860.0 | 51 |
| 6861.0 | 50 |
| 6862.0 | 51 |
| 6863.0 | 52 |
| 6864.0 | 51 |
| 6865.0 | 52 |
| 6866.0 | 53 |
| 6867.0 | 54 |
| 6868.0 | 55 |
| 6869.0 | 56 |
| 6870.0 | 55 |
| 6871.0 | 56 |
| 6872.0 | 55 |
| 6873.0 | 56 |
| 6874.0 | 55 |
| 6875.0 | 54 |
| 6876.0 | 55 |
| 6877.0 | 54 |
| 6878.0 | 53 |
| 6879.0 | 52 |
| 6880.0 | 53 |
| 6881.0 | 52 |
| 6882.0 | 53 |
| 6883.0 | 52 |
| 6884.0 | 51 |
| 6885.0 | 50 |
| 6886.0 | 51 |
| 6887.0 | 52 |
| 6888.0 | 53 |
| 6889.0 | 54 |
| 6890.0 | 55 |
| 6891.0 | 56 |
| 6892.0 | 57 |
| 6893.0 | 58 |
| 6894.0 | 59 |
| 6895.0 | 60 |
| 6896.0 | 59 |
| 6897.0 | 60 |
| 6898.0 | 59 |
| 6899.0 | 60 |
| 6900.0 | 61 |
| 6901.0 | 62 |
| 6902.0 | 61 |
| 6903.0 | 60 |
| 6904.0 | 61 |
| 6905.0 | 60 |
| 6906.0 | 59 |
| 6907.0 | 60 |
| 6908.0 | 59 |
| 6909.0 | 58 |
| 6910.0 | 57 |
| 6911.0 | 56 |
| 6912.0 | 55 |
| 6913.0 | 56 |
| 6914.0 | 57 |
| 6915.0 | 56 |
| 6916.0 | 55 |
| 6917.0 | 54 |
| 6918.0 | 55 |
| 6919.0 | 56 |
| 6920.0 | 55 |
| 6921.0 | 54 |
| 6922.0 | 53 |
| 6923.0 | 52 |
| 6924.0 | 53 |
| 6925.0 | 52 |
| 6926.0 | 53 |
| 6927.0 | 52 |
| 6928.0 | 51 |
| 6929.0 | 52 |
| 6930.0 | 51 |
| 6931.0 | 50 |
| 6932.0 | 49 |
| 6933.0 | 50 |
| 6934.0 | 51 |
| 6935.0 | 50 |
| 6936.0 | 51 |
| 6937.0 | 50 |
| 6938.0 | 49 |
| 6939.0 | 50 |
| 6940.0 | 51 |
| 6941.0 | 50 |
| 6942.0 | 49 |
| 6943.0 | 48 |
| 6944.0 | 49 |
| 6945.0 | 48 |
| 6946.0 | 49 |
| 6947.0 | 48 |
| 6948.0 | 47 |
| 6949.0 | 46 |
| 6950.0 | 45 |
| 6951.0 | 44 |
| 6952.0 | 43 |
| 6953.0 | 42 |
| 6954.0 | 41 |
| 6955.0 | 40 |
| 6956.0 | 41 |
| 6957.0 | 42 |
| 6958.0 | 43 |
| 6959.0 | 44 |
| 6960.0 | 43 |
| 6961.0 | 44 |
| 6962.0 | 43 |
| 6963.0 | 42 |
| 6964.0 | 41 |
| 6965.0 | 42 |
| 6966.0 | 41 |
| 6967.0 | 42 |
| 6968.0 | 41 |
| 6969.0 | 42 |
| 6970.0 | 43 |
| 6971.0 | 44 |
| 6972.0 | 43 |
| 6973.0 | 42 |
| 6974.0 | 43 |
| 6975.0 | 42 |
| 6976.0 | 43 |
| 6977.0 | 42 |
| 6978.0 | 43 |
| 6979.0 | 42 |
| 6980.0 | 41 |
| 6981.0 | 42 |
| 6982.0 | 43 |
| 6983.0 | 44 |
| 6984.0 | 43 |
| 6985.0 | 44 |
| 6986.0 | 43 |
| 6987.0 | 44 |
| 6988.0 | 45 |
| 6989.0 | 44 |
| 6990.0 | 45 |
| 6991.0 | 46 |
| 6992.0 | 45 |
| 6993.0 | 44 |
| 6994.0 | 43 |
| 6995.0 | 42 |
| 6996.0 | 41 |
| 6997.0 | 40 |
| 6998.0 | 41 |
| 6999.0 | 42 |
| 7000.0 | 43 |
| 7001.0 | 42 |
| 7002.0 | 41 |
| 7003.0 | 40 |
| 7004.0 | 39 |
| 7005.0 | 40 |
| 7006.0 | 39 |
| 7007.0 | 40 |
| 7008.0 | 41 |
| 7009.0 | 40 |
| 7010.0 | 39 |
| 7011.0 | 38 |
| 7012.0 | 39 |
| 7013.0 | 40 |
| 7014.0 | 39 |
| 7015.0 | 38 |
| 7016.0 | 37 |
| 7017.0 | 36 |
| 7018.0 | 37 |
| 7019.0 | 36 |
| 7020.0 | 35 |
| 7021.0 | 36 |
| 7022.0 | 37 |
| 7023.0 | 38 |
| 7024.0 | 37 |
| 7025.0 | 36 |
| 7026.0 | 37 |
| 7027.0 | 36 |
| 7028.0 | 35 |
| 7029.0 | 36 |
| 7030.0 | 35 |
| 7031.0 | 36 |
| 7032.0 | 35 |
| 7033.0 | 36 |
| 7034.0 | 35 |
| 7035.0 | 34 |
| 7036.0 | 35 |
| 7037.0 | 36 |
| 7038.0 | 35 |
| 7039.0 | 34 |
| 7040.0 | 33 |
| 7041.0 | 32 |
| 7042.0 | 33 |
| 7043.0 | 32 |
| 7044.0 | 33 |
| 7045.0 | 32 |
| 7046.0 | 31 |
| 7047.0 | 32 |
| 7048.0 | 33 |
| 7049.0 | 32 |
| 7050.0 | 31 |
| 7051.0 | 32 |
| 7052.0 | 31 |
| 7053.0 | 30 |
| 7054.0 | 29 |
| 7055.0 | 28 |
| 7056.0 | 29 |
| 7057.0 | 28 |
| 7058.0 | 29 |
| 7059.0 | 30 |
| 7060.0 | 31 |
| 7061.0 | 30 |
| 7062.0 | 31 |
| 7063.0 | 32 |
| 7064.0 | 33 |
| 7065.0 | 34 |
| 7066.0 | 35 |
| 7067.0 | 34 |
| 7068.0 | 35 |
| 7069.0 | 34 |
| 7070.0 | 35 |
| 7071.0 | 34 |
| 7072.0 | 33 |
| 7073.0 | 34 |
| 7074.0 | 33 |
| 7075.0 | 32 |
| 7076.0 | 31 |
| 7077.0 | 30 |
| 7078.0 | 29 |
| 7079.0 | 30 |
| 7080.0 | 31 |
| 7081.0 | 32 |
| 7082.0 | 33 |
| 7083.0 | 32 |
| 7084.0 | 33 |
| 7085.0 | 34 |
| 7086.0 | 33 |
| 7087.0 | 34 |
| 7088.0 | 33 |
| 7089.0 | 32 |
| 7090.0 | 31 |
| 7091.0 | 30 |
| 7092.0 | 29 |
| 7093.0 | 28 |
| 7094.0 | 27 |
| 7095.0 | 28 |
| 7096.0 | 29 |
| 7097.0 | 30 |
| 7098.0 | 29 |
| 7099.0 | 28 |
| 7100.0 | 27 |
| 7101.0 | 28 |
| 7102.0 | 29 |
| 7103.0 | 30 |
| 7104.0 | 29 |
| 7105.0 | 28 |
| 7106.0 | 29 |
| 7107.0 | 30 |
| 7108.0 | 29 |
| 7109.0 | 30 |
| 7110.0 | 31 |
| 7111.0 | 30 |
| 7112.0 | 31 |
| 7113.0 | 32 |
| 7114.0 | 31 |
| 7115.0 | 32 |
| 7116.0 | 31 |
| 7117.0 | 32 |
| 7118.0 | 31 |
| 7119.0 | 30 |
| 7120.0 | 31 |
| 7121.0 | 32 |
| 7122.0 | 33 |
| 7123.0 | 32 |
| 7124.0 | 33 |
| 7125.0 | 34 |
| 7126.0 | 33 |
| 7127.0 | 32 |
| 7128.0 | 33 |
| 7129.0 | 34 |
| 7130.0 | 35 |
| 7131.0 | 36 |
| 7132.0 | 37 |
| 7133.0 | 38 |
| 7134.0 | 39 |
| 7135.0 | 40 |
| 7136.0 | 41 |
| 7137.0 | 42 |
| 7138.0 | 41 |
| 7139.0 | 40 |
| 7140.0 | 39 |
| 7141.0 | 38 |
| 7142.0 | 39 |
| 7143.0 | 40 |
| 7144.0 | 41 |
| 7145.0 | 42 |
| 7146.0 | 41 |
| 7147.0 | 42 |
| 7148.0 | 43 |
| 7149.0 | 44 |
| 7150.0 | 43 |
| 7151.0 | 44 |
| 7152.0 | 43 |
| 7153.0 | 44 |
| 7154.0 | 43 |
| 7155.0 | 42 |
| 7156.0 | 41 |
| 7157.0 | 42 |
| 7158.0 | 41 |
| 7159.0 | 40 |
| 7160.0 | 41 |
| 7161.0 | 42 |
| 7162.0 | 41 |
| 7163.0 | 40 |
| 7164.0 | 39 |
| 7165.0 | 38 |
| 7166.0 | 39 |
| 7167.0 | 38 |
| 7168.0 | 37 |
| 7169.0 | 36 |
| 7170.0 | 35 |
| 7171.0 | 36 |
| 7172.0 | 37 |
| 7173.0 | 38 |
| 7174.0 | 39 |
| 7175.0 | 40 |
| 7176.0 | 41 |
| 7177.0 | 40 |
| 7178.0 | 41 |
| 7179.0 | 42 |
| 7180.0 | 41 |
| 7181.0 | 42 |
| 7182.0 | 43 |
| 7183.0 | 44 |
| 7184.0 | 43 |
| 7185.0 | 42 |
| 7186.0 | 43 |
| 7187.0 | 44 |
| 7188.0 | 43 |
| 7189.0 | 44 |
| 7190.0 | 45 |
| 7191.0 | 44 |
| 7192.0 | 45 |
| 7193.0 | 46 |
| 7194.0 | 47 |
| 7195.0 | 46 |
| 7196.0 | 47 |
| 7197.0 | 48 |
| 7198.0 | 47 |
| 7199.0 | 46 |
| 7200.0 | 47 |
| 7201.0 | 46 |
| 7202.0 | 47 |
| 7203.0 | 46 |
| 7204.0 | 45 |
| 7205.0 | 46 |
| 7206.0 | 47 |
| 7207.0 | 48 |
| 7208.0 | 47 |
| 7209.0 | 46 |
| 7210.0 | 47 |
| 7211.0 | 48 |
| 7212.0 | 47 |
| 7213.0 | 48 |
| 7214.0 | 49 |
| 7215.0 | 50 |
| 7216.0 | 49 |
| 7217.0 | 50 |
| 7218.0 | 51 |
| 7219.0 | 52 |
| 7220.0 | 51 |
| 7221.0 | 52 |
| 7222.0 | 51 |
| 7223.0 | 50 |
| 7224.0 | 51 |
| 7225.0 | 52 |
| 7226.0 | 51 |
| 7227.0 | 52 |
| 7228.0 | 51 |
| 7229.0 | 52 |
| 7230.0 | 51 |
| 7231.0 | 52 |
| 7232.0 | 51 |
| 7233.0 | 50 |
| 7234.0 | 49 |
| 7235.0 | 50 |
| 7236.0 | 49 |
| 7237.0 | 48 |
| 7238.0 | 47 |
| 7239.0 | 46 |
| 7240.0 | 47 |
| 7241.0 | 46 |
| 7242.0 | 47 |
| 7243.0 | 46 |
| 7244.0 | 47 |
| 7245.0 | 46 |
| 7246.0 | 45 |
| 7247.0 | 44 |
| 7248.0 | 45 |
| 7249.0 | 44 |
| 7250.0 | 45 |
| 7251.0 | 46 |
| 7252.0 | 47 |
| 7253.0 | 48 |
| 7254.0 | 49 |
| 7255.0 | 48 |
| 7256.0 | 49 |
| 7257.0 | 48 |
| 7258.0 | 49 |
| 7259.0 | 50 |
| 7260.0 | 51 |
| 7261.0 | 50 |
| 7262.0 | 49 |
| 7263.0 | 50 |
| 7264.0 | 49 |
| 7265.0 | 50 |
| 7266.0 | 49 |
| 7267.0 | 48 |
| 7268.0 | 47 |
| 7269.0 | 48 |
| 7270.0 | 49 |
| 7271.0 | 50 |
| 7272.0 | 49 |
| 7273.0 | 50 |
| 7274.0 | 51 |
| 7275.0 | 52 |
| 7276.0 | 51 |
| 7277.0 | 52 |
| 7278.0 | 53 |
| 7279.0 | 52 |
| 7280.0 | 53 |
| 7281.0 | 52 |
| 7282.0 | 51 |
| 7283.0 | 52 |
| 7284.0 | 51 |
| 7285.0 | 50 |
| 7286.0 | 51 |
| 7287.0 | 52 |
| 7288.0 | 51 |
| 7289.0 | 52 |
| 7290.0 | 53 |
| 7291.0 | 52 |
| 7292.0 | 53 |
| 7293.0 | 54 |
| 7294.0 | 55 |
| 7295.0 | 56 |
| 7296.0 | 55 |
| 7297.0 | 54 |
| 7298.0 | 53 |
| 7299.0 | 54 |
| 7300.0 | 53 |
| 7301.0 | 52 |
| 7302.0 | 53 |
| 7303.0 | 52 |
| 7304.0 | 53 |
| 7305.0 | 54 |
| 7306.0 | 53 |
| 7307.0 | 52 |
| 7308.0 | 53 |
| 7309.0 | 54 |
| 7310.0 | 55 |
| 7311.0 | 54 |
| 7312.0 | 55 |
| 7313.0 | 54 |
| 7314.0 | 53 |
| 7315.0 | 54 |
| 7316.0 | 53 |
| 7317.0 | 52 |
| 7318.0 | 53 |
| 7319.0 | 54 |
| 7320.0 | 53 |
| 7321.0 | 52 |
| 7322.0 | 53 |
| 7323.0 | 52 |
| 7324.0 | 51 |
| 7325.0 | 52 |
| 7326.0 | 53 |
| 7327.0 | 52 |
| 7328.0 | 51 |
| 7329.0 | 52 |
| 7330.0 | 53 |
| 7331.0 | 52 |
| 7332.0 | 53 |
| 7333.0 | 54 |
| 7334.0 | 55 |
| 7335.0 | 54 |
| 7336.0 | 53 |
| 7337.0 | 54 |
| 7338.0 | 53 |
| 7339.0 | 52 |
| 7340.0 | 53 |
| 7341.0 | 54 |
| 7342.0 | 53 |
| 7343.0 | 52 |
| 7344.0 | 51 |
| 7345.0 | 52 |
| 7346.0 | 53 |
| 7347.0 | 52 |
| 7348.0 | 53 |
| 7349.0 | 54 |
| 7350.0 | 55 |
| 7351.0 | 54 |
| 7352.0 | 55 |
| 7353.0 | 56 |
| 7354.0 | 55 |
| 7355.0 | 54 |
| 7356.0 | 55 |
| 7357.0 | 54 |
| 7358.0 | 53 |
| 7359.0 | 52 |
| 7360.0 | 53 |
| 7361.0 | 52 |
| 7362.0 | 51 |
| 7363.0 | 52 |
| 7364.0 | 53 |
| 7365.0 | 54 |
| 7366.0 | 55 |
| 7367.0 | 56 |
| 7368.0 | 55 |
| 7369.0 | 54 |
| 7370.0 | 55 |
| 7371.0 | 54 |
| 7372.0 | 55 |
| 7373.0 | 54 |
| 7374.0 | 55 |
| 7375.0 | 56 |
| 7376.0 | 55 |
| 7377.0 | 54 |
| 7378.0 | 53 |
| 7379.0 | 54 |
| 7380.0 | 53 |
| 7381.0 | 54 |
| 7382.0 | 53 |
| 7383.0 | 54 |
| 7384.0 | 53 |
| 7385.0 | 52 |
| 7386.0 | 53 |
| 7387.0 | 52 |
| 7388.0 | 51 |
| 7389.0 | 50 |
| 7390.0 | 49 |
| 7391.0 | 48 |
| 7392.0 | 47 |
| 7393.0 | 48 |
| 7394.0 | 49 |
| 7395.0 | 50 |
| 7396.0 | 49 |
| 7397.0 | 50 |
| 7398.0 | 51 |
| 7399.0 | 52 |
| 7400.0 | 53 |
| 7401.0 | 54 |
| 7402.0 | 55 |
| 7403.0 | 54 |
| 7404.0 | 53 |
| 7405.0 | 52 |
| 7406.0 | 51 |
| 7407.0 | 50 |
| 7408.0 | 49 |
| 7409.0 | 48 |
| 7410.0 | 47 |
| 7411.0 | 46 |
| 7412.0 | 45 |
| 7413.0 | 44 |
| 7414.0 | 43 |
| 7415.0 | 42 |
| 7416.0 | 41 |
| 7417.0 | 40 |
| 7418.0 | 39 |
| 7419.0 | 38 |
| 7420.0 | 39 |
| 7421.0 | 38 |
| 7422.0 | 39 |
| 7423.0 | 40 |
| 7424.0 | 39 |
| 7425.0 | 38 |
| 7426.0 | 37 |
| 7427.0 | 38 |
| 7428.0 | 39 |
| 7429.0 | 40 |
| 7430.0 | 39 |
| 7431.0 | 38 |
| 7432.0 | 37 |
| 7433.0 | 38 |
| 7434.0 | 39 |
| 7435.0 | 40 |
| 7436.0 | 39 |
| 7437.0 | 40 |
| 7438.0 | 41 |
| 7439.0 | 40 |
| 7440.0 | 41 |
| 7441.0 | 42 |
| 7442.0 | 43 |
| 7443.0 | 42 |
| 7444.0 | 41 |
| 7445.0 | 40 |
| 7446.0 | 39 |
| 7447.0 | 38 |
| 7448.0 | 37 |
| 7449.0 | 38 |
| 7450.0 | 39 |
| 7451.0 | 38 |
| 7452.0 | 37 |
| 7453.0 | 38 |
| 7454.0 | 37 |
| 7455.0 | 38 |
| 7456.0 | 39 |
| 7457.0 | 40 |
| 7458.0 | 41 |
| 7459.0 | 40 |
| 7460.0 | 41 |
| 7461.0 | 42 |
| 7462.0 | 41 |
| 7463.0 | 42 |
| 7464.0 | 41 |
| 7465.0 | 40 |
| 7466.0 | 41 |
| 7467.0 | 40 |
| 7468.0 | 39 |
| 7469.0 | 38 |
| 7470.0 | 37 |
| 7471.0 | 36 |
| 7472.0 | 37 |
| 7473.0 | 38 |
| 7474.0 | 37 |
| 7475.0 | 38 |
| 7476.0 | 37 |
| 7477.0 | 36 |
| 7478.0 | 35 |
| 7479.0 | 34 |
| 7480.0 | 35 |
| 7481.0 | 36 |
| 7482.0 | 37 |
| 7483.0 | 36 |
| 7484.0 | 35 |
| 7485.0 | 34 |
| 7486.0 | 33 |
| 7487.0 | 32 |
| 7488.0 | 31 |
| 7489.0 | 30 |
| 7490.0 | 29 |
| 7491.0 | 30 |
| 7492.0 | 31 |
| 7493.0 | 30 |
| 7494.0 | 31 |
| 7495.0 | 30 |
| 7496.0 | 29 |
| 7497.0 | 30 |
| 7498.0 | 29 |
| 7499.0 | 30 |
| 7500.0 | 31 |
| 7501.0 | 30 |
| 7502.0 | 29 |
| 7503.0 | 28 |
| 7504.0 | 27 |
| 7505.0 | 28 |
| 7506.0 | 29 |
| 7507.0 | 30 |
| 7508.0 | 31 |
| 7509.0 | 32 |
| 7510.0 | 33 |
| 7511.0 | 34 |
| 7512.0 | 33 |
| 7513.0 | 32 |
| 7514.0 | 33 |
| 7515.0 | 32 |
| 7516.0 | 33 |
| 7517.0 | 32 |
| 7518.0 | 31 |
| 7519.0 | 32 |
| 7520.0 | 31 |
| 7521.0 | 32 |
| 7522.0 | 33 |
| 7523.0 | 32 |
| 7524.0 | 31 |
| 7525.0 | 32 |
| 7526.0 | 33 |
| 7527.0 | 32 |
| 7528.0 | 33 |
| 7529.0 | 34 |
| 7530.0 | 35 |
| 7531.0 | 36 |
| 7532.0 | 37 |
| 7533.0 | 38 |
| 7534.0 | 39 |
| 7535.0 | 38 |
| 7536.0 | 37 |
| 7537.0 | 38 |
| 7538.0 | 39 |
| 7539.0 | 40 |
| 7540.0 | 41 |
| 7541.0 | 40 |
| 7542.0 | 39 |
| 7543.0 | 38 |
| 7544.0 | 37 |
| 7545.0 | 36 |
| 7546.0 | 37 |
| 7547.0 | 36 |
| 7548.0 | 37 |
| 7549.0 | 38 |
| 7550.0 | 39 |
| 7551.0 | 40 |
| 7552.0 | 39 |
| 7553.0 | 38 |
| 7554.0 | 37 |
| 7555.0 | 38 |
| 7556.0 | 37 |
| 7557.0 | 38 |
| 7558.0 | 37 |
| 7559.0 | 38 |
| 7560.0 | 39 |
| 7561.0 | 40 |
| 7562.0 | 41 |
| 7563.0 | 42 |
| 7564.0 | 43 |
| 7565.0 | 44 |
| 7566.0 | 43 |
| 7567.0 | 42 |
| 7568.0 | 43 |
| 7569.0 | 44 |
| 7570.0 | 43 |
| 7571.0 | 44 |
| 7572.0 | 45 |
| 7573.0 | 44 |
| 7574.0 | 43 |
| 7575.0 | 44 |
| 7576.0 | 45 |
| 7577.0 | 44 |
| 7578.0 | 43 |
| 7579.0 | 44 |
| 7580.0 | 43 |
| 7581.0 | 44 |
| 7582.0 | 45 |
| 7583.0 | 44 |
| 7584.0 | 45 |
| 7585.0 | 44 |
| 7586.0 | 45 |
| 7587.0 | 44 |
| 7588.0 | 45 |
| 7589.0 | 44 |
| 7590.0 | 45 |
| 7591.0 | 46 |
| 7592.0 | 45 |
| 7593.0 | 46 |
| 7594.0 | 45 |
| 7595.0 | 44 |
| 7596.0 | 43 |
| 7597.0 | 44 |
| 7598.0 | 45 |
| 7599.0 | 44 |
| 7600.0 | 45 |
| 7601.0 | 44 |
| 7602.0 | 43 |
| 7603.0 | 42 |
| 7604.0 | 41 |
| 7605.0 | 42 |
| 7606.0 | 43 |
| 7607.0 | 42 |
| 7608.0 | 43 |
| 7609.0 | 44 |
| 7610.0 | 45 |
| 7611.0 | 44 |
| 7612.0 | 45 |
| 7613.0 | 46 |
| 7614.0 | 47 |
| 7615.0 | 46 |
| 7616.0 | 47 |
| 7617.0 | 46 |
| 7618.0 | 47 |
| 7619.0 | 48 |
| 7620.0 | 47 |
| 7621.0 | 46 |
| 7622.0 | 45 |
| 7623.0 | 46 |
| 7624.0 | 45 |
| 7625.0 | 44 |
| 7626.0 | 45 |
| 7627.0 | 46 |
| 7628.0 | 45 |
| 7629.0 | 44 |
| 7630.0 | 45 |
| 7631.0 | 44 |
| 7632.0 | 45 |
| 7633.0 | 44 |
| 7634.0 | 45 |
| 7635.0 | 46 |
| 7636.0 | 47 |
| 7637.0 | 46 |
| 7638.0 | 45 |
| 7639.0 | 46 |
| 7640.0 | 45 |
| 7641.0 | 44 |
| 7642.0 | 43 |
| 7643.0 | 44 |
| 7644.0 | 45 |
| 7645.0 | 44 |
| 7646.0 | 43 |
| 7647.0 | 44 |
| 7648.0 | 43 |
| 7649.0 | 44 |
| 7650.0 | 43 |
| 7651.0 | 44 |
| 7652.0 | 43 |
| 7653.0 | 42 |
| 7654.0 | 41 |
| 7655.0 | 42 |
| 7656.0 | 43 |
| 7657.0 | 44 |
| 7658.0 | 43 |
| 7659.0 | 44 |
| 7660.0 | 43 |
| 7661.0 | 42 |
| 7662.0 | 41 |
| 7663.0 | 40 |
| 7664.0 | 41 |
| 7665.0 | 42 |
| 7666.0 | 41 |
| 7667.0 | 42 |
| 7668.0 | 43 |
| 7669.0 | 42 |
| 7670.0 | 41 |
| 7671.0 | 42 |
| 7672.0 | 43 |
| 7673.0 | 44 |
| 7674.0 | 45 |
| 7675.0 | 44 |
| 7676.0 | 43 |
| 7677.0 | 42 |
| 7678.0 | 43 |
| 7679.0 | 44 |
| 7680.0 | 45 |
| 7681.0 | 46 |
| 7682.0 | 45 |
| 7683.0 | 46 |
| 7684.0 | 47 |
| 7685.0 | 46 |
| 7686.0 | 47 |
| 7687.0 | 46 |
| 7688.0 | 47 |
| 7689.0 | 48 |
| 7690.0 | 47 |
| 7691.0 | 46 |
| 7692.0 | 45 |
| 7693.0 | 44 |
| 7694.0 | 43 |
| 7695.0 | 44 |
| 7696.0 | 45 |
| 7697.0 | 46 |
| 7698.0 | 45 |
| 7699.0 | 44 |
| 7700.0 | 45 |
| 7701.0 | 46 |
| 7702.0 | 47 |
| 7703.0 | 48 |
| 7704.0 | 47 |
| 7705.0 | 48 |
| 7706.0 | 49 |
| 7707.0 | 48 |
| 7708.0 | 47 |
| 7709.0 | 48 |
| 7710.0 | 47 |
| 7711.0 | 46 |
| 7712.0 | 47 |
| 7713.0 | 48 |
| 7714.0 | 49 |
| 7715.0 | 48 |
| 7716.0 | 49 |
| 7717.0 | 48 |
| 7718.0 | 47 |
| 7719.0 | 46 |
| 7720.0 | 45 |
| 7721.0 | 46 |
| 7722.0 | 45 |
| 7723.0 | 44 |
| 7724.0 | 43 |
| 7725.0 | 42 |
| 7726.0 | 41 |
| 7727.0 | 42 |
| 7728.0 | 43 |
| 7729.0 | 44 |
| 7730.0 | 43 |
| 7731.0 | 42 |
| 7732.0 | 43 |
| 7733.0 | 44 |
| 7734.0 | 43 |
| 7735.0 | 42 |
| 7736.0 | 41 |
| 7737.0 | 40 |
| 7738.0 | 39 |
| 7739.0 | 38 |
| 7740.0 | 39 |
| 7741.0 | 40 |
| 7742.0 | 41 |
| 7743.0 | 40 |
| 7744.0 | 39 |
| 7745.0 | 38 |
| 7746.0 | 37 |
| 7747.0 | 38 |
| 7748.0 | 39 |
| 7749.0 | 40 |
| 7750.0 | 39 |
| 7751.0 | 40 |
| 7752.0 | 41 |
| 7753.0 | 42 |
| 7754.0 | 43 |
| 7755.0 | 42 |
| 7756.0 | 43 |
| 7757.0 | 42 |
| 7758.0 | 43 |
| 7759.0 | 44 |
| 7760.0 | 43 |
| 7761.0 | 44 |
| 7762.0 | 45 |
| 7763.0 | 46 |
| 7764.0 | 45 |
| 7765.0 | 44 |
| 7766.0 | 45 |
| 7767.0 | 46 |
| 7768.0 | 47 |
| 7769.0 | 48 |
| 7770.0 | 47 |
| 7771.0 | 46 |
| 7772.0 | 45 |
| 7773.0 | 44 |
| 7774.0 | 43 |
| 7775.0 | 44 |
| 7776.0 | 43 |
| 7777.0 | 44 |
| 7778.0 | 45 |
| 7779.0 | 44 |
| 7780.0 | 43 |
| 7781.0 | 42 |
| 7782.0 | 43 |
| 7783.0 | 44 |
| 7784.0 | 45 |
| 7785.0 | 46 |
| 7786.0 | 45 |
| 7787.0 | 44 |
| 7788.0 | 45 |
| 7789.0 | 46 |
| 7790.0 | 45 |
| 7791.0 | 44 |
| 7792.0 | 43 |
| 7793.0 | 42 |
| 7794.0 | 43 |
| 7795.0 | 42 |
| 7796.0 | 43 |
| 7797.0 | 44 |
| 7798.0 | 45 |
| 7799.0 | 46 |
| 7800.0 | 47 |
| 7801.0 | 48 |
| 7802.0 | 49 |
| 7803.0 | 48 |
| 7804.0 | 47 |
| 7805.0 | 48 |
| 7806.0 | 47 |
| 7807.0 | 48 |
| 7808.0 | 47 |
| 7809.0 | 46 |
| 7810.0 | 47 |
| 7811.0 | 48 |
| 7812.0 | 47 |
| 7813.0 | 46 |
| 7814.0 | 47 |
| 7815.0 | 46 |
| 7816.0 | 45 |
| 7817.0 | 46 |
| 7818.0 | 47 |
| 7819.0 | 46 |
| 7820.0 | 47 |
| 7821.0 | 48 |
| 7822.0 | 47 |
| 7823.0 | 48 |
| 7824.0 | 49 |
| 7825.0 | 50 |
| 7826.0 | 51 |
| 7827.0 | 52 |
| 7828.0 | 53 |
| 7829.0 | 52 |
| 7830.0 | 53 |
| 7831.0 | 54 |
| 7832.0 | 53 |
| 7833.0 | 54 |
| 7834.0 | 53 |
| 7835.0 | 52 |
| 7836.0 | 51 |
| 7837.0 | 50 |
| 7838.0 | 51 |
| 7839.0 | 50 |
| 7840.0 | 49 |
| 7841.0 | 50 |
| 7842.0 | 49 |
| 7843.0 | 50 |
| 7844.0 | 51 |
| 7845.0 | 52 |
| 7846.0 | 53 |
| 7847.0 | 54 |
| 7848.0 | 53 |
| 7849.0 | 54 |
| 7850.0 | 53 |
| 7851.0 | 54 |
| 7852.0 | 55 |
| 7853.0 | 54 |
| 7854.0 | 55 |
| 7855.0 | 54 |
| 7856.0 | 53 |
| 7857.0 | 52 |
| 7858.0 | 53 |
| 7859.0 | 52 |
| 7860.0 | 51 |
| 7861.0 | 52 |
| 7862.0 | 53 |
| 7863.0 | 52 |
| 7864.0 | 51 |
| 7865.0 | 50 |
| 7866.0 | 51 |
| 7867.0 | 52 |
| 7868.0 | 53 |
| 7869.0 | 52 |
| 7870.0 | 53 |
| 7871.0 | 54 |
| 7872.0 | 55 |
| 7873.0 | 54 |
| 7874.0 | 55 |
| 7875.0 | 56 |
| 7876.0 | 57 |
| 7877.0 | 56 |
| 7878.0 | 55 |
| 7879.0 | 56 |
| 7880.0 | 55 |
| 7881.0 | 56 |
| 7882.0 | 55 |
| 7883.0 | 54 |
| 7884.0 | 53 |
| 7885.0 | 54 |
| 7886.0 | 53 |
| 7887.0 | 52 |
| 7888.0 | 51 |
| 7889.0 | 50 |
| 7890.0 | 51 |
| 7891.0 | 52 |
| 7892.0 | 51 |
| 7893.0 | 50 |
| 7894.0 | 51 |
| 7895.0 | 50 |
| 7896.0 | 49 |
| 7897.0 | 48 |
| 7898.0 | 49 |
| 7899.0 | 50 |
| 7900.0 | 49 |
| 7901.0 | 48 |
| 7902.0 | 47 |
| 7903.0 | 46 |
| 7904.0 | 47 |
| 7905.0 | 46 |
| 7906.0 | 45 |
| 7907.0 | 46 |
| 7908.0 | 47 |
| 7909.0 | 46 |
| 7910.0 | 47 |
| 7911.0 | 46 |
| 7912.0 | 45 |
| 7913.0 | 46 |
| 7914.0 | 47 |
| 7915.0 | 48 |
| 7916.0 | 47 |
| 7917.0 | 46 |
| 7918.0 | 47 |
| 7919.0 | 46 |
| 7920.0 | 47 |
| 7921.0 | 46 |
| 7922.0 | 45 |
| 7923.0 | 44 |
| 7924.0 | 43 |
| 7925.0 | 44 |
| 7926.0 | 43 |
| 7927.0 | 42 |
| 7928.0 | 41 |
| 7929.0 | 42 |
| 7930.0 | 41 |
| 7931.0 | 40 |
| 7932.0 | 41 |
| 7933.0 | 40 |
| 7934.0 | 39 |
| 7935.0 | 40 |
| 7936.0 | 41 |
| 7937.0 | 42 |
| 7938.0 | 41 |
| 7939.0 | 42 |
| 7940.0 | 41 |
| 7941.0 | 40 |
| 7942.0 | 39 |
| 7943.0 | 38 |
| 7944.0 | 37 |
| 7945.0 | 38 |
| 7946.0 | 37 |
| 7947.0 | 36 |
| 7948.0 | 35 |
| 7949.0 | 34 |
| 7950.0 | 35 |
| 7951.0 | 34 |
| 7952.0 | 33 |
| 7953.0 | 32 |
| 7954.0 | 33 |
| 7955.0 | 32 |
| 7956.0 | 31 |
| 7957.0 | 30 |
| 7958.0 | 31 |
| 7959.0 | 32 |
| 7960.0 | 31 |
| 7961.0 | 30 |
| 7962.0 | 29 |
| 7963.0 | 30 |
| 7964.0 | 31 |
| 7965.0 | 32 |
| 7966.0 | 33 |
| 7967.0 | 34 |
| 7968.0 | 33 |
| 7969.0 | 34 |
| 7970.0 | 33 |
| 7971.0 | 32 |
| 7972.0 | 33 |
| 7973.0 | 32 |
| 7974.0 | 33 |
| 7975.0 | 32 |
| 7976.0 | 31 |
| 7977.0 | 30 |
| 7978.0 | 29 |
| 7979.0 | 28 |
| 7980.0 | 29 |
| 7981.0 | 28 |
| 7982.0 | 27 |
| 7983.0 | 28 |
| 7984.0 | 27 |
| 7985.0 | 28 |
| 7986.0 | 27 |
| 7987.0 | 28 |
| 7988.0 | 27 |
| 7989.0 | 28 |
| 7990.0 | 27 |
| 7991.0 | 26 |
| 7992.0 | 27 |
| 7993.0 | 26 |
| 7994.0 | 25 |
| 7995.0 | 26 |
| 7996.0 | 27 |
| 7997.0 | 26 |
| 7998.0 | 27 |
| 7999.0 | 28 |
| 8000.0 | 29 |
| 8001.0 | 28 |
| 8002.0 | 27 |
| 8003.0 | 28 |
| 8004.0 | 27 |
| 8005.0 | 26 |
| 8006.0 | 27 |
| 8007.0 | 26 |
| 8008.0 | 27 |
| 8009.0 | 28 |
| 8010.0 | 27 |
| 8011.0 | 26 |
| 8012.0 | 27 |
| 8013.0 | 26 |
| 8014.0 | 27 |
| 8015.0 | 28 |
| 8016.0 | 29 |
| 8017.0 | 30 |
| 8018.0 | 29 |
| 8019.0 | 30 |
| 8020.0 | 29 |
| 8021.0 | 30 |
| 8022.0 | 29 |
| 8023.0 | 28 |
| 8024.0 | 27 |
| 8025.0 | 28 |
| 8026.0 | 27 |
| 8027.0 | 26 |
| 8028.0 | 27 |
| 8029.0 | 26 |
| 8030.0 | 27 |
| 8031.0 | 28 |
| 8032.0 | 27 |
| 8033.0 | 28 |
| 8034.0 | 29 |
| 8035.0 | 28 |
| 8036.0 | 29 |
| 8037.0 | 30 |
| 8038.0 | 31 |
| 8039.0 | 32 |
| 8040.0 | 33 |
| 8041.0 | 34 |
| 8042.0 | 33 |
| 8043.0 | 32 |
| 8044.0 | 33 |
| 8045.0 | 34 |
| 8046.0 | 33 |
| 8047.0 | 32 |
| 8048.0 | 33 |
| 8049.0 | 32 |
| 8050.0 | 31 |
| 8051.0 | 30 |
| 8052.0 | 29 |
| 8053.0 | 28 |
| 8054.0 | 29 |
| 8055.0 | 28 |
| 8056.0 | 27 |
| 8057.0 | 26 |
| 8058.0 | 27 |
| 8059.0 | 28 |
| 8060.0 | 27 |
| 8061.0 | 28 |
| 8062.0 | 27 |
| 8063.0 | 26 |
| 8064.0 | 27 |
| 8065.0 | 28 |
| 8066.0 | 29 |
| 8067.0 | 28 |
| 8068.0 | 29 |
| 8069.0 | 30 |
| 8070.0 | 29 |
| 8071.0 | 30 |
| 8072.0 | 29 |
| 8073.0 | 30 |
| 8074.0 | 31 |
| 8075.0 | 30 |
| 8076.0 | 31 |
| 8077.0 | 30 |
| 8078.0 | 31 |
| 8079.0 | 30 |
| 8080.0 | 31 |
| 8081.0 | 30 |
| 8082.0 | 31 |
| 8083.0 | 30 |
| 8084.0 | 31 |
| 8085.0 | 30 |
| 8086.0 | 29 |
| 8087.0 | 28 |
| 8088.0 | 29 |
| 8089.0 | 30 |
| 8090.0 | 31 |
| 8091.0 | 30 |
| 8092.0 | 31 |
| 8093.0 | 32 |
| 8094.0 | 33 |
| 8095.0 | 34 |
| 8096.0 | 35 |
| 8097.0 | 36 |
| 8098.0 | 35 |
| 8099.0 | 36 |
| 8100.0 | 35 |
| 8101.0 | 36 |
| 8102.0 | 37 |
| 8103.0 | 38 |
| 8104.0 | 39 |
| 8105.0 | 38 |
| 8106.0 | 39 |
| 8107.0 | 38 |
| 8108.0 | 39 |
| 8109.0 | 38 |
| 8110.0 | 39 |
| 8111.0 | 38 |
| 8112.0 | 39 |
| 8113.0 | 40 |
| 8114.0 | 39 |
| 8115.0 | 40 |
| 8116.0 | 41 |
| 8117.0 | 40 |
| 8118.0 | 39 |
| 8119.0 | 38 |
| 8120.0 | 39 |
| 8121.0 | 38 |
| 8122.0 | 37 |
| 8123.0 | 36 |
| 8124.0 | 37 |
| 8125.0 | 36 |
| 8126.0 | 35 |
| 8127.0 | 34 |
| 8128.0 | 33 |
| 8129.0 | 32 |
| 8130.0 | 33 |
| 8131.0 | 32 |
| 8132.0 | 31 |
| 8133.0 | 32 |
| 8134.0 | 31 |
| 8135.0 | 30 |
| 8136.0 | 29 |
| 8137.0 | 30 |
| 8138.0 | 29 |
| 8139.0 | 28 |
| 8140.0 | 29 |
| 8141.0 | 28 |
| 8142.0 | 29 |
| 8143.0 | 28 |
| 8144.0 | 29 |
| 8145.0 | 30 |
| 8146.0 | 29 |
| 8147.0 | 28 |
| 8148.0 | 27 |
| 8149.0 | 28 |
| 8150.0 | 29 |
| 8151.0 | 30 |
| 8152.0 | 29 |
| 8153.0 | 30 |
| 8154.0 | 31 |
| 8155.0 | 30 |
| 8156.0 | 29 |
| 8157.0 | 28 |
| 8158.0 | 29 |
| 8159.0 | 30 |
| 8160.0 | 29 |
| 8161.0 | 28 |
| 8162.0 | 29 |
| 8163.0 | 30 |
| 8164.0 | 31 |
| 8165.0 | 32 |
| 8166.0 | 33 |
| 8167.0 | 34 |
| 8168.0 | 35 |
| 8169.0 | 36 |
| 8170.0 | 37 |
| 8171.0 | 38 |
| 8172.0 | 39 |
| 8173.0 | 40 |
| 8174.0 | 41 |
| 8175.0 | 40 |
| 8176.0 | 39 |
| 8177.0 | 38 |
| 8178.0 | 37 |
| 8179.0 | 38 |
| 8180.0 | 37 |
| 8181.0 | 38 |
| 8182.0 | 37 |
| 8183.0 | 36 |
| 8184.0 | 37 |
| 8185.0 | 36 |
| 8186.0 | 37 |
| 8187.0 | 36 |
| 8188.0 | 37 |
| 8189.0 | 38 |
| 8190.0 | 39 |
| 8191.0 | 40 |
| 8192.0 | 41 |
| 8193.0 | 42 |
| 8194.0 | 43 |
| 8195.0 | 42 |
| 8196.0 | 43 |
| 8197.0 | 44 |
| 8198.0 | 45 |
| 8199.0 | 46 |
| 8200.0 | 47 |
| 8201.0 | 46 |
| 8202.0 | 47 |
| 8203.0 | 48 |
| 8204.0 | 49 |
| 8205.0 | 48 |
| 8206.0 | 47 |
| 8207.0 | 48 |
| 8208.0 | 47 |
| 8209.0 | 46 |
| 8210.0 | 45 |
| 8211.0 | 44 |
| 8212.0 | 43 |
| 8213.0 | 44 |
| 8214.0 | 43 |
| 8215.0 | 42 |
| 8216.0 | 43 |
| 8217.0 | 42 |
| 8218.0 | 41 |
| 8219.0 | 40 |
| 8220.0 | 41 |
| 8221.0 | 40 |
| 8222.0 | 41 |
| 8223.0 | 40 |
| 8224.0 | 41 |
| 8225.0 | 42 |
| 8226.0 | 43 |
| 8227.0 | 42 |
| 8228.0 | 41 |
| 8229.0 | 42 |
| 8230.0 | 41 |
| 8231.0 | 42 |
| 8232.0 | 43 |
| 8233.0 | 42 |
| 8234.0 | 41 |
| 8235.0 | 40 |
| 8236.0 | 39 |
| 8237.0 | 38 |
| 8238.0 | 37 |
| 8239.0 | 38 |
| 8240.0 | 39 |
| 8241.0 | 40 |
| 8242.0 | 41 |
| 8243.0 | 40 |
| 8244.0 | 41 |
| 8245.0 | 40 |
| 8246.0 | 39 |
| 8247.0 | 40 |
| 8248.0 | 39 |
| 8249.0 | 38 |
| 8250.0 | 39 |
| 8251.0 | 40 |
| 8252.0 | 41 |
| 8253.0 | 42 |
| 8254.0 | 41 |
| 8255.0 | 40 |
| 8256.0 | 39 |
| 8257.0 | 40 |
| 8258.0 | 39 |
| 8259.0 | 38 |
| 8260.0 | 37 |
| 8261.0 | 36 |
| 8262.0 | 37 |
| 8263.0 | 36 |
| 8264.0 | 35 |
| 8265.0 | 36 |
| 8266.0 | 37 |
| 8267.0 | 36 |
| 8268.0 | 37 |
| 8269.0 | 36 |
| 8270.0 | 37 |
| 8271.0 | 38 |
| 8272.0 | 39 |
| 8273.0 | 38 |
| 8274.0 | 39 |
| 8275.0 | 40 |
| 8276.0 | 39 |
| 8277.0 | 40 |
| 8278.0 | 41 |
| 8279.0 | 40 |
| 8280.0 | 41 |
| 8281.0 | 42 |
| 8282.0 | 43 |
| 8283.0 | 42 |
| 8284.0 | 41 |
| 8285.0 | 40 |
| 8286.0 | 41 |
| 8287.0 | 40 |
| 8288.0 | 39 |
| 8289.0 | 38 |
| 8290.0 | 37 |
| 8291.0 | 36 |
| 8292.0 | 35 |
| 8293.0 | 34 |
| 8294.0 | 33 |
| 8295.0 | 32 |
| 8296.0 | 31 |
| 8297.0 | 30 |
| 8298.0 | 31 |
| 8299.0 | 32 |
| 8300.0 | 31 |
| 8301.0 | 32 |
| 8302.0 | 33 |
| 8303.0 | 34 |
| 8304.0 | 33 |
| 8305.0 | 34 |
| 8306.0 | 33 |
| 8307.0 | 34 |
| 8308.0 | 35 |
| 8309.0 | 34 |
| 8310.0 | 35 |
| 8311.0 | 34 |
| 8312.0 | 33 |
| 8313.0 | 34 |
| 8314.0 | 33 |
| 8315.0 | 32 |
| 8316.0 | 33 |
| 8317.0 | 34 |
| 8318.0 | 33 |
| 8319.0 | 34 |
| 8320.0 | 33 |
| 8321.0 | 32 |
| 8322.0 | 33 |
| 8323.0 | 32 |
| 8324.0 | 31 |
| 8325.0 | 32 |
| 8326.0 | 33 |
| 8327.0 | 32 |
| 8328.0 | 31 |
| 8329.0 | 32 |
| 8330.0 | 31 |
| 8331.0 | 32 |
| 8332.0 | 33 |
| 8333.0 | 32 |
| 8334.0 | 31 |
| 8335.0 | 30 |
| 8336.0 | 31 |
| 8337.0 | 30 |
| 8338.0 | 31 |
| 8339.0 | 32 |
| 8340.0 | 33 |
| 8341.0 | 34 |
| 8342.0 | 35 |
| 8343.0 | 36 |
| 8344.0 | 35 |
| 8345.0 | 36 |
| 8346.0 | 37 |
| 8347.0 | 36 |
| 8348.0 | 37 |
| 8349.0 | 36 |
| 8350.0 | 37 |
| 8351.0 | 38 |
| 8352.0 | 37 |
| 8353.0 | 36 |
| 8354.0 | 35 |
| 8355.0 | 36 |
| 8356.0 | 35 |
| 8357.0 | 36 |
| 8358.0 | 35 |
| 8359.0 | 34 |
| 8360.0 | 33 |
| 8361.0 | 34 |
| 8362.0 | 33 |
| 8363.0 | 34 |
| 8364.0 | 35 |
| 8365.0 | 36 |
| 8366.0 | 35 |
| 8367.0 | 34 |
| 8368.0 | 33 |
| 8369.0 | 32 |
| 8370.0 | 31 |
| 8371.0 | 32 |
| 8372.0 | 33 |
| 8373.0 | 32 |
| 8374.0 | 33 |
| 8375.0 | 32 |
| 8376.0 | 31 |
| 8377.0 | 30 |
| 8378.0 | 29 |
| 8379.0 | 28 |
| 8380.0 | 27 |
| 8381.0 | 28 |
| 8382.0 | 27 |
| 8383.0 | 28 |
| 8384.0 | 27 |
| 8385.0 | 26 |
| 8386.0 | 27 |
| 8387.0 | 26 |
| 8388.0 | 27 |
| 8389.0 | 28 |
| 8390.0 | 29 |
| 8391.0 | 28 |
| 8392.0 | 29 |
| 8393.0 | 30 |
| 8394.0 | 29 |
| 8395.0 | 28 |
| 8396.0 | 27 |
| 8397.0 | 26 |
| 8398.0 | 25 |
| 8399.0 | 26 |
| 8400.0 | 27 |
| 8401.0 | 28 |
| 8402.0 | 27 |
| 8403.0 | 26 |
| 8404.0 | 25 |
| 8405.0 | 26 |
| 8406.0 | 27 |
| 8407.0 | 28 |
| 8408.0 | 29 |
| 8409.0 | 28 |
| 8410.0 | 29 |
| 8411.0 | 30 |
| 8412.0 | 29 |
| 8413.0 | 28 |
| 8414.0 | 29 |
| 8415.0 | 30 |
| 8416.0 | 29 |
| 8417.0 | 30 |
| 8418.0 | 31 |
| 8419.0 | 32 |
| 8420.0 | 31 |
| 8421.0 | 32 |
| 8422.0 | 33 |
| 8423.0 | 34 |
| 8424.0 | 33 |
| 8425.0 | 34 |
| 8426.0 | 33 |
| 8427.0 | 32 |
| 8428.0 | 31 |
| 8429.0 | 32 |
| 8430.0 | 31 |
| 8431.0 | 32 |
| 8432.0 | 33 |
| 8433.0 | 34 |
| 8434.0 | 33 |
| 8435.0 | 32 |
| 8436.0 | 31 |
| 8437.0 | 32 |
| 8438.0 | 31 |
| 8439.0 | 30 |
| 8440.0 | 29 |
| 8441.0 | 28 |
| 8442.0 | 27 |
| 8443.0 | 28 |
| 8444.0 | 27 |
| 8445.0 | 28 |
| 8446.0 | 27 |
| 8447.0 | 26 |
| 8448.0 | 27 |
| 8449.0 | 26 |
| 8450.0 | 27 |
| 8451.0 | 28 |
| 8452.0 | 29 |
| 8453.0 | 30 |
| 8454.0 | 29 |
| 8455.0 | 30 |
| 8456.0 | 29 |
| 8457.0 | 28 |
| 8458.0 | 27 |
| 8459.0 | 26 |
| 8460.0 | 27 |
| 8461.0 | 26 |
| 8462.0 | 25 |
| 8463.0 | 24 |
| 8464.0 | 23 |
| 8465.0 | 24 |
| 8466.0 | 25 |
| 8467.0 | 24 |
| 8468.0 | 25 |
| 8469.0 | 24 |
| 8470.0 | 25 |
| 8471.0 | 24 |
| 8472.0 | 25 |
| 8473.0 | 26 |
| 8474.0 | 25 |
| 8475.0 | 24 |
| 8476.0 | 25 |
| 8477.0 | 26 |
| 8478.0 | 27 |
| 8479.0 | 26 |
| 8480.0 | 27 |
| 8481.0 | 28 |
| 8482.0 | 27 |
| 8483.0 | 26 |
| 8484.0 | 25 |
| 8485.0 | 26 |
| 8486.0 | 27 |
| 8487.0 | 26 |
| 8488.0 | 25 |
| 8489.0 | 26 |
| 8490.0 | 27 |
| 8491.0 | 28 |
| 8492.0 | 29 |
| 8493.0 | 30 |
| 8494.0 | 31 |
| 8495.0 | 30 |
| 8496.0 | 31 |
| 8497.0 | 30 |
| 8498.0 | 29 |
| 8499.0 | 28 |
| 8500.0 | 29 |
| 8501.0 | 28 |
| 8502.0 | 27 |
| 8503.0 | 26 |
| 8504.0 | 27 |
| 8505.0 | 28 |
| 8506.0 | 29 |
| 8507.0 | 30 |
| 8508.0 | 31 |
| 8509.0 | 30 |
| 8510.0 | 29 |
| 8511.0 | 30 |
| 8512.0 | 31 |
| 8513.0 | 30 |
| 8514.0 | 31 |
| 8515.0 | 30 |
| 8516.0 | 29 |
| 8517.0 | 30 |
| 8518.0 | 31 |
| 8519.0 | 30 |
| 8520.0 | 31 |
| 8521.0 | 30 |
| 8522.0 | 29 |
| 8523.0 | 28 |
| 8524.0 | 29 |
| 8525.0 | 28 |
| 8526.0 | 27 |
| 8527.0 | 28 |
| 8528.0 | 29 |
| 8529.0 | 28 |
| 8530.0 | 29 |
| 8531.0 | 30 |
| 8532.0 | 29 |
| 8533.0 | 28 |
| 8534.0 | 27 |
| 8535.0 | 28 |
| 8536.0 | 27 |
| 8537.0 | 26 |
| 8538.0 | 27 |
| 8539.0 | 26 |
| 8540.0 | 27 |
| 8541.0 | 26 |
| 8542.0 | 25 |
| 8543.0 | 24 |
| 8544.0 | 25 |
| 8545.0 | 24 |
| 8546.0 | 25 |
| 8547.0 | 24 |
| 8548.0 | 25 |
| 8549.0 | 26 |
| 8550.0 | 25 |
| 8551.0 | 26 |
| 8552.0 | 27 |
| 8553.0 | 28 |
| 8554.0 | 29 |
| 8555.0 | 28 |
| 8556.0 | 29 |
| 8557.0 | 30 |
| 8558.0 | 31 |
| 8559.0 | 30 |
| 8560.0 | 29 |
| 8561.0 | 30 |
| 8562.0 | 31 |
| 8563.0 | 30 |
| 8564.0 | 31 |
| 8565.0 | 32 |
| 8566.0 | 33 |
| 8567.0 | 34 |
| 8568.0 | 35 |
| 8569.0 | 36 |
| 8570.0 | 37 |
| 8571.0 | 38 |
| 8572.0 | 39 |
| 8573.0 | 38 |
| 8574.0 | 37 |
| 8575.0 | 36 |
| 8576.0 | 35 |
| 8577.0 | 34 |
| 8578.0 | 33 |
| 8579.0 | 32 |
| 8580.0 | 33 |
| 8581.0 | 34 |
| 8582.0 | 35 |
| 8583.0 | 34 |
| 8584.0 | 35 |
| 8585.0 | 36 |
| 8586.0 | 37 |
| 8587.0 | 38 |
| 8588.0 | 39 |
| 8589.0 | 40 |
| 8590.0 | 41 |
| 8591.0 | 40 |
| 8592.0 | 41 |
| 8593.0 | 40 |
| 8594.0 | 39 |
| 8595.0 | 38 |
| 8596.0 | 39 |
| 8597.0 | 40 |
| 8598.0 | 41 |
| 8599.0 | 40 |
| 8600.0 | 41 |
| 8601.0 | 42 |
| 8602.0 | 43 |
| 8603.0 | 42 |
| 8604.0 | 43 |
| 8605.0 | 44 |
| 8606.0 | 43 |
| 8607.0 | 44 |
| 8608.0 | 43 |
| 8609.0 | 42 |
| 8610.0 | 43 |
| 8611.0 | 44 |
| 8612.0 | 43 |
| 8613.0 | 44 |
| 8614.0 | 43 |
| 8615.0 | 42 |
| 8616.0 | 41 |
| 8617.0 | 42 |
| 8618.0 | 41 |
| 8619.0 | 40 |
| 8620.0 | 39 |
| 8621.0 | 38 |
| 8622.0 | 37 |
| 8623.0 | 38 |
| 8624.0 | 37 |
| 8625.0 | 38 |
| 8626.0 | 37 |
| 8627.0 | 38 |
| 8628.0 | 39 |
| 8629.0 | 38 |
| 8630.0 | 39 |
| 8631.0 | 40 |
| 8632.0 | 39 |
| 8633.0 | 40 |
| 8634.0 | 39 |
| 8635.0 | 38 |
| 8636.0 | 37 |
| 8637.0 | 36 |
| 8638.0 | 35 |
| 8639.0 | 36 |
| 8640.0 | 37 |
| 8641.0 | 36 |
| 8642.0 | 35 |
| 8643.0 | 34 |
| 8644.0 | 35 |
| 8645.0 | 34 |
| 8646.0 | 33 |
| 8647.0 | 34 |
| 8648.0 | 35 |
| 8649.0 | 34 |
| 8650.0 | 35 |
| 8651.0 | 34 |
| 8652.0 | 35 |
| 8653.0 | 36 |
| 8654.0 | 37 |
| 8655.0 | 36 |
| 8656.0 | 35 |
| 8657.0 | 36 |
| 8658.0 | 35 |
| 8659.0 | 34 |
| 8660.0 | 35 |
| 8661.0 | 36 |
| 8662.0 | 37 |
| 8663.0 | 38 |
| 8664.0 | 39 |
| 8665.0 | 40 |
| 8666.0 | 41 |
| 8667.0 | 42 |
| 8668.0 | 43 |
| 8669.0 | 42 |
| 8670.0 | 43 |
| 8671.0 | 44 |
| 8672.0 | 45 |
| 8673.0 | 46 |
| 8674.0 | 47 |
| 8675.0 | 46 |
| 8676.0 | 45 |
| 8677.0 | 46 |
| 8678.0 | 47 |
| 8679.0 | 48 |
| 8680.0 | 47 |
| 8681.0 | 48 |
| 8682.0 | 49 |
| 8683.0 | 48 |
| 8684.0 | 49 |
| 8685.0 | 50 |
| 8686.0 | 49 |
| 8687.0 | 48 |
| 8688.0 | 49 |
| 8689.0 | 48 |
| 8690.0 | 47 |
| 8691.0 | 46 |
| 8692.0 | 45 |
| 8693.0 | 44 |
| 8694.0 | 43 |
| 8695.0 | 42 |
| 8696.0 | 43 |
| 8697.0 | 44 |
| 8698.0 | 43 |
| 8699.0 | 44 |
| 8700.0 | 43 |
| 8701.0 | 42 |
| 8702.0 | 41 |
| 8703.0 | 40 |
| 8704.0 | 41 |
| 8705.0 | 42 |
| 8706.0 | 41 |
| 8707.0 | 42 |
| 8708.0 | 43 |
| 8709.0 | 42 |
| 8710.0 | 43 |
| 8711.0 | 44 |
| 8712.0 | 43 |
| 8713.0 | 42 |
| 8714.0 | 43 |
| 8715.0 | 44 |
| 8716.0 | 45 |
| 8717.0 | 46 |
| 8718.0 | 45 |
| 8719.0 | 44 |
| 8720.0 | 45 |
| 8721.0 | 46 |
| 8722.0 | 47 |
| 8723.0 | 46 |
| 8724.0 | 47 |
| 8725.0 | 48 |
| 8726.0 | 49 |
| 8727.0 | 50 |
| 8728.0 | 49 |
| 8729.0 | 48 |
| 8730.0 | 49 |
| 8731.0 | 50 |
| 8732.0 | 49 |
| 8733.0 | 48 |
| 8734.0 | 47 |
| 8735.0 | 46 |
| 8736.0 | 47 |
| 8737.0 | 46 |
| 8738.0 | 47 |
| 8739.0 | 48 |
| 8740.0 | 47 |
| 8741.0 | 46 |
| 8742.0 | 47 |
| 8743.0 | 48 |
| 8744.0 | 49 |
| 8745.0 | 48 |
| 8746.0 | 49 |
| 8747.0 | 48 |
| 8748.0 | 47 |
| 8749.0 | 46 |
| 8750.0 | 47 |
| 8751.0 | 46 |
| 8752.0 | 45 |
| 8753.0 | 44 |
| 8754.0 | 43 |
| 8755.0 | 42 |
| 8756.0 | 41 |
| 8757.0 | 40 |
| 8758.0 | 39 |
| 8759.0 | 40 |
| 8760.0 | 41 |
| 8761.0 | 42 |
| 8762.0 | 43 |
| 8763.0 | 44 |
| 8764.0 | 43 |
| 8765.0 | 42 |
| 8766.0 | 41 |
| 8767.0 | 42 |
| 8768.0 | 43 |
| 8769.0 | 44 |
| 8770.0 | 43 |
| 8771.0 | 44 |
| 8772.0 | 43 |
| 8773.0 | 42 |
| 8774.0 | 43 |
| 8775.0 | 42 |
| 8776.0 | 43 |
| 8777.0 | 44 |
| 8778.0 | 45 |
| 8779.0 | 44 |
| 8780.0 | 45 |
| 8781.0 | 44 |
| 8782.0 | 45 |
| 8783.0 | 44 |
| 8784.0 | 45 |
| 8785.0 | 46 |
| 8786.0 | 47 |
| 8787.0 | 48 |
| 8788.0 | 47 |
| 8789.0 | 46 |
| 8790.0 | 47 |
| 8791.0 | 46 |
| 8792.0 | 45 |
| 8793.0 | 44 |
| 8794.0 | 45 |
| 8795.0 | 46 |
| 8796.0 | 45 |
| 8797.0 | 46 |
| 8798.0 | 47 |
| 8799.0 | 46 |
| 8800.0 | 45 |
| 8801.0 | 44 |
| 8802.0 | 43 |
| 8803.0 | 42 |
| 8804.0 | 43 |
| 8805.0 | 42 |
| 8806.0 | 41 |
| 8807.0 | 40 |
| 8808.0 | 41 |
| 8809.0 | 40 |
| 8810.0 | 41 |
| 8811.0 | 40 |
| 8812.0 | 41 |
| 8813.0 | 40 |
| 8814.0 | 41 |
| 8815.0 | 42 |
| 8816.0 | 43 |
| 8817.0 | 42 |
| 8818.0 | 41 |
| 8819.0 | 42 |
| 8820.0 | 43 |
| 8821.0 | 44 |
| 8822.0 | 45 |
| 8823.0 | 46 |
| 8824.0 | 45 |
| 8825.0 | 46 |
| 8826.0 | 45 |
| 8827.0 | 46 |
| 8828.0 | 47 |
| 8829.0 | 48 |
| 8830.0 | 47 |
| 8831.0 | 46 |
| 8832.0 | 47 |
| 8833.0 | 48 |
| 8834.0 | 49 |
| 8835.0 | 50 |
| 8836.0 | 51 |
| 8837.0 | 50 |
| 8838.0 | 51 |
| 8839.0 | 52 |
| 8840.0 | 53 |
| 8841.0 | 52 |
| 8842.0 | 53 |
| 8843.0 | 52 |
| 8844.0 | 51 |
| 8845.0 | 52 |
| 8846.0 | 51 |
| 8847.0 | 50 |
| 8848.0 | 51 |
| 8849.0 | 50 |
| 8850.0 | 51 |
| 8851.0 | 52 |
| 8852.0 | 51 |
| 8853.0 | 50 |
| 8854.0 | 49 |
| 8855.0 | 48 |
| 8856.0 | 49 |
| 8857.0 | 50 |
| 8858.0 | 51 |
| 8859.0 | 52 |
| 8860.0 | 53 |
| 8861.0 | 52 |
| 8862.0 | 51 |
| 8863.0 | 52 |
| 8864.0 | 51 |
| 8865.0 | 50 |
| 8866.0 | 51 |
| 8867.0 | 52 |
| 8868.0 | 51 |
| 8869.0 | 50 |
| 8870.0 | 49 |
| 8871.0 | 48 |
| 8872.0 | 49 |
| 8873.0 | 48 |
| 8874.0 | 49 |
| 8875.0 | 48 |
| 8876.0 | 47 |
| 8877.0 | 46 |
| 8878.0 | 47 |
| 8879.0 | 48 |
| 8880.0 | 47 |
| 8881.0 | 48 |
| 8882.0 | 49 |
| 8883.0 | 50 |
| 8884.0 | 49 |
| 8885.0 | 50 |
| 8886.0 | 51 |
| 8887.0 | 52 |
| 8888.0 | 51 |
| 8889.0 | 52 |
| 8890.0 | 53 |
| 8891.0 | 54 |
| 8892.0 | 53 |
| 8893.0 | 52 |
| 8894.0 | 53 |
| 8895.0 | 52 |
| 8896.0 | 51 |
| 8897.0 | 50 |
| 8898.0 | 51 |
| 8899.0 | 50 |
| 8900.0 | 49 |
| 8901.0 | 48 |
| 8902.0 | 49 |
| 8903.0 | 48 |
| 8904.0 | 47 |
| 8905.0 | 46 |
| 8906.0 | 45 |
| 8907.0 | 44 |
| 8908.0 | 45 |
| 8909.0 | 44 |
| 8910.0 | 43 |
| 8911.0 | 44 |
| 8912.0 | 43 |
| 8913.0 | 44 |
| 8914.0 | 43 |
| 8915.0 | 44 |
| 8916.0 | 43 |
| 8917.0 | 44 |
| 8918.0 | 45 |
| 8919.0 | 46 |
| 8920.0 | 47 |
| 8921.0 | 48 |
| 8922.0 | 47 |
| 8923.0 | 48 |
| 8924.0 | 49 |
| 8925.0 | 48 |
| 8926.0 | 49 |
| 8927.0 | 50 |
| 8928.0 | 51 |
| 8929.0 | 50 |
| 8930.0 | 51 |
| 8931.0 | 52 |
| 8932.0 | 51 |
| 8933.0 | 50 |
| 8934.0 | 51 |
| 8935.0 | 50 |
| 8936.0 | 49 |
| 8937.0 | 50 |
| 8938.0 | 49 |
| 8939.0 | 48 |
| 8940.0 | 47 |
| 8941.0 | 46 |
| 8942.0 | 45 |
| 8943.0 | 44 |
| 8944.0 | 43 |
| 8945.0 | 44 |
| 8946.0 | 43 |
| 8947.0 | 44 |
| 8948.0 | 43 |
| 8949.0 | 42 |
| 8950.0 | 41 |
| 8951.0 | 42 |
| 8952.0 | 41 |
| 8953.0 | 42 |
| 8954.0 | 43 |
| 8955.0 | 44 |
| 8956.0 | 45 |
| 8957.0 | 46 |
| 8958.0 | 47 |
| 8959.0 | 48 |
| 8960.0 | 47 |
| 8961.0 | 48 |
| 8962.0 | 47 |
| 8963.0 | 48 |
| 8964.0 | 47 |
| 8965.0 | 46 |
| 8966.0 | 47 |
| 8967.0 | 46 |
| 8968.0 | 45 |
| 8969.0 | 46 |
| 8970.0 | 45 |
| 8971.0 | 46 |
| 8972.0 | 47 |
| 8973.0 | 48 |
| 8974.0 | 47 |
| 8975.0 | 46 |
| 8976.0 | 47 |
| 8977.0 | 48 |
| 8978.0 | 47 |
| 8979.0 | 46 |
| 8980.0 | 47 |
| 8981.0 | 48 |
| 8982.0 | 49 |
| 8983.0 | 48 |
| 8984.0 | 47 |
| 8985.0 | 46 |
| 8986.0 | 45 |
| 8987.0 | 44 |
| 8988.0 | 43 |
| 8989.0 | 42 |
| 8990.0 | 41 |
| 8991.0 | 40 |
| 8992.0 | 41 |
| 8993.0 | 42 |
| 8994.0 | 43 |
| 8995.0 | 44 |
| 8996.0 | 45 |
| 8997.0 | 44 |
| 8998.0 | 45 |
| 8999.0 | 44 |
| 9000.0 | 43 |
| 9001.0 | 42 |
| 9002.0 | 43 |
| 9003.0 | 44 |
| 9004.0 | 45 |
| 9005.0 | 44 |
| 9006.0 | 45 |
| 9007.0 | 46 |
| 9008.0 | 47 |
| 9009.0 | 48 |
| 9010.0 | 47 |
| 9011.0 | 46 |
| 9012.0 | 47 |
| 9013.0 | 46 |
| 9014.0 | 47 |
| 9015.0 | 46 |
| 9016.0 | 47 |
| 9017.0 | 48 |
| 9018.0 | 49 |
| 9019.0 | 50 |
| 9020.0 | 49 |
| 9021.0 | 50 |
| 9022.0 | 49 |
| 9023.0 | 48 |
| 9024.0 | 49 |
| 9025.0 | 48 |
| 9026.0 | 47 |
| 9027.0 | 48 |
| 9028.0 | 47 |
| 9029.0 | 48 |
| 9030.0 | 49 |
| 9031.0 | 50 |
| 9032.0 | 49 |
| 9033.0 | 50 |
| 9034.0 | 51 |
| 9035.0 | 52 |
| 9036.0 | 53 |
| 9037.0 | 54 |
| 9038.0 | 55 |
| 9039.0 | 56 |
| 9040.0 | 57 |
| 9041.0 | 56 |
| 9042.0 | 55 |
| 9043.0 | 56 |
| 9044.0 | 57 |
| 9045.0 | 58 |
| 9046.0 | 59 |
| 9047.0 | 60 |
| 9048.0 | 59 |
| 9049.0 | 60 |
| 9050.0 | 59 |
| 9051.0 | 58 |
| 9052.0 | 59 |
| 9053.0 | 58 |
| 9054.0 | 57 |
| 9055.0 | 56 |
| 9056.0 | 57 |
| 9057.0 | 58 |
| 9058.0 | 57 |
| 9059.0 | 56 |
| 9060.0 | 55 |
| 9061.0 | 56 |
| 9062.0 | 57 |
| 9063.0 | 58 |
| 9064.0 | 59 |
| 9065.0 | 60 |
| 9066.0 | 59 |
| 9067.0 | 58 |
| 9068.0 | 59 |
| 9069.0 | 58 |
| 9070.0 | 59 |
| 9071.0 | 58 |
| 9072.0 | 59 |
| 9073.0 | 60 |
| 9074.0 | 59 |
| 9075.0 | 58 |
| 9076.0 | 59 |
| 9077.0 | 58 |
| 9078.0 | 57 |
| 9079.0 | 58 |
| 9080.0 | 57 |
| 9081.0 | 58 |
| 9082.0 | 57 |
| 9083.0 | 58 |
| 9084.0 | 57 |
| 9085.0 | 56 |
| 9086.0 | 57 |
| 9087.0 | 58 |
| 9088.0 | 57 |
| 9089.0 | 56 |
| 9090.0 | 55 |
| 9091.0 | 56 |
| 9092.0 | 55 |
| 9093.0 | 54 |
| 9094.0 | 53 |
| 9095.0 | 52 |
| 9096.0 | 53 |
| 9097.0 | 54 |
| 9098.0 | 53 |
| 9099.0 | 52 |
| 9100.0 | 51 |
| 9101.0 | 50 |
| 9102.0 | 51 |
| 9103.0 | 50 |
| 9104.0 | 51 |
| 9105.0 | 52 |
| 9106.0 | 53 |
| 9107.0 | 52 |
| 9108.0 | 53 |
| 9109.0 | 52 |
| 9110.0 | 53 |
| 9111.0 | 52 |
| 9112.0 | 53 |
| 9113.0 | 52 |
| 9114.0 | 51 |
| 9115.0 | 52 |
| 9116.0 | 51 |
| 9117.0 | 50 |
| 9118.0 | 51 |
| 9119.0 | 52 |
| 9120.0 | 53 |
| 9121.0 | 54 |
| 9122.0 | 53 |
| 9123.0 | 54 |
| 9124.0 | 53 |
| 9125.0 | 54 |
| 9126.0 | 55 |
| 9127.0 | 56 |
| 9128.0 | 57 |
| 9129.0 | 58 |
| 9130.0 | 57 |
| 9131.0 | 58 |
| 9132.0 | 57 |
| 9133.0 | 56 |
| 9134.0 | 55 |
| 9135.0 | 54 |
| 9136.0 | 53 |
| 9137.0 | 52 |
| 9138.0 | 53 |
| 9139.0 | 54 |
| 9140.0 | 53 |
| 9141.0 | 54 |
| 9142.0 | 53 |
| 9143.0 | 54 |
| 9144.0 | 55 |
| 9145.0 | 54 |
| 9146.0 | 55 |
| 9147.0 | 54 |
| 9148.0 | 53 |
| 9149.0 | 54 |
| 9150.0 | 53 |
| 9151.0 | 54 |
| 9152.0 | 53 |
| 9153.0 | 52 |
| 9154.0 | 51 |
| 9155.0 | 52 |
| 9156.0 | 53 |
| 9157.0 | 54 |
| 9158.0 | 55 |
| 9159.0 | 54 |
| 9160.0 | 53 |
| 9161.0 | 52 |
| 9162.0 | 53 |
| 9163.0 | 54 |
| 9164.0 | 53 |
| 9165.0 | 54 |
| 9166.0 | 53 |
| 9167.0 | 52 |
| 9168.0 | 51 |
| 9169.0 | 52 |
| 9170.0 | 51 |
| 9171.0 | 52 |
| 9172.0 | 51 |
| 9173.0 | 52 |
| 9174.0 | 53 |
| 9175.0 | 52 |
| 9176.0 | 51 |
| 9177.0 | 52 |
| 9178.0 | 51 |
| 9179.0 | 50 |
| 9180.0 | 49 |
| 9181.0 | 50 |
| 9182.0 | 49 |
| 9183.0 | 48 |
| 9184.0 | 49 |
| 9185.0 | 50 |
| 9186.0 | 51 |
| 9187.0 | 50 |
| 9188.0 | 49 |
| 9189.0 | 50 |
| 9190.0 | 51 |
| 9191.0 | 50 |
| 9192.0 | 49 |
| 9193.0 | 48 |
| 9194.0 | 49 |
| 9195.0 | 50 |
| 9196.0 | 51 |
| 9197.0 | 50 |
| 9198.0 | 49 |
| 9199.0 | 50 |
| 9200.0 | 51 |
| 9201.0 | 52 |
| 9202.0 | 53 |
| 9203.0 | 52 |
| 9204.0 | 51 |
| 9205.0 | 52 |
| 9206.0 | 51 |
| 9207.0 | 50 |
| 9208.0 | 51 |
| 9209.0 | 50 |
| 9210.0 | 51 |
| 9211.0 | 50 |
| 9212.0 | 51 |
| 9213.0 | 50 |
| 9214.0 | 51 |
| 9215.0 | 52 |
| 9216.0 | 51 |
| 9217.0 | 52 |
| 9218.0 | 51 |
| 9219.0 | 52 |
| 9220.0 | 51 |
| 9221.0 | 50 |
| 9222.0 | 49 |
| 9223.0 | 48 |
| 9224.0 | 49 |
| 9225.0 | 50 |
| 9226.0 | 51 |
| 9227.0 | 52 |
| 9228.0 | 53 |
| 9229.0 | 52 |
| 9230.0 | 53 |
| 9231.0 | 52 |
| 9232.0 | 53 |
| 9233.0 | 54 |
| 9234.0 | 53 |
| 9235.0 | 54 |
| 9236.0 | 55 |
| 9237.0 | 56 |
| 9238.0 | 57 |
| 9239.0 | 56 |
| 9240.0 | 55 |
| 9241.0 | 56 |
| 9242.0 | 55 |
| 9243.0 | 56 |
| 9244.0 | 55 |
| 9245.0 | 54 |
| 9246.0 | 55 |
| 9247.0 | 56 |
| 9248.0 | 57 |
| 9249.0 | 56 |
| 9250.0 | 57 |
| 9251.0 | 56 |
| 9252.0 | 57 |
| 9253.0 | 58 |
| 9254.0 | 59 |
| 9255.0 | 60 |
| 9256.0 | 59 |
| 9257.0 | 60 |
| 9258.0 | 61 |
| 9259.0 | 60 |
| 9260.0 | 59 |
| 9261.0 | 58 |
| 9262.0 | 59 |
| 9263.0 | 60 |
| 9264.0 | 59 |
| 9265.0 | 60 |
| 9266.0 | 61 |
| 9267.0 | 62 |
| 9268.0 | 61 |
| 9269.0 | 60 |
| 9270.0 | 61 |
| 9271.0 | 60 |
| 9272.0 | 61 |
| 9273.0 | 62 |
| 9274.0 | 63 |
| 9275.0 | 64 |
| 9276.0 | 65 |
| 9277.0 | 66 |
| 9278.0 | 65 |
| 9279.0 | 64 |
| 9280.0 | 63 |
| 9281.0 | 64 |
| 9282.0 | 63 |
| 9283.0 | 64 |
| 9284.0 | 65 |
| 9285.0 | 64 |
| 9286.0 | 65 |
| 9287.0 | 64 |
| 9288.0 | 63 |
| 9289.0 | 64 |
| 9290.0 | 63 |
| 9291.0 | 62 |
| 9292.0 | 63 |
| 9293.0 | 64 |
| 9294.0 | 65 |
| 9295.0 | 66 |
| 9296.0 | 67 |
| 9297.0 | 68 |
| 9298.0 | 67 |
| 9299.0 | 66 |
| 9300.0 | 65 |
| 9301.0 | 64 |
| 9302.0 | 63 |
| 9303.0 | 64 |
| 9304.0 | 63 |
| 9305.0 | 64 |
| 9306.0 | 63 |
| 9307.0 | 62 |
| 9308.0 | 63 |
| 9309.0 | 64 |
| 9310.0 | 65 |
| 9311.0 | 64 |
| 9312.0 | 65 |
| 9313.0 | 66 |
| 9314.0 | 67 |
| 9315.0 | 66 |
| 9316.0 | 67 |
| 9317.0 | 66 |
| 9318.0 | 67 |
| 9319.0 | 68 |
| 9320.0 | 67 |
| 9321.0 | 66 |
| 9322.0 | 67 |
| 9323.0 | 68 |
| 9324.0 | 69 |
| 9325.0 | 70 |
| 9326.0 | 71 |
| 9327.0 | 70 |
| 9328.0 | 69 |
| 9329.0 | 68 |
| 9330.0 | 69 |
| 9331.0 | 68 |
| 9332.0 | 69 |
| 9333.0 | 68 |
| 9334.0 | 69 |
| 9335.0 | 70 |
| 9336.0 | 71 |
| 9337.0 | 72 |
| 9338.0 | 71 |
| 9339.0 | 72 |
| 9340.0 | 71 |
| 9341.0 | 70 |
| 9342.0 | 71 |
| 9343.0 | 70 |
| 9344.0 | 71 |
| 9345.0 | 70 |
| 9346.0 | 69 |
| 9347.0 | 68 |
| 9348.0 | 67 |
| 9349.0 | 66 |
| 9350.0 | 67 |
| 9351.0 | 68 |
| 9352.0 | 69 |
| 9353.0 | 68 |
| 9354.0 | 69 |
| 9355.0 | 68 |
| 9356.0 | 67 |
| 9357.0 | 68 |
| 9358.0 | 69 |
| 9359.0 | 68 |
| 9360.0 | 67 |
| 9361.0 | 68 |
| 9362.0 | 67 |
| 9363.0 | 66 |
| 9364.0 | 65 |
| 9365.0 | 64 |
| 9366.0 | 63 |
| 9367.0 | 64 |
| 9368.0 | 65 |
| 9369.0 | 64 |
| 9370.0 | 65 |
| 9371.0 | 64 |
| 9372.0 | 63 |
| 9373.0 | 64 |
| 9374.0 | 63 |
| 9375.0 | 64 |
| 9376.0 | 65 |
| 9377.0 | 64 |
| 9378.0 | 65 |
| 9379.0 | 66 |
| 9380.0 | 67 |
| 9381.0 | 68 |
| 9382.0 | 69 |
| 9383.0 | 68 |
| 9384.0 | 69 |
| 9385.0 | 68 |
| 9386.0 | 67 |
| 9387.0 | 68 |
| 9388.0 | 69 |
| 9389.0 | 68 |
| 9390.0 | 69 |
| 9391.0 | 68 |
| 9392.0 | 67 |
| 9393.0 | 66 |
| 9394.0 | 65 |
| 9395.0 | 64 |
| 9396.0 | 65 |
| 9397.0 | 66 |
| 9398.0 | 65 |
| 9399.0 | 66 |
| 9400.0 | 67 |
| 9401.0 | 68 |
| 9402.0 | 67 |
| 9403.0 | 66 |
| 9404.0 | 65 |
| 9405.0 | 66 |
| 9406.0 | 67 |
| 9407.0 | 68 |
| 9408.0 | 69 |
| 9409.0 | 68 |
| 9410.0 | 67 |
| 9411.0 | 68 |
| 9412.0 | 69 |
| 9413.0 | 70 |
| 9414.0 | 71 |
| 9415.0 | 70 |
| 9416.0 | 71 |
| 9417.0 | 70 |
| 9418.0 | 71 |
| 9419.0 | 72 |
| 9420.0 | 71 |
| 9421.0 | 72 |
| 9422.0 | 71 |
| 9423.0 | 70 |
| 9424.0 | 69 |
| 9425.0 | 70 |
| 9426.0 | 71 |
| 9427.0 | 72 |
| 9428.0 | 71 |
| 9429.0 | 72 |
| 9430.0 | 71 |
| 9431.0 | 72 |
| 9432.0 | 71 |
| 9433.0 | 70 |
| 9434.0 | 69 |
| 9435.0 | 70 |
| 9436.0 | 69 |
| 9437.0 | 70 |
| 9438.0 | 71 |
| 9439.0 | 72 |
| 9440.0 | 73 |
| 9441.0 | 72 |
| 9442.0 | 71 |
| 9443.0 | 70 |
| 9444.0 | 71 |
| 9445.0 | 72 |
| 9446.0 | 73 |
| 9447.0 | 74 |
| 9448.0 | 75 |
| 9449.0 | 74 |
| 9450.0 | 73 |
| 9451.0 | 72 |
| 9452.0 | 73 |
| 9453.0 | 74 |
| 9454.0 | 75 |
| 9455.0 | 74 |
| 9456.0 | 73 |
| 9457.0 | 72 |
| 9458.0 | 73 |
| 9459.0 | 74 |
| 9460.0 | 75 |
| 9461.0 | 76 |
| 9462.0 | 75 |
| 9463.0 | 74 |
| 9464.0 | 75 |
| 9465.0 | 76 |
| 9466.0 | 75 |
| 9467.0 | 76 |
| 9468.0 | 77 |
| 9469.0 | 78 |
| 9470.0 | 77 |
| 9471.0 | 78 |
| 9472.0 | 79 |
| 9473.0 | 80 |
| 9474.0 | 79 |
| 9475.0 | 78 |
| 9476.0 | 79 |
| 9477.0 | 78 |
| 9478.0 | 77 |
| 9479.0 | 76 |
| 9480.0 | 75 |
| 9481.0 | 74 |
| 9482.0 | 73 |
| 9483.0 | 74 |
| 9484.0 | 73 |
| 9485.0 | 74 |
| 9486.0 | 73 |
| 9487.0 | 74 |
| 9488.0 | 75 |
| 9489.0 | 74 |
| 9490.0 | 75 |
| 9491.0 | 76 |
| 9492.0 | 77 |
| 9493.0 | 76 |
| 9494.0 | 75 |
| 9495.0 | 74 |
| 9496.0 | 75 |
| 9497.0 | 76 |
| 9498.0 | 75 |
| 9499.0 | 74 |
| 9500.0 | 73 |
| 9501.0 | 74 |
| 9502.0 | 75 |
| 9503.0 | 74 |
| 9504.0 | 73 |
| 9505.0 | 72 |
| 9506.0 | 73 |
| 9507.0 | 74 |
| 9508.0 | 73 |
| 9509.0 | 72 |
| 9510.0 | 71 |
| 9511.0 | 70 |
| 9512.0 | 71 |
| 9513.0 | 72 |
| 9514.0 | 71 |
| 9515.0 | 72 |
| 9516.0 | 71 |
| 9517.0 | 70 |
| 9518.0 | 69 |
| 9519.0 | 68 |
| 9520.0 | 67 |
| 9521.0 | 66 |
| 9522.0 | 67 |
| 9523.0 | 68 |
| 9524.0 | 69 |
| 9525.0 | 68 |
| 9526.0 | 67 |
| 9527.0 | 66 |
| 9528.0 | 65 |
| 9529.0 | 66 |
| 9530.0 | 67 |
| 9531.0 | 66 |
| 9532.0 | 65 |
| 9533.0 | 64 |
| 9534.0 | 65 |
| 9535.0 | 66 |
| 9536.0 | 67 |
| 9537.0 | 66 |
| 9538.0 | 65 |
| 9539.0 | 66 |
| 9540.0 | 65 |
| 9541.0 | 66 |
| 9542.0 | 65 |
| 9543.0 | 66 |
| 9544.0 | 65 |
| 9545.0 | 66 |
| 9546.0 | 65 |
| 9547.0 | 66 |
| 9548.0 | 65 |
| 9549.0 | 64 |
| 9550.0 | 63 |
| 9551.0 | 62 |
| 9552.0 | 61 |
| 9553.0 | 62 |
| 9554.0 | 63 |
| 9555.0 | 64 |
| 9556.0 | 63 |
| 9557.0 | 64 |
| 9558.0 | 65 |
| 9559.0 | 66 |
| 9560.0 | 67 |
| 9561.0 | 68 |
| 9562.0 | 67 |
| 9563.0 | 66 |
| 9564.0 | 67 |
| 9565.0 | 66 |
| 9566.0 | 67 |
| 9567.0 | 66 |
| 9568.0 | 67 |
| 9569.0 | 68 |
| 9570.0 | 67 |
| 9571.0 | 66 |
| 9572.0 | 65 |
| 9573.0 | 66 |
| 9574.0 | 67 |
| 9575.0 | 68 |
| 9576.0 | 69 |
| 9577.0 | 68 |
| 9578.0 | 69 |
| 9579.0 | 70 |
| 9580.0 | 69 |
| 9581.0 | 68 |
| 9582.0 | 67 |
| 9583.0 | 68 |
| 9584.0 | 67 |
| 9585.0 | 68 |
| 9586.0 | 67 |
| 9587.0 | 66 |
| 9588.0 | 67 |
| 9589.0 | 66 |
| 9590.0 | 65 |
| 9591.0 | 64 |
| 9592.0 | 63 |
| 9593.0 | 62 |
| 9594.0 | 63 |
| 9595.0 | 64 |
| 9596.0 | 65 |
| 9597.0 | 66 |
| 9598.0 | 67 |
| 9599.0 | 66 |
| 9600.0 | 67 |
| 9601.0 | 66 |
| 9602.0 | 67 |
| 9603.0 | 66 |
| 9604.0 | 65 |
| 9605.0 | 66 |
| 9606.0 | 67 |
| 9607.0 | 68 |
| 9608.0 | 67 |
| 9609.0 | 68 |
| 9610.0 | 69 |
| 9611.0 | 68 |
| 9612.0 | 67 |
| 9613.0 | 66 |
| 9614.0 | 65 |
| 9615.0 | 66 |
| 9616.0 | 65 |
| 9617.0 | 64 |
| 9618.0 | 65 |
| 9619.0 | 64 |
| 9620.0 | 63 |
| 9621.0 | 64 |
| 9622.0 | 65 |
| 9623.0 | 66 |
| 9624.0 | 67 |
| 9625.0 | 68 |
| 9626.0 | 69 |
| 9627.0 | 68 |
| 9628.0 | 69 |
| 9629.0 | 70 |
| 9630.0 | 69 |
| 9631.0 | 70 |
| 9632.0 | 71 |
| 9633.0 | 70 |
| 9634.0 | 71 |
| 9635.0 | 70 |
| 9636.0 | 71 |
| 9637.0 | 72 |
| 9638.0 | 73 |
| 9639.0 | 72 |
| 9640.0 | 73 |
| 9641.0 | 74 |
| 9642.0 | 73 |
| 9643.0 | 72 |
| 9644.0 | 73 |
| 9645.0 | 74 |
| 9646.0 | 75 |
| 9647.0 | 76 |
| 9648.0 | 75 |
| 9649.0 | 76 |
| 9650.0 | 77 |
| 9651.0 | 78 |
| 9652.0 | 77 |
| 9653.0 | 76 |
| 9654.0 | 77 |
| 9655.0 | 78 |
| 9656.0 | 77 |
| 9657.0 | 76 |
| 9658.0 | 75 |
| 9659.0 | 76 |
| 9660.0 | 77 |
| 9661.0 | 76 |
| 9662.0 | 75 |
| 9663.0 | 74 |
| 9664.0 | 75 |
| 9665.0 | 74 |
| 9666.0 | 73 |
| 9667.0 | 74 |
| 9668.0 | 75 |
| 9669.0 | 74 |
| 9670.0 | 73 |
| 9671.0 | 74 |
| 9672.0 | 73 |
| 9673.0 | 72 |
| 9674.0 | 71 |
| 9675.0 | 70 |
| 9676.0 | 69 |
| 9677.0 | 68 |
| 9678.0 | 69 |
| 9679.0 | 70 |
| 9680.0 | 71 |
| 9681.0 | 72 |
| 9682.0 | 73 |
| 9683.0 | 74 |
| 9684.0 | 75 |
| 9685.0 | 74 |
| 9686.0 | 75 |
| 9687.0 | 74 |
| 9688.0 | 75 |
| 9689.0 | 76 |
| 9690.0 | 77 |
| 9691.0 | 76 |
| 9692.0 | 77 |
| 9693.0 | 76 |
| 9694.0 | 77 |
| 9695.0 | 76 |
| 9696.0 | 75 |
| 9697.0 | 76 |
| 9698.0 | 77 |
| 9699.0 | 78 |
| 9700.0 | 77 |
| 9701.0 | 76 |
| 9702.0 | 77 |
| 9703.0 | 78 |
| 9704.0 | 77 |
| 9705.0 | 78 |
| 9706.0 | 77 |
| 9707.0 | 76 |
| 9708.0 | 75 |
| 9709.0 | 74 |
| 9710.0 | 75 |
| 9711.0 | 74 |
| 9712.0 | 75 |
| 9713.0 | 76 |
| 9714.0 | 75 |
| 9715.0 | 74 |
| 9716.0 | 73 |
| 9717.0 | 74 |
| 9718.0 | 75 |
| 9719.0 | 76 |
| 9720.0 | 75 |
| 9721.0 | 76 |
| 9722.0 | 75 |
| 9723.0 | 74 |
| 9724.0 | 75 |
| 9725.0 | 74 |
| 9726.0 | 75 |
| 9727.0 | 74 |
| 9728.0 | 73 |
| 9729.0 | 72 |
| 9730.0 | 71 |
| 9731.0 | 70 |
| 9732.0 | 71 |
| 9733.0 | 70 |
| 9734.0 | 69 |
| 9735.0 | 68 |
| 9736.0 | 67 |
| 9737.0 | 66 |
| 9738.0 | 67 |
| 9739.0 | 66 |
| 9740.0 | 65 |
| 9741.0 | 64 |
| 9742.0 | 63 |
| 9743.0 | 64 |
| 9744.0 | 65 |
| 9745.0 | 64 |
| 9746.0 | 63 |
| 9747.0 | 64 |
| 9748.0 | 65 |
| 9749.0 | 66 |
| 9750.0 | 65 |
| 9751.0 | 64 |
| 9752.0 | 65 |
| 9753.0 | 64 |
| 9754.0 | 63 |
| 9755.0 | 64 |
| 9756.0 | 65 |
| 9757.0 | 66 |
| 9758.0 | 67 |
| 9759.0 | 66 |
| 9760.0 | 67 |
| 9761.0 | 66 |
| 9762.0 | 65 |
| 9763.0 | 64 |
| 9764.0 | 63 |
| 9765.0 | 64 |
| 9766.0 | 63 |
| 9767.0 | 64 |
| 9768.0 | 65 |
| 9769.0 | 66 |
| 9770.0 | 65 |
| 9771.0 | 66 |
| 9772.0 | 65 |
| 9773.0 | 66 |
| 9774.0 | 65 |
| 9775.0 | 64 |
| 9776.0 | 63 |
| 9777.0 | 62 |
| 9778.0 | 63 |
| 9779.0 | 64 |
| 9780.0 | 63 |
| 9781.0 | 62 |
| 9782.0 | 63 |
| 9783.0 | 64 |
| 9784.0 | 65 |
| 9785.0 | 66 |
| 9786.0 | 65 |
| 9787.0 | 66 |
| 9788.0 | 65 |
| 9789.0 | 64 |
| 9790.0 | 63 |
| 9791.0 | 62 |
| 9792.0 | 61 |
| 9793.0 | 62 |
| 9794.0 | 61 |
| 9795.0 | 60 |
| 9796.0 | 61 |
| 9797.0 | 62 |
| 9798.0 | 63 |
| 9799.0 | 64 |
| 9800.0 | 63 |
| 9801.0 | 62 |
| 9802.0 | 63 |
| 9803.0 | 64 |
| 9804.0 | 65 |
| 9805.0 | 64 |
| 9806.0 | 65 |
| 9807.0 | 64 |
| 9808.0 | 65 |
| 9809.0 | 64 |
| 9810.0 | 65 |
| 9811.0 | 66 |
| 9812.0 | 67 |
| 9813.0 | 68 |
| 9814.0 | 67 |
| 9815.0 | 68 |
| 9816.0 | 69 |
| 9817.0 | 70 |
| 9818.0 | 69 |
| 9819.0 | 70 |
| 9820.0 | 71 |
| 9821.0 | 72 |
| 9822.0 | 73 |
| 9823.0 | 72 |
| 9824.0 | 71 |
| 9825.0 | 70 |
| 9826.0 | 71 |
| 9827.0 | 70 |
| 9828.0 | 71 |
| 9829.0 | 72 |
| 9830.0 | 73 |
| 9831.0 | 74 |
| 9832.0 | 75 |
| 9833.0 | 76 |
| 9834.0 | 77 |
| 9835.0 | 76 |
| 9836.0 | 75 |
| 9837.0 | 74 |
| 9838.0 | 75 |
| 9839.0 | 76 |
| 9840.0 | 77 |
| 9841.0 | 78 |
| 9842.0 | 77 |
| 9843.0 | 76 |
| 9844.0 | 77 |
| 9845.0 | 76 |
| 9846.0 | 77 |
| 9847.0 | 76 |
| 9848.0 | 77 |
| 9849.0 | 76 |
| 9850.0 | 75 |
| 9851.0 | 74 |
| 9852.0 | 75 |
| 9853.0 | 76 |
| 9854.0 | 77 |
| 9855.0 | 78 |
| 9856.0 | 77 |
| 9857.0 | 78 |
| 9858.0 | 79 |
| 9859.0 | 78 |
| 9860.0 | 77 |
| 9861.0 | 78 |
| 9862.0 | 77 |
| 9863.0 | 76 |
| 9864.0 | 77 |
| 9865.0 | 78 |
| 9866.0 | 77 |
| 9867.0 | 78 |
| 9868.0 | 77 |
| 9869.0 | 78 |
| 9870.0 | 79 |
| 9871.0 | 80 |
| 9872.0 | 79 |
| 9873.0 | 78 |
| 9874.0 | 77 |
| 9875.0 | 76 |
| 9876.0 | 77 |
| 9877.0 | 78 |
| 9878.0 | 77 |
| 9879.0 | 76 |
| 9880.0 | 75 |
| 9881.0 | 74 |
| 9882.0 | 75 |
| 9883.0 | 76 |
| 9884.0 | 75 |
| 9885.0 | 74 |
| 9886.0 | 75 |
| 9887.0 | 74 |
| 9888.0 | 75 |
| 9889.0 | 76 |
| 9890.0 | 75 |
| 9891.0 | 74 |
| 9892.0 | 73 |
| 9893.0 | 72 |
| 9894.0 | 73 |
| 9895.0 | 74 |
| 9896.0 | 73 |
| 9897.0 | 74 |
| 9898.0 | 75 |
| 9899.0 | 76 |
| 9900.0 | 75 |
| 9901.0 | 74 |
| 9902.0 | 73 |
| 9903.0 | 74 |
| 9904.0 | 73 |
| 9905.0 | 74 |
| 9906.0 | 75 |
| 9907.0 | 74 |
| 9908.0 | 75 |
| 9909.0 | 76 |
| 9910.0 | 77 |
| 9911.0 | 78 |
| 9912.0 | 79 |
| 9913.0 | 80 |
| 9914.0 | 81 |
| 9915.0 | 80 |
| 9916.0 | 79 |
| 9917.0 | 78 |
| 9918.0 | 79 |
| 9919.0 | 78 |
| 9920.0 | 79 |
| 9921.0 | 80 |
| 9922.0 | 79 |
| 9923.0 | 80 |
| 9924.0 | 81 |
| 9925.0 | 82 |
| 9926.0 | 83 |
| 9927.0 | 84 |
| 9928.0 | 85 |
| 9929.0 | 84 |
| 9930.0 | 85 |
| 9931.0 | 86 |
| 9932.0 | 87 |
| 9933.0 | 88 |
| 9934.0 | 89 |
| 9935.0 | 90 |
| 9936.0 | 89 |
| 9937.0 | 88 |
| 9938.0 | 89 |
| 9939.0 | 88 |
| 9940.0 | 87 |
| 9941.0 | 88 |
| 9942.0 | 89 |
| 9943.0 | 90 |
| 9944.0 | 91 |
| 9945.0 | 90 |
| 9946.0 | 91 |
| 9947.0 | 90 |
| 9948.0 | 91 |
| 9949.0 | 90 |
| 9950.0 | 91 |
| 9951.0 | 92 |
| 9952.0 | 91 |
| 9953.0 | 92 |
| 9954.0 | 91 |
| 9955.0 | 90 |
| 9956.0 | 89 |
| 9957.0 | 88 |
| 9958.0 | 89 |
| 9959.0 | 90 |
| 9960.0 | 89 |
| 9961.0 | 88 |
| 9962.0 | 89 |
| 9963.0 | 88 |
| 9964.0 | 89 |
| 9965.0 | 90 |
| 9966.0 | 89 |
| 9967.0 | 90 |
| 9968.0 | 91 |
| 9969.0 | 90 |
| 9970.0 | 91 |
| 9971.0 | 92 |
| 9972.0 | 93 |
| 9973.0 | 92 |
| 9974.0 | 93 |
| 9975.0 | 94 |
| 9976.0 | 95 |
| 9977.0 | 96 |
| 9978.0 | 97 |
| 9979.0 | 96 |
| 9980.0 | 95 |
| 9981.0 | 94 |
| 9982.0 | 93 |
| 9983.0 | 94 |
| 9984.0 | 95 |
| 9985.0 | 94 |
| 9986.0 | 95 |
| 9987.0 | 94 |
| 9988.0 | 95 |
| 9989.0 | 96 |
| 9990.0 | 95 |
| 9991.0 | 94 |
| 9992.0 | 95 |
| 9993.0 | 96 |
| 9994.0 | 97 |
| 9995.0 | 96 |
| 9996.0 | 97 |
| 9997.0 | 98 |
| 9998.0 | 97 |
| 9999.0 | 98 |
| 10000.0 | 97 |